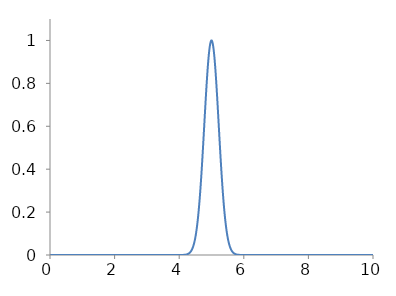
| Category | Series 0 |
|---|---|
| 0.0 | 0 |
| 0.001 | 0 |
| 0.002 | 0 |
| 0.003 | 0 |
| 0.004 | 0 |
| 0.005 | 0 |
| 0.006 | 0 |
| 0.007 | 0 |
| 0.008 | 0 |
| 0.009 | 0 |
| 0.01 | 0 |
| 0.011 | 0 |
| 0.012 | 0 |
| 0.013 | 0 |
| 0.014 | 0 |
| 0.015 | 0 |
| 0.016 | 0 |
| 0.017 | 0 |
| 0.018 | 0 |
| 0.019 | 0 |
| 0.02 | 0 |
| 0.021 | 0 |
| 0.022 | 0 |
| 0.023 | 0 |
| 0.024 | 0 |
| 0.025 | 0 |
| 0.026 | 0 |
| 0.027 | 0 |
| 0.028 | 0 |
| 0.029 | 0 |
| 0.03 | 0 |
| 0.031 | 0 |
| 0.032 | 0 |
| 0.033 | 0 |
| 0.034 | 0 |
| 0.035 | 0 |
| 0.036 | 0 |
| 0.037 | 0 |
| 0.038 | 0 |
| 0.039 | 0 |
| 0.04 | 0 |
| 0.041 | 0 |
| 0.042 | 0 |
| 0.043 | 0 |
| 0.044 | 0 |
| 0.045 | 0 |
| 0.046 | 0 |
| 0.047 | 0 |
| 0.048 | 0 |
| 0.049 | 0 |
| 0.05 | 0 |
| 0.051 | 0 |
| 0.052 | 0 |
| 0.053 | 0 |
| 0.054 | 0 |
| 0.055 | 0 |
| 0.056 | 0 |
| 0.057 | 0 |
| 0.058 | 0 |
| 0.059 | 0 |
| 0.06 | 0 |
| 0.061 | 0 |
| 0.062 | 0 |
| 0.063 | 0 |
| 0.064 | 0 |
| 0.065 | 0 |
| 0.066 | 0 |
| 0.067 | 0 |
| 0.068 | 0 |
| 0.069 | 0 |
| 0.07 | 0 |
| 0.071 | 0 |
| 0.072 | 0 |
| 0.073 | 0 |
| 0.074 | 0 |
| 0.075 | 0 |
| 0.076 | 0 |
| 0.077 | 0 |
| 0.078 | 0 |
| 0.079 | 0 |
| 0.08 | 0 |
| 0.081 | 0 |
| 0.082 | 0 |
| 0.083 | 0 |
| 0.084 | 0 |
| 0.085 | 0 |
| 0.086 | 0 |
| 0.087 | 0 |
| 0.088 | 0 |
| 0.089 | 0 |
| 0.09 | 0 |
| 0.091 | 0 |
| 0.092 | 0 |
| 0.093 | 0 |
| 0.094 | 0 |
| 0.095 | 0 |
| 0.096 | 0 |
| 0.097 | 0 |
| 0.098 | 0 |
| 0.099 | 0 |
| 0.1 | 0 |
| 0.101 | 0 |
| 0.102 | 0 |
| 0.103 | 0 |
| 0.104 | 0 |
| 0.105 | 0 |
| 0.106 | 0 |
| 0.107 | 0 |
| 0.108 | 0 |
| 0.109 | 0 |
| 0.11 | 0 |
| 0.111 | 0 |
| 0.112 | 0 |
| 0.113 | 0 |
| 0.114 | 0 |
| 0.115 | 0 |
| 0.116 | 0 |
| 0.117 | 0 |
| 0.118 | 0 |
| 0.119 | 0 |
| 0.12 | 0 |
| 0.121 | 0 |
| 0.122 | 0 |
| 0.123 | 0 |
| 0.124 | 0 |
| 0.125 | 0 |
| 0.126 | 0 |
| 0.127 | 0 |
| 0.128 | 0 |
| 0.129 | 0 |
| 0.13 | 0 |
| 0.131 | 0 |
| 0.132 | 0 |
| 0.133 | 0 |
| 0.134 | 0 |
| 0.135 | 0 |
| 0.136 | 0 |
| 0.137 | 0 |
| 0.138 | 0 |
| 0.139 | 0 |
| 0.14 | 0 |
| 0.141 | 0 |
| 0.142 | 0 |
| 0.143 | 0 |
| 0.144 | 0 |
| 0.145 | 0 |
| 0.146 | 0 |
| 0.147 | 0 |
| 0.148 | 0 |
| 0.149 | 0 |
| 0.15 | 0 |
| 0.151 | 0 |
| 0.152 | 0 |
| 0.153 | 0 |
| 0.154 | 0 |
| 0.155 | 0 |
| 0.156 | 0 |
| 0.157 | 0 |
| 0.158 | 0 |
| 0.159 | 0 |
| 0.16 | 0 |
| 0.161 | 0 |
| 0.162 | 0 |
| 0.163 | 0 |
| 0.164 | 0 |
| 0.165 | 0 |
| 0.166 | 0 |
| 0.167 | 0 |
| 0.168 | 0 |
| 0.169 | 0 |
| 0.17 | 0 |
| 0.171 | 0 |
| 0.172 | 0 |
| 0.173 | 0 |
| 0.174 | 0 |
| 0.175 | 0 |
| 0.176 | 0 |
| 0.177 | 0 |
| 0.178 | 0 |
| 0.179 | 0 |
| 0.18 | 0 |
| 0.181 | 0 |
| 0.182 | 0 |
| 0.183 | 0 |
| 0.184 | 0 |
| 0.185 | 0 |
| 0.186 | 0 |
| 0.187 | 0 |
| 0.188 | 0 |
| 0.189 | 0 |
| 0.19 | 0 |
| 0.191 | 0 |
| 0.192 | 0 |
| 0.193 | 0 |
| 0.194 | 0 |
| 0.195 | 0 |
| 0.196 | 0 |
| 0.197 | 0 |
| 0.198 | 0 |
| 0.199 | 0 |
| 0.2 | 0 |
| 0.201 | 0 |
| 0.202 | 0 |
| 0.203 | 0 |
| 0.204 | 0 |
| 0.205 | 0 |
| 0.206 | 0 |
| 0.207 | 0 |
| 0.208 | 0 |
| 0.209 | 0 |
| 0.21 | 0 |
| 0.211 | 0 |
| 0.212 | 0 |
| 0.213 | 0 |
| 0.214 | 0 |
| 0.215 | 0 |
| 0.216 | 0 |
| 0.217 | 0 |
| 0.218 | 0 |
| 0.219 | 0 |
| 0.22 | 0 |
| 0.221 | 0 |
| 0.222 | 0 |
| 0.223 | 0 |
| 0.224 | 0 |
| 0.225 | 0 |
| 0.226 | 0 |
| 0.227 | 0 |
| 0.228 | 0 |
| 0.229 | 0 |
| 0.23 | 0 |
| 0.231 | 0 |
| 0.232 | 0 |
| 0.233 | 0 |
| 0.234 | 0 |
| 0.235 | 0 |
| 0.236 | 0 |
| 0.237 | 0 |
| 0.238 | 0 |
| 0.239 | 0 |
| 0.24 | 0 |
| 0.241 | 0 |
| 0.242 | 0 |
| 0.243 | 0 |
| 0.244 | 0 |
| 0.245 | 0 |
| 0.246 | 0 |
| 0.247 | 0 |
| 0.248 | 0 |
| 0.249 | 0 |
| 0.25 | 0 |
| 0.251 | 0 |
| 0.252 | 0 |
| 0.253 | 0 |
| 0.254 | 0 |
| 0.255 | 0 |
| 0.256 | 0 |
| 0.257 | 0 |
| 0.258 | 0 |
| 0.259 | 0 |
| 0.26 | 0 |
| 0.261 | 0 |
| 0.262 | 0 |
| 0.263 | 0 |
| 0.264 | 0 |
| 0.265 | 0 |
| 0.266 | 0 |
| 0.267 | 0 |
| 0.268 | 0 |
| 0.269 | 0 |
| 0.27 | 0 |
| 0.271 | 0 |
| 0.272 | 0 |
| 0.273 | 0 |
| 0.274 | 0 |
| 0.275 | 0 |
| 0.276 | 0 |
| 0.277 | 0 |
| 0.278 | 0 |
| 0.279 | 0 |
| 0.28 | 0 |
| 0.281 | 0 |
| 0.282 | 0 |
| 0.283 | 0 |
| 0.284 | 0 |
| 0.285 | 0 |
| 0.286 | 0 |
| 0.287 | 0 |
| 0.288 | 0 |
| 0.289 | 0 |
| 0.29 | 0 |
| 0.291 | 0 |
| 0.292 | 0 |
| 0.293 | 0 |
| 0.294 | 0 |
| 0.295 | 0 |
| 0.296 | 0 |
| 0.297 | 0 |
| 0.298 | 0 |
| 0.299 | 0 |
| 0.3 | 0 |
| 0.301 | 0 |
| 0.302 | 0 |
| 0.303 | 0 |
| 0.304 | 0 |
| 0.305 | 0 |
| 0.306 | 0 |
| 0.307 | 0 |
| 0.308 | 0 |
| 0.309 | 0 |
| 0.31 | 0 |
| 0.311 | 0 |
| 0.312 | 0 |
| 0.313 | 0 |
| 0.314 | 0 |
| 0.315 | 0 |
| 0.316 | 0 |
| 0.317 | 0 |
| 0.318 | 0 |
| 0.319 | 0 |
| 0.32 | 0 |
| 0.321 | 0 |
| 0.322 | 0 |
| 0.323 | 0 |
| 0.324 | 0 |
| 0.325 | 0 |
| 0.326 | 0 |
| 0.327 | 0 |
| 0.328 | 0 |
| 0.329 | 0 |
| 0.33 | 0 |
| 0.331 | 0 |
| 0.332 | 0 |
| 0.333 | 0 |
| 0.334 | 0 |
| 0.335 | 0 |
| 0.336 | 0 |
| 0.337 | 0 |
| 0.338 | 0 |
| 0.339 | 0 |
| 0.34 | 0 |
| 0.341 | 0 |
| 0.342 | 0 |
| 0.343 | 0 |
| 0.344 | 0 |
| 0.345 | 0 |
| 0.346 | 0 |
| 0.347 | 0 |
| 0.348 | 0 |
| 0.349 | 0 |
| 0.35 | 0 |
| 0.351 | 0 |
| 0.352 | 0 |
| 0.353 | 0 |
| 0.354 | 0 |
| 0.355 | 0 |
| 0.356 | 0 |
| 0.357 | 0 |
| 0.358 | 0 |
| 0.359 | 0 |
| 0.36 | 0 |
| 0.361 | 0 |
| 0.362 | 0 |
| 0.363 | 0 |
| 0.364 | 0 |
| 0.365 | 0 |
| 0.366 | 0 |
| 0.367 | 0 |
| 0.368 | 0 |
| 0.369 | 0 |
| 0.37 | 0 |
| 0.371 | 0 |
| 0.372 | 0 |
| 0.373 | 0 |
| 0.374 | 0 |
| 0.375 | 0 |
| 0.376 | 0 |
| 0.377 | 0 |
| 0.378 | 0 |
| 0.379 | 0 |
| 0.38 | 0 |
| 0.381 | 0 |
| 0.382 | 0 |
| 0.383 | 0 |
| 0.384 | 0 |
| 0.385 | 0 |
| 0.386 | 0 |
| 0.387 | 0 |
| 0.388 | 0 |
| 0.389 | 0 |
| 0.39 | 0 |
| 0.391 | 0 |
| 0.392 | 0 |
| 0.393 | 0 |
| 0.394 | 0 |
| 0.395 | 0 |
| 0.396 | 0 |
| 0.397 | 0 |
| 0.398 | 0 |
| 0.399 | 0 |
| 0.4 | 0 |
| 0.401 | 0 |
| 0.402 | 0 |
| 0.403 | 0 |
| 0.404 | 0 |
| 0.405 | 0 |
| 0.406 | 0 |
| 0.407 | 0 |
| 0.408 | 0 |
| 0.409 | 0 |
| 0.41 | 0 |
| 0.411 | 0 |
| 0.412 | 0 |
| 0.413 | 0 |
| 0.414 | 0 |
| 0.415 | 0 |
| 0.416 | 0 |
| 0.417 | 0 |
| 0.418 | 0 |
| 0.419 | 0 |
| 0.42 | 0 |
| 0.421 | 0 |
| 0.422 | 0 |
| 0.423 | 0 |
| 0.424 | 0 |
| 0.425 | 0 |
| 0.426 | 0 |
| 0.427 | 0 |
| 0.428 | 0 |
| 0.429 | 0 |
| 0.43 | 0 |
| 0.431 | 0 |
| 0.432 | 0 |
| 0.433 | 0 |
| 0.434 | 0 |
| 0.435 | 0 |
| 0.436 | 0 |
| 0.437 | 0 |
| 0.438 | 0 |
| 0.439 | 0 |
| 0.44 | 0 |
| 0.441 | 0 |
| 0.442 | 0 |
| 0.443 | 0 |
| 0.444 | 0 |
| 0.445 | 0 |
| 0.446 | 0 |
| 0.447 | 0 |
| 0.448 | 0 |
| 0.449 | 0 |
| 0.45 | 0 |
| 0.451 | 0 |
| 0.452 | 0 |
| 0.453 | 0 |
| 0.454 | 0 |
| 0.455 | 0 |
| 0.456 | 0 |
| 0.457 | 0 |
| 0.458 | 0 |
| 0.459 | 0 |
| 0.46 | 0 |
| 0.461 | 0 |
| 0.462 | 0 |
| 0.463 | 0 |
| 0.464 | 0 |
| 0.465 | 0 |
| 0.466 | 0 |
| 0.467 | 0 |
| 0.468 | 0 |
| 0.469 | 0 |
| 0.47 | 0 |
| 0.471 | 0 |
| 0.472 | 0 |
| 0.473 | 0 |
| 0.474 | 0 |
| 0.475 | 0 |
| 0.476 | 0 |
| 0.477 | 0 |
| 0.478 | 0 |
| 0.479 | 0 |
| 0.48 | 0 |
| 0.481 | 0 |
| 0.482 | 0 |
| 0.483 | 0 |
| 0.484 | 0 |
| 0.485 | 0 |
| 0.486 | 0 |
| 0.487 | 0 |
| 0.488 | 0 |
| 0.489 | 0 |
| 0.49 | 0 |
| 0.491 | 0 |
| 0.492 | 0 |
| 0.493 | 0 |
| 0.494 | 0 |
| 0.495 | 0 |
| 0.496 | 0 |
| 0.497 | 0 |
| 0.498 | 0 |
| 0.499 | 0 |
| 0.5 | 0 |
| 0.501 | 0 |
| 0.502 | 0 |
| 0.503 | 0 |
| 0.504 | 0 |
| 0.505 | 0 |
| 0.506 | 0 |
| 0.507 | 0 |
| 0.508 | 0 |
| 0.509 | 0 |
| 0.51 | 0 |
| 0.511 | 0 |
| 0.512 | 0 |
| 0.513 | 0 |
| 0.514 | 0 |
| 0.515 | 0 |
| 0.516 | 0 |
| 0.517 | 0 |
| 0.518 | 0 |
| 0.519 | 0 |
| 0.52 | 0 |
| 0.521 | 0 |
| 0.522 | 0 |
| 0.523 | 0 |
| 0.524 | 0 |
| 0.525 | 0 |
| 0.526 | 0 |
| 0.527 | 0 |
| 0.528 | 0 |
| 0.529 | 0 |
| 0.53 | 0 |
| 0.531 | 0 |
| 0.532 | 0 |
| 0.533 | 0 |
| 0.534 | 0 |
| 0.535 | 0 |
| 0.536 | 0 |
| 0.537 | 0 |
| 0.538 | 0 |
| 0.539 | 0 |
| 0.54 | 0 |
| 0.541 | 0 |
| 0.542 | 0 |
| 0.543 | 0 |
| 0.544 | 0 |
| 0.545 | 0 |
| 0.546 | 0 |
| 0.547 | 0 |
| 0.548 | 0 |
| 0.549 | 0 |
| 0.55 | 0 |
| 0.551 | 0 |
| 0.552 | 0 |
| 0.553 | 0 |
| 0.554 | 0 |
| 0.555 | 0 |
| 0.556 | 0 |
| 0.557 | 0 |
| 0.558 | 0 |
| 0.559 | 0 |
| 0.56 | 0 |
| 0.561 | 0 |
| 0.562 | 0 |
| 0.563 | 0 |
| 0.564 | 0 |
| 0.565 | 0 |
| 0.566 | 0 |
| 0.567 | 0 |
| 0.568 | 0 |
| 0.569 | 0 |
| 0.57 | 0 |
| 0.571 | 0 |
| 0.572 | 0 |
| 0.573 | 0 |
| 0.574 | 0 |
| 0.575 | 0 |
| 0.576 | 0 |
| 0.577 | 0 |
| 0.578 | 0 |
| 0.579 | 0 |
| 0.58 | 0 |
| 0.581 | 0 |
| 0.582 | 0 |
| 0.583 | 0 |
| 0.584 | 0 |
| 0.585 | 0 |
| 0.586 | 0 |
| 0.587 | 0 |
| 0.588 | 0 |
| 0.589 | 0 |
| 0.59 | 0 |
| 0.591 | 0 |
| 0.592 | 0 |
| 0.593 | 0 |
| 0.594 | 0 |
| 0.595 | 0 |
| 0.596 | 0 |
| 0.597 | 0 |
| 0.598 | 0 |
| 0.599 | 0 |
| 0.6 | 0 |
| 0.601 | 0 |
| 0.602 | 0 |
| 0.603 | 0 |
| 0.604 | 0 |
| 0.605 | 0 |
| 0.606 | 0 |
| 0.607 | 0 |
| 0.608 | 0 |
| 0.609 | 0 |
| 0.61 | 0 |
| 0.611 | 0 |
| 0.612 | 0 |
| 0.613 | 0 |
| 0.614 | 0 |
| 0.615 | 0 |
| 0.616 | 0 |
| 0.617 | 0 |
| 0.618 | 0 |
| 0.619 | 0 |
| 0.62 | 0 |
| 0.621 | 0 |
| 0.622 | 0 |
| 0.623 | 0 |
| 0.624 | 0 |
| 0.625 | 0 |
| 0.626 | 0 |
| 0.627 | 0 |
| 0.628 | 0 |
| 0.629 | 0 |
| 0.63 | 0 |
| 0.631 | 0 |
| 0.632 | 0 |
| 0.633 | 0 |
| 0.634 | 0 |
| 0.635 | 0 |
| 0.636 | 0 |
| 0.637 | 0 |
| 0.638 | 0 |
| 0.639 | 0 |
| 0.64 | 0 |
| 0.641 | 0 |
| 0.642 | 0 |
| 0.643 | 0 |
| 0.644 | 0 |
| 0.645 | 0 |
| 0.646 | 0 |
| 0.647 | 0 |
| 0.648 | 0 |
| 0.649 | 0 |
| 0.65 | 0 |
| 0.651 | 0 |
| 0.652 | 0 |
| 0.653 | 0 |
| 0.654 | 0 |
| 0.655 | 0 |
| 0.656 | 0 |
| 0.657 | 0 |
| 0.658 | 0 |
| 0.659 | 0 |
| 0.66 | 0 |
| 0.661 | 0 |
| 0.662 | 0 |
| 0.663 | 0 |
| 0.664 | 0 |
| 0.665 | 0 |
| 0.666 | 0 |
| 0.667 | 0 |
| 0.668 | 0 |
| 0.669 | 0 |
| 0.67 | 0 |
| 0.671 | 0 |
| 0.672 | 0 |
| 0.673 | 0 |
| 0.674 | 0 |
| 0.675 | 0 |
| 0.676 | 0 |
| 0.677 | 0 |
| 0.678 | 0 |
| 0.679 | 0 |
| 0.68 | 0 |
| 0.681 | 0 |
| 0.682 | 0 |
| 0.683 | 0 |
| 0.684 | 0 |
| 0.685 | 0 |
| 0.686 | 0 |
| 0.687 | 0 |
| 0.688 | 0 |
| 0.689 | 0 |
| 0.69 | 0 |
| 0.691 | 0 |
| 0.692 | 0 |
| 0.693 | 0 |
| 0.694 | 0 |
| 0.695 | 0 |
| 0.696 | 0 |
| 0.697 | 0 |
| 0.698 | 0 |
| 0.699 | 0 |
| 0.7 | 0 |
| 0.701 | 0 |
| 0.702 | 0 |
| 0.703 | 0 |
| 0.704 | 0 |
| 0.705 | 0 |
| 0.706 | 0 |
| 0.707 | 0 |
| 0.708 | 0 |
| 0.709 | 0 |
| 0.71 | 0 |
| 0.711 | 0 |
| 0.712 | 0 |
| 0.713 | 0 |
| 0.714 | 0 |
| 0.715 | 0 |
| 0.716 | 0 |
| 0.717 | 0 |
| 0.718 | 0 |
| 0.719 | 0 |
| 0.72 | 0 |
| 0.721 | 0 |
| 0.722 | 0 |
| 0.723 | 0 |
| 0.724 | 0 |
| 0.725 | 0 |
| 0.726 | 0 |
| 0.727 | 0 |
| 0.728 | 0 |
| 0.729 | 0 |
| 0.73 | 0 |
| 0.731 | 0 |
| 0.732 | 0 |
| 0.733 | 0 |
| 0.734 | 0 |
| 0.735 | 0 |
| 0.736 | 0 |
| 0.737 | 0 |
| 0.738 | 0 |
| 0.739 | 0 |
| 0.74 | 0 |
| 0.741 | 0 |
| 0.742 | 0 |
| 0.743 | 0 |
| 0.744 | 0 |
| 0.745 | 0 |
| 0.746 | 0 |
| 0.747 | 0 |
| 0.748 | 0 |
| 0.749 | 0 |
| 0.75 | 0 |
| 0.751 | 0 |
| 0.752 | 0 |
| 0.753 | 0 |
| 0.754 | 0 |
| 0.755 | 0 |
| 0.756 | 0 |
| 0.757 | 0 |
| 0.758 | 0 |
| 0.759 | 0 |
| 0.76 | 0 |
| 0.761 | 0 |
| 0.762 | 0 |
| 0.763 | 0 |
| 0.764 | 0 |
| 0.765 | 0 |
| 0.766 | 0 |
| 0.767 | 0 |
| 0.768 | 0 |
| 0.769 | 0 |
| 0.77 | 0 |
| 0.771 | 0 |
| 0.772 | 0 |
| 0.773 | 0 |
| 0.774 | 0 |
| 0.775 | 0 |
| 0.776 | 0 |
| 0.777 | 0 |
| 0.778 | 0 |
| 0.779 | 0 |
| 0.78 | 0 |
| 0.781 | 0 |
| 0.782 | 0 |
| 0.783 | 0 |
| 0.784 | 0 |
| 0.785 | 0 |
| 0.786 | 0 |
| 0.787 | 0 |
| 0.788 | 0 |
| 0.789 | 0 |
| 0.79 | 0 |
| 0.791 | 0 |
| 0.792 | 0 |
| 0.793 | 0 |
| 0.794 | 0 |
| 0.795 | 0 |
| 0.796 | 0 |
| 0.797 | 0 |
| 0.798 | 0 |
| 0.799 | 0 |
| 0.8 | 0 |
| 0.801 | 0 |
| 0.802 | 0 |
| 0.803 | 0 |
| 0.804 | 0 |
| 0.805 | 0 |
| 0.806 | 0 |
| 0.807 | 0 |
| 0.808 | 0 |
| 0.809 | 0 |
| 0.81 | 0 |
| 0.811 | 0 |
| 0.812 | 0 |
| 0.813 | 0 |
| 0.814 | 0 |
| 0.815 | 0 |
| 0.816 | 0 |
| 0.817 | 0 |
| 0.818 | 0 |
| 0.819 | 0 |
| 0.82 | 0 |
| 0.821 | 0 |
| 0.822 | 0 |
| 0.823 | 0 |
| 0.824 | 0 |
| 0.825 | 0 |
| 0.826 | 0 |
| 0.827 | 0 |
| 0.828 | 0 |
| 0.829 | 0 |
| 0.83 | 0 |
| 0.831 | 0 |
| 0.832 | 0 |
| 0.833 | 0 |
| 0.834 | 0 |
| 0.835 | 0 |
| 0.836 | 0 |
| 0.837 | 0 |
| 0.838 | 0 |
| 0.839 | 0 |
| 0.84 | 0 |
| 0.841 | 0 |
| 0.842 | 0 |
| 0.843 | 0 |
| 0.844 | 0 |
| 0.845 | 0 |
| 0.846 | 0 |
| 0.847 | 0 |
| 0.848 | 0 |
| 0.849 | 0 |
| 0.85 | 0 |
| 0.851 | 0 |
| 0.852 | 0 |
| 0.853 | 0 |
| 0.854 | 0 |
| 0.855 | 0 |
| 0.856 | 0 |
| 0.857 | 0 |
| 0.858 | 0 |
| 0.859 | 0 |
| 0.86 | 0 |
| 0.861 | 0 |
| 0.862 | 0 |
| 0.863 | 0 |
| 0.864 | 0 |
| 0.865 | 0 |
| 0.866 | 0 |
| 0.867 | 0 |
| 0.868 | 0 |
| 0.869 | 0 |
| 0.87 | 0 |
| 0.871 | 0 |
| 0.872 | 0 |
| 0.873 | 0 |
| 0.874 | 0 |
| 0.875 | 0 |
| 0.876 | 0 |
| 0.877 | 0 |
| 0.878 | 0 |
| 0.879 | 0 |
| 0.88 | 0 |
| 0.881 | 0 |
| 0.882 | 0 |
| 0.883 | 0 |
| 0.884 | 0 |
| 0.885 | 0 |
| 0.886 | 0 |
| 0.887 | 0 |
| 0.888 | 0 |
| 0.889 | 0 |
| 0.89 | 0 |
| 0.891 | 0 |
| 0.892 | 0 |
| 0.893 | 0 |
| 0.894 | 0 |
| 0.895 | 0 |
| 0.896 | 0 |
| 0.897 | 0 |
| 0.898 | 0 |
| 0.899 | 0 |
| 0.9 | 0 |
| 0.901 | 0 |
| 0.902 | 0 |
| 0.903 | 0 |
| 0.904 | 0 |
| 0.905 | 0 |
| 0.906 | 0 |
| 0.907 | 0 |
| 0.908 | 0 |
| 0.909 | 0 |
| 0.91 | 0 |
| 0.911 | 0 |
| 0.912 | 0 |
| 0.913 | 0 |
| 0.914 | 0 |
| 0.915 | 0 |
| 0.916 | 0 |
| 0.917 | 0 |
| 0.918 | 0 |
| 0.919 | 0 |
| 0.92 | 0 |
| 0.921 | 0 |
| 0.922 | 0 |
| 0.923 | 0 |
| 0.924 | 0 |
| 0.925 | 0 |
| 0.926 | 0 |
| 0.927 | 0 |
| 0.928 | 0 |
| 0.929 | 0 |
| 0.93 | 0 |
| 0.931 | 0 |
| 0.932 | 0 |
| 0.933 | 0 |
| 0.934 | 0 |
| 0.935 | 0 |
| 0.936 | 0 |
| 0.937 | 0 |
| 0.938 | 0 |
| 0.939 | 0 |
| 0.94 | 0 |
| 0.941 | 0 |
| 0.942 | 0 |
| 0.943 | 0 |
| 0.944 | 0 |
| 0.945 | 0 |
| 0.946 | 0 |
| 0.947 | 0 |
| 0.948 | 0 |
| 0.949 | 0 |
| 0.95 | 0 |
| 0.951 | 0 |
| 0.952 | 0 |
| 0.953 | 0 |
| 0.954 | 0 |
| 0.955 | 0 |
| 0.956 | 0 |
| 0.957 | 0 |
| 0.958 | 0 |
| 0.959 | 0 |
| 0.96 | 0 |
| 0.961 | 0 |
| 0.962 | 0 |
| 0.963 | 0 |
| 0.964 | 0 |
| 0.965 | 0 |
| 0.966 | 0 |
| 0.967 | 0 |
| 0.968 | 0 |
| 0.969 | 0 |
| 0.97 | 0 |
| 0.971 | 0 |
| 0.972 | 0 |
| 0.973 | 0 |
| 0.974 | 0 |
| 0.975 | 0 |
| 0.976 | 0 |
| 0.977 | 0 |
| 0.978 | 0 |
| 0.979 | 0 |
| 0.98 | 0 |
| 0.981 | 0 |
| 0.982 | 0 |
| 0.983 | 0 |
| 0.984 | 0 |
| 0.985 | 0 |
| 0.986 | 0 |
| 0.987 | 0 |
| 0.988 | 0 |
| 0.989 | 0 |
| 0.99 | 0 |
| 0.991 | 0 |
| 0.992 | 0 |
| 0.993 | 0 |
| 0.994 | 0 |
| 0.995 | 0 |
| 0.996 | 0 |
| 0.997 | 0 |
| 0.998 | 0 |
| 0.999 | 0 |
| 1.0 | 0 |
| 1.001 | 0 |
| 1.002 | 0 |
| 1.003 | 0 |
| 1.004 | 0 |
| 1.005 | 0 |
| 1.006 | 0 |
| 1.007 | 0 |
| 1.008 | 0 |
| 1.009 | 0 |
| 1.01 | 0 |
| 1.011 | 0 |
| 1.012 | 0 |
| 1.013 | 0 |
| 1.014 | 0 |
| 1.015 | 0 |
| 1.016 | 0 |
| 1.017 | 0 |
| 1.018 | 0 |
| 1.019 | 0 |
| 1.02 | 0 |
| 1.021 | 0 |
| 1.022 | 0 |
| 1.023 | 0 |
| 1.024 | 0 |
| 1.025 | 0 |
| 1.026 | 0 |
| 1.027 | 0 |
| 1.028 | 0 |
| 1.029 | 0 |
| 1.03 | 0 |
| 1.031 | 0 |
| 1.032 | 0 |
| 1.033 | 0 |
| 1.034 | 0 |
| 1.035 | 0 |
| 1.036 | 0 |
| 1.037 | 0 |
| 1.038 | 0 |
| 1.039 | 0 |
| 1.04 | 0 |
| 1.041 | 0 |
| 1.042 | 0 |
| 1.043 | 0 |
| 1.044 | 0 |
| 1.045 | 0 |
| 1.046 | 0 |
| 1.047 | 0 |
| 1.048 | 0 |
| 1.049 | 0 |
| 1.05 | 0 |
| 1.051 | 0 |
| 1.052 | 0 |
| 1.053 | 0 |
| 1.054 | 0 |
| 1.055 | 0 |
| 1.056 | 0 |
| 1.057 | 0 |
| 1.058 | 0 |
| 1.059 | 0 |
| 1.06 | 0 |
| 1.061 | 0 |
| 1.062 | 0 |
| 1.063 | 0 |
| 1.064 | 0 |
| 1.065 | 0 |
| 1.066 | 0 |
| 1.067 | 0 |
| 1.068 | 0 |
| 1.069 | 0 |
| 1.07 | 0 |
| 1.071 | 0 |
| 1.072 | 0 |
| 1.073 | 0 |
| 1.074 | 0 |
| 1.075 | 0 |
| 1.076 | 0 |
| 1.077 | 0 |
| 1.078 | 0 |
| 1.079 | 0 |
| 1.08 | 0 |
| 1.081 | 0 |
| 1.082 | 0 |
| 1.083 | 0 |
| 1.084 | 0 |
| 1.085 | 0 |
| 1.086 | 0 |
| 1.087 | 0 |
| 1.088 | 0 |
| 1.089 | 0 |
| 1.09 | 0 |
| 1.091 | 0 |
| 1.092 | 0 |
| 1.093 | 0 |
| 1.094 | 0 |
| 1.095 | 0 |
| 1.096 | 0 |
| 1.097 | 0 |
| 1.098 | 0 |
| 1.099 | 0 |
| 1.1 | 0 |
| 1.101 | 0 |
| 1.102 | 0 |
| 1.103 | 0 |
| 1.104 | 0 |
| 1.105 | 0 |
| 1.106 | 0 |
| 1.107 | 0 |
| 1.108 | 0 |
| 1.109 | 0 |
| 1.11 | 0 |
| 1.111 | 0 |
| 1.112 | 0 |
| 1.113 | 0 |
| 1.114 | 0 |
| 1.115 | 0 |
| 1.116 | 0 |
| 1.117 | 0 |
| 1.118 | 0 |
| 1.119 | 0 |
| 1.12 | 0 |
| 1.121 | 0 |
| 1.122 | 0 |
| 1.123 | 0 |
| 1.124 | 0 |
| 1.125 | 0 |
| 1.126 | 0 |
| 1.127 | 0 |
| 1.128 | 0 |
| 1.129 | 0 |
| 1.13 | 0 |
| 1.131 | 0 |
| 1.132 | 0 |
| 1.133 | 0 |
| 1.134 | 0 |
| 1.135 | 0 |
| 1.136 | 0 |
| 1.137 | 0 |
| 1.138 | 0 |
| 1.139 | 0 |
| 1.14 | 0 |
| 1.141 | 0 |
| 1.142 | 0 |
| 1.143 | 0 |
| 1.144 | 0 |
| 1.145 | 0 |
| 1.146 | 0 |
| 1.147 | 0 |
| 1.148 | 0 |
| 1.149 | 0 |
| 1.15 | 0 |
| 1.151 | 0 |
| 1.152 | 0 |
| 1.153 | 0 |
| 1.154 | 0 |
| 1.155 | 0 |
| 1.156 | 0 |
| 1.157 | 0 |
| 1.158 | 0 |
| 1.159 | 0 |
| 1.16 | 0 |
| 1.161 | 0 |
| 1.162 | 0 |
| 1.163 | 0 |
| 1.164 | 0 |
| 1.165 | 0 |
| 1.166 | 0 |
| 1.167 | 0 |
| 1.168 | 0 |
| 1.169 | 0 |
| 1.17 | 0 |
| 1.171 | 0 |
| 1.172 | 0 |
| 1.173 | 0 |
| 1.174 | 0 |
| 1.175 | 0 |
| 1.176 | 0 |
| 1.177 | 0 |
| 1.178 | 0 |
| 1.179 | 0 |
| 1.18 | 0 |
| 1.181 | 0 |
| 1.182 | 0 |
| 1.183 | 0 |
| 1.184 | 0 |
| 1.185 | 0 |
| 1.186 | 0 |
| 1.187 | 0 |
| 1.188 | 0 |
| 1.189 | 0 |
| 1.19 | 0 |
| 1.191 | 0 |
| 1.192 | 0 |
| 1.193 | 0 |
| 1.194 | 0 |
| 1.195 | 0 |
| 1.196 | 0 |
| 1.197 | 0 |
| 1.198 | 0 |
| 1.199 | 0 |
| 1.2 | 0 |
| 1.201 | 0 |
| 1.202 | 0 |
| 1.203 | 0 |
| 1.204 | 0 |
| 1.205 | 0 |
| 1.206 | 0 |
| 1.207 | 0 |
| 1.208 | 0 |
| 1.209 | 0 |
| 1.21 | 0 |
| 1.211 | 0 |
| 1.212 | 0 |
| 1.213 | 0 |
| 1.214 | 0 |
| 1.215 | 0 |
| 1.216 | 0 |
| 1.217 | 0 |
| 1.218 | 0 |
| 1.219 | 0 |
| 1.22 | 0 |
| 1.221 | 0 |
| 1.222 | 0 |
| 1.223 | 0 |
| 1.224 | 0 |
| 1.225 | 0 |
| 1.226 | 0 |
| 1.227 | 0 |
| 1.228 | 0 |
| 1.229 | 0 |
| 1.23 | 0 |
| 1.231 | 0 |
| 1.232 | 0 |
| 1.233 | 0 |
| 1.234 | 0 |
| 1.235 | 0 |
| 1.236 | 0 |
| 1.237 | 0 |
| 1.238 | 0 |
| 1.239 | 0 |
| 1.24 | 0 |
| 1.241 | 0 |
| 1.242 | 0 |
| 1.243 | 0 |
| 1.244 | 0 |
| 1.245 | 0 |
| 1.246 | 0 |
| 1.247 | 0 |
| 1.248 | 0 |
| 1.249 | 0 |
| 1.25 | 0 |
| 1.251 | 0 |
| 1.252 | 0 |
| 1.253 | 0 |
| 1.254 | 0 |
| 1.255 | 0 |
| 1.256 | 0 |
| 1.257 | 0 |
| 1.258 | 0 |
| 1.259 | 0 |
| 1.26 | 0 |
| 1.261 | 0 |
| 1.262 | 0 |
| 1.263 | 0 |
| 1.264 | 0 |
| 1.265 | 0 |
| 1.266 | 0 |
| 1.267 | 0 |
| 1.268 | 0 |
| 1.269 | 0 |
| 1.27 | 0 |
| 1.271 | 0 |
| 1.272 | 0 |
| 1.273 | 0 |
| 1.274 | 0 |
| 1.275 | 0 |
| 1.276 | 0 |
| 1.277 | 0 |
| 1.278 | 0 |
| 1.279 | 0 |
| 1.28 | 0 |
| 1.281 | 0 |
| 1.282 | 0 |
| 1.283 | 0 |
| 1.284 | 0 |
| 1.285 | 0 |
| 1.286 | 0 |
| 1.287 | 0 |
| 1.288 | 0 |
| 1.289 | 0 |
| 1.29 | 0 |
| 1.291 | 0 |
| 1.292 | 0 |
| 1.293 | 0 |
| 1.294 | 0 |
| 1.295 | 0 |
| 1.296 | 0 |
| 1.297 | 0 |
| 1.298 | 0 |
| 1.299 | 0 |
| 1.3 | 0 |
| 1.301 | 0 |
| 1.302 | 0 |
| 1.303 | 0 |
| 1.304 | 0 |
| 1.305 | 0 |
| 1.306 | 0 |
| 1.307 | 0 |
| 1.308 | 0 |
| 1.309 | 0 |
| 1.31 | 0 |
| 1.311 | 0 |
| 1.312 | 0 |
| 1.313 | 0 |
| 1.314 | 0 |
| 1.315 | 0 |
| 1.316 | 0 |
| 1.317 | 0 |
| 1.318 | 0 |
| 1.319 | 0 |
| 1.32 | 0 |
| 1.321 | 0 |
| 1.322 | 0 |
| 1.323 | 0 |
| 1.324 | 0 |
| 1.325 | 0 |
| 1.326 | 0 |
| 1.327 | 0 |
| 1.328 | 0 |
| 1.329 | 0 |
| 1.33 | 0 |
| 1.331 | 0 |
| 1.332 | 0 |
| 1.333 | 0 |
| 1.334 | 0 |
| 1.335 | 0 |
| 1.336 | 0 |
| 1.337 | 0 |
| 1.338 | 0 |
| 1.339 | 0 |
| 1.34 | 0 |
| 1.341 | 0 |
| 1.342 | 0 |
| 1.343 | 0 |
| 1.344 | 0 |
| 1.345 | 0 |
| 1.346 | 0 |
| 1.347 | 0 |
| 1.348 | 0 |
| 1.349 | 0 |
| 1.35 | 0 |
| 1.351 | 0 |
| 1.352 | 0 |
| 1.353 | 0 |
| 1.354 | 0 |
| 1.355 | 0 |
| 1.356 | 0 |
| 1.357 | 0 |
| 1.358 | 0 |
| 1.359 | 0 |
| 1.36 | 0 |
| 1.361 | 0 |
| 1.362 | 0 |
| 1.363 | 0 |
| 1.364 | 0 |
| 1.365 | 0 |
| 1.366 | 0 |
| 1.367 | 0 |
| 1.368 | 0 |
| 1.369 | 0 |
| 1.37 | 0 |
| 1.371 | 0 |
| 1.372 | 0 |
| 1.373 | 0 |
| 1.374 | 0 |
| 1.375 | 0 |
| 1.376 | 0 |
| 1.377 | 0 |
| 1.378 | 0 |
| 1.379 | 0 |
| 1.38 | 0 |
| 1.381 | 0 |
| 1.382 | 0 |
| 1.383 | 0 |
| 1.384 | 0 |
| 1.385 | 0 |
| 1.386 | 0 |
| 1.387 | 0 |
| 1.388 | 0 |
| 1.389 | 0 |
| 1.39 | 0 |
| 1.391 | 0 |
| 1.392 | 0 |
| 1.393 | 0 |
| 1.394 | 0 |
| 1.395 | 0 |
| 1.396 | 0 |
| 1.397 | 0 |
| 1.398 | 0 |
| 1.399 | 0 |
| 1.4 | 0 |
| 1.401 | 0 |
| 1.402 | 0 |
| 1.403 | 0 |
| 1.404 | 0 |
| 1.405 | 0 |
| 1.406 | 0 |
| 1.407 | 0 |
| 1.408 | 0 |
| 1.409 | 0 |
| 1.41 | 0 |
| 1.411 | 0 |
| 1.412 | 0 |
| 1.413 | 0 |
| 1.414 | 0 |
| 1.415 | 0 |
| 1.416 | 0 |
| 1.417 | 0 |
| 1.418 | 0 |
| 1.419 | 0 |
| 1.42 | 0 |
| 1.421 | 0 |
| 1.422 | 0 |
| 1.423 | 0 |
| 1.424 | 0 |
| 1.425 | 0 |
| 1.426 | 0 |
| 1.427 | 0 |
| 1.428 | 0 |
| 1.429 | 0 |
| 1.43 | 0 |
| 1.431 | 0 |
| 1.432 | 0 |
| 1.433 | 0 |
| 1.434 | 0 |
| 1.435 | 0 |
| 1.436 | 0 |
| 1.437 | 0 |
| 1.438 | 0 |
| 1.439 | 0 |
| 1.44 | 0 |
| 1.441 | 0 |
| 1.442 | 0 |
| 1.443 | 0 |
| 1.444 | 0 |
| 1.445 | 0 |
| 1.446 | 0 |
| 1.447 | 0 |
| 1.448 | 0 |
| 1.449 | 0 |
| 1.45 | 0 |
| 1.451 | 0 |
| 1.452 | 0 |
| 1.453 | 0 |
| 1.454 | 0 |
| 1.455 | 0 |
| 1.456 | 0 |
| 1.457 | 0 |
| 1.458 | 0 |
| 1.459 | 0 |
| 1.46 | 0 |
| 1.461 | 0 |
| 1.462 | 0 |
| 1.463 | 0 |
| 1.464 | 0 |
| 1.465 | 0 |
| 1.466 | 0 |
| 1.467 | 0 |
| 1.468 | 0 |
| 1.469 | 0 |
| 1.47 | 0 |
| 1.471 | 0 |
| 1.472 | 0 |
| 1.473 | 0 |
| 1.474 | 0 |
| 1.475 | 0 |
| 1.476 | 0 |
| 1.477 | 0 |
| 1.478 | 0 |
| 1.479 | 0 |
| 1.48 | 0 |
| 1.481 | 0 |
| 1.482 | 0 |
| 1.483 | 0 |
| 1.484 | 0 |
| 1.485 | 0 |
| 1.486 | 0 |
| 1.487 | 0 |
| 1.488 | 0 |
| 1.489 | 0 |
| 1.49 | 0 |
| 1.491 | 0 |
| 1.492 | 0 |
| 1.493 | 0 |
| 1.494 | 0 |
| 1.495 | 0 |
| 1.496 | 0 |
| 1.497 | 0 |
| 1.498 | 0 |
| 1.499 | 0 |
| 1.5 | 0 |
| 1.501 | 0 |
| 1.502 | 0 |
| 1.503 | 0 |
| 1.504 | 0 |
| 1.505 | 0 |
| 1.506 | 0 |
| 1.507 | 0 |
| 1.508 | 0 |
| 1.509 | 0 |
| 1.51 | 0 |
| 1.511 | 0 |
| 1.512 | 0 |
| 1.513 | 0 |
| 1.514 | 0 |
| 1.515 | 0 |
| 1.516 | 0 |
| 1.517 | 0 |
| 1.518 | 0 |
| 1.519 | 0 |
| 1.52 | 0 |
| 1.521 | 0 |
| 1.522 | 0 |
| 1.523 | 0 |
| 1.524 | 0 |
| 1.525 | 0 |
| 1.526 | 0 |
| 1.527 | 0 |
| 1.528 | 0 |
| 1.529 | 0 |
| 1.53 | 0 |
| 1.531 | 0 |
| 1.532 | 0 |
| 1.533 | 0 |
| 1.534 | 0 |
| 1.535 | 0 |
| 1.536 | 0 |
| 1.537 | 0 |
| 1.538 | 0 |
| 1.539 | 0 |
| 1.54 | 0 |
| 1.541 | 0 |
| 1.542 | 0 |
| 1.543 | 0 |
| 1.544 | 0 |
| 1.545 | 0 |
| 1.546 | 0 |
| 1.547 | 0 |
| 1.548 | 0 |
| 1.549 | 0 |
| 1.55 | 0 |
| 1.551 | 0 |
| 1.552 | 0 |
| 1.553 | 0 |
| 1.554 | 0 |
| 1.555 | 0 |
| 1.556 | 0 |
| 1.557 | 0 |
| 1.558 | 0 |
| 1.559 | 0 |
| 1.56 | 0 |
| 1.561 | 0 |
| 1.562 | 0 |
| 1.563 | 0 |
| 1.564 | 0 |
| 1.565 | 0 |
| 1.566 | 0 |
| 1.567 | 0 |
| 1.568 | 0 |
| 1.569 | 0 |
| 1.57 | 0 |
| 1.571 | 0 |
| 1.572 | 0 |
| 1.573 | 0 |
| 1.574 | 0 |
| 1.575 | 0 |
| 1.576 | 0 |
| 1.577 | 0 |
| 1.578 | 0 |
| 1.579 | 0 |
| 1.58 | 0 |
| 1.581 | 0 |
| 1.582 | 0 |
| 1.583 | 0 |
| 1.584 | 0 |
| 1.585 | 0 |
| 1.586 | 0 |
| 1.587 | 0 |
| 1.588 | 0 |
| 1.589 | 0 |
| 1.59 | 0 |
| 1.591 | 0 |
| 1.592 | 0 |
| 1.593 | 0 |
| 1.594 | 0 |
| 1.595 | 0 |
| 1.596 | 0 |
| 1.597 | 0 |
| 1.598 | 0 |
| 1.599 | 0 |
| 1.6 | 0 |
| 1.601 | 0 |
| 1.602 | 0 |
| 1.603 | 0 |
| 1.604 | 0 |
| 1.605 | 0 |
| 1.606 | 0 |
| 1.607 | 0 |
| 1.608 | 0 |
| 1.609 | 0 |
| 1.61 | 0 |
| 1.611 | 0 |
| 1.612 | 0 |
| 1.613 | 0 |
| 1.614 | 0 |
| 1.615 | 0 |
| 1.616 | 0 |
| 1.617 | 0 |
| 1.618 | 0 |
| 1.619 | 0 |
| 1.62 | 0 |
| 1.621 | 0 |
| 1.622 | 0 |
| 1.623 | 0 |
| 1.624 | 0 |
| 1.625 | 0 |
| 1.626 | 0 |
| 1.627 | 0 |
| 1.628 | 0 |
| 1.629 | 0 |
| 1.63 | 0 |
| 1.631 | 0 |
| 1.632 | 0 |
| 1.633 | 0 |
| 1.634 | 0 |
| 1.635 | 0 |
| 1.636 | 0 |
| 1.637 | 0 |
| 1.638 | 0 |
| 1.639 | 0 |
| 1.64 | 0 |
| 1.641 | 0 |
| 1.642 | 0 |
| 1.643 | 0 |
| 1.644 | 0 |
| 1.645 | 0 |
| 1.646 | 0 |
| 1.647 | 0 |
| 1.648 | 0 |
| 1.649 | 0 |
| 1.65 | 0 |
| 1.651 | 0 |
| 1.652 | 0 |
| 1.653 | 0 |
| 1.654 | 0 |
| 1.655 | 0 |
| 1.656 | 0 |
| 1.657 | 0 |
| 1.658 | 0 |
| 1.659 | 0 |
| 1.66 | 0 |
| 1.661 | 0 |
| 1.662 | 0 |
| 1.663 | 0 |
| 1.664 | 0 |
| 1.665 | 0 |
| 1.666 | 0 |
| 1.667 | 0 |
| 1.668 | 0 |
| 1.669 | 0 |
| 1.67 | 0 |
| 1.671 | 0 |
| 1.672 | 0 |
| 1.673 | 0 |
| 1.674 | 0 |
| 1.675 | 0 |
| 1.676 | 0 |
| 1.677 | 0 |
| 1.678 | 0 |
| 1.679 | 0 |
| 1.68 | 0 |
| 1.681 | 0 |
| 1.682 | 0 |
| 1.683 | 0 |
| 1.684 | 0 |
| 1.685 | 0 |
| 1.686 | 0 |
| 1.687 | 0 |
| 1.688 | 0 |
| 1.689 | 0 |
| 1.69 | 0 |
| 1.691 | 0 |
| 1.692 | 0 |
| 1.693 | 0 |
| 1.694 | 0 |
| 1.695 | 0 |
| 1.696 | 0 |
| 1.697 | 0 |
| 1.698 | 0 |
| 1.699 | 0 |
| 1.7 | 0 |
| 1.701 | 0 |
| 1.702 | 0 |
| 1.703 | 0 |
| 1.704 | 0 |
| 1.705 | 0 |
| 1.706 | 0 |
| 1.707 | 0 |
| 1.708 | 0 |
| 1.709 | 0 |
| 1.71 | 0 |
| 1.711 | 0 |
| 1.712 | 0 |
| 1.713 | 0 |
| 1.714 | 0 |
| 1.715 | 0 |
| 1.716 | 0 |
| 1.717 | 0 |
| 1.718 | 0 |
| 1.719 | 0 |
| 1.72 | 0 |
| 1.721 | 0 |
| 1.722 | 0 |
| 1.723 | 0 |
| 1.724 | 0 |
| 1.725 | 0 |
| 1.726 | 0 |
| 1.727 | 0 |
| 1.728 | 0 |
| 1.729 | 0 |
| 1.73 | 0 |
| 1.731 | 0 |
| 1.732 | 0 |
| 1.733 | 0 |
| 1.734 | 0 |
| 1.735 | 0 |
| 1.736 | 0 |
| 1.737 | 0 |
| 1.738 | 0 |
| 1.739 | 0 |
| 1.74 | 0 |
| 1.741 | 0 |
| 1.742 | 0 |
| 1.743 | 0 |
| 1.744 | 0 |
| 1.745 | 0 |
| 1.746 | 0 |
| 1.747 | 0 |
| 1.748 | 0 |
| 1.749 | 0 |
| 1.75 | 0 |
| 1.751 | 0 |
| 1.752 | 0 |
| 1.753 | 0 |
| 1.754 | 0 |
| 1.755 | 0 |
| 1.756 | 0 |
| 1.757 | 0 |
| 1.758 | 0 |
| 1.759 | 0 |
| 1.76 | 0 |
| 1.761 | 0 |
| 1.762 | 0 |
| 1.763 | 0 |
| 1.764 | 0 |
| 1.765 | 0 |
| 1.766 | 0 |
| 1.767 | 0 |
| 1.768 | 0 |
| 1.769 | 0 |
| 1.77 | 0 |
| 1.771 | 0 |
| 1.772 | 0 |
| 1.773 | 0 |
| 1.774 | 0 |
| 1.775 | 0 |
| 1.776 | 0 |
| 1.777 | 0 |
| 1.778 | 0 |
| 1.779 | 0 |
| 1.78 | 0 |
| 1.781 | 0 |
| 1.782 | 0 |
| 1.783 | 0 |
| 1.784 | 0 |
| 1.785 | 0 |
| 1.786 | 0 |
| 1.787 | 0 |
| 1.788 | 0 |
| 1.789 | 0 |
| 1.79 | 0 |
| 1.791 | 0 |
| 1.792 | 0 |
| 1.793 | 0 |
| 1.794 | 0 |
| 1.795 | 0 |
| 1.796 | 0 |
| 1.797 | 0 |
| 1.798 | 0 |
| 1.799 | 0 |
| 1.8 | 0 |
| 1.801 | 0 |
| 1.802 | 0 |
| 1.803 | 0 |
| 1.804 | 0 |
| 1.805 | 0 |
| 1.806 | 0 |
| 1.807 | 0 |
| 1.808 | 0 |
| 1.809 | 0 |
| 1.81 | 0 |
| 1.811 | 0 |
| 1.812 | 0 |
| 1.813 | 0 |
| 1.814 | 0 |
| 1.815 | 0 |
| 1.816 | 0 |
| 1.817 | 0 |
| 1.818 | 0 |
| 1.819 | 0 |
| 1.82 | 0 |
| 1.821 | 0 |
| 1.822 | 0 |
| 1.823 | 0 |
| 1.824 | 0 |
| 1.825 | 0 |
| 1.826 | 0 |
| 1.827 | 0 |
| 1.828 | 0 |
| 1.829 | 0 |
| 1.83 | 0 |
| 1.831 | 0 |
| 1.832 | 0 |
| 1.833 | 0 |
| 1.834 | 0 |
| 1.835 | 0 |
| 1.836 | 0 |
| 1.837 | 0 |
| 1.838 | 0 |
| 1.839 | 0 |
| 1.84 | 0 |
| 1.841 | 0 |
| 1.842 | 0 |
| 1.843 | 0 |
| 1.844 | 0 |
| 1.845 | 0 |
| 1.846 | 0 |
| 1.847 | 0 |
| 1.848 | 0 |
| 1.849 | 0 |
| 1.85 | 0 |
| 1.851 | 0 |
| 1.852 | 0 |
| 1.853 | 0 |
| 1.854 | 0 |
| 1.855 | 0 |
| 1.856 | 0 |
| 1.857 | 0 |
| 1.858 | 0 |
| 1.859 | 0 |
| 1.86 | 0 |
| 1.861 | 0 |
| 1.862 | 0 |
| 1.863 | 0 |
| 1.864 | 0 |
| 1.865 | 0 |
| 1.866 | 0 |
| 1.867 | 0 |
| 1.868 | 0 |
| 1.869 | 0 |
| 1.87 | 0 |
| 1.871 | 0 |
| 1.872 | 0 |
| 1.873 | 0 |
| 1.874 | 0 |
| 1.875 | 0 |
| 1.876 | 0 |
| 1.877 | 0 |
| 1.878 | 0 |
| 1.879 | 0 |
| 1.88 | 0 |
| 1.881 | 0 |
| 1.882 | 0 |
| 1.883 | 0 |
| 1.884 | 0 |
| 1.885 | 0 |
| 1.886 | 0 |
| 1.887 | 0 |
| 1.888 | 0 |
| 1.889 | 0 |
| 1.89 | 0 |
| 1.891 | 0 |
| 1.892 | 0 |
| 1.893 | 0 |
| 1.894 | 0 |
| 1.895 | 0 |
| 1.896 | 0 |
| 1.897 | 0 |
| 1.898 | 0 |
| 1.899 | 0 |
| 1.9 | 0 |
| 1.901 | 0 |
| 1.902 | 0 |
| 1.903 | 0 |
| 1.904 | 0 |
| 1.905 | 0 |
| 1.906 | 0 |
| 1.907 | 0 |
| 1.908 | 0 |
| 1.909 | 0 |
| 1.91 | 0 |
| 1.911 | 0 |
| 1.912 | 0 |
| 1.913 | 0 |
| 1.914 | 0 |
| 1.915 | 0 |
| 1.916 | 0 |
| 1.917 | 0 |
| 1.918 | 0 |
| 1.919 | 0 |
| 1.92 | 0 |
| 1.921 | 0 |
| 1.922 | 0 |
| 1.923 | 0 |
| 1.924 | 0 |
| 1.925 | 0 |
| 1.926 | 0 |
| 1.927 | 0 |
| 1.928 | 0 |
| 1.929 | 0 |
| 1.93 | 0 |
| 1.931 | 0 |
| 1.932 | 0 |
| 1.933 | 0 |
| 1.934 | 0 |
| 1.935 | 0 |
| 1.936 | 0 |
| 1.937 | 0 |
| 1.938 | 0 |
| 1.939 | 0 |
| 1.94 | 0 |
| 1.941 | 0 |
| 1.942 | 0 |
| 1.943 | 0 |
| 1.944 | 0 |
| 1.945 | 0 |
| 1.946 | 0 |
| 1.947 | 0 |
| 1.948 | 0 |
| 1.949 | 0 |
| 1.95 | 0 |
| 1.951 | 0 |
| 1.952 | 0 |
| 1.953 | 0 |
| 1.954 | 0 |
| 1.955 | 0 |
| 1.956 | 0 |
| 1.957 | 0 |
| 1.958 | 0 |
| 1.959 | 0 |
| 1.96 | 0 |
| 1.961 | 0 |
| 1.962 | 0 |
| 1.963 | 0 |
| 1.964 | 0 |
| 1.965 | 0 |
| 1.966 | 0 |
| 1.967 | 0 |
| 1.968 | 0 |
| 1.969 | 0 |
| 1.97 | 0 |
| 1.971 | 0 |
| 1.972 | 0 |
| 1.973 | 0 |
| 1.974 | 0 |
| 1.975 | 0 |
| 1.976 | 0 |
| 1.977 | 0 |
| 1.978 | 0 |
| 1.979 | 0 |
| 1.98 | 0 |
| 1.981 | 0 |
| 1.982 | 0 |
| 1.983 | 0 |
| 1.984 | 0 |
| 1.985 | 0 |
| 1.986 | 0 |
| 1.987 | 0 |
| 1.988 | 0 |
| 1.989 | 0 |
| 1.99 | 0 |
| 1.991 | 0 |
| 1.992 | 0 |
| 1.993 | 0 |
| 1.994 | 0 |
| 1.995 | 0 |
| 1.996 | 0 |
| 1.997 | 0 |
| 1.998 | 0 |
| 1.999 | 0 |
| 2.0 | 0 |
| 2.001 | 0 |
| 2.002 | 0 |
| 2.003 | 0 |
| 2.004 | 0 |
| 2.005 | 0 |
| 2.006 | 0 |
| 2.007 | 0 |
| 2.008 | 0 |
| 2.009 | 0 |
| 2.01 | 0 |
| 2.011 | 0 |
| 2.012 | 0 |
| 2.013 | 0 |
| 2.014 | 0 |
| 2.015 | 0 |
| 2.016 | 0 |
| 2.017 | 0 |
| 2.018 | 0 |
| 2.019 | 0 |
| 2.02 | 0 |
| 2.021 | 0 |
| 2.022 | 0 |
| 2.023 | 0 |
| 2.024 | 0 |
| 2.025 | 0 |
| 2.026 | 0 |
| 2.027 | 0 |
| 2.028 | 0 |
| 2.029 | 0 |
| 2.03 | 0 |
| 2.031 | 0 |
| 2.032 | 0 |
| 2.033 | 0 |
| 2.034 | 0 |
| 2.035 | 0 |
| 2.036 | 0 |
| 2.037 | 0 |
| 2.038 | 0 |
| 2.039 | 0 |
| 2.04 | 0 |
| 2.041 | 0 |
| 2.042 | 0 |
| 2.043 | 0 |
| 2.044 | 0 |
| 2.045 | 0 |
| 2.046 | 0 |
| 2.047 | 0 |
| 2.048 | 0 |
| 2.049 | 0 |
| 2.05 | 0 |
| 2.051 | 0 |
| 2.052 | 0 |
| 2.053 | 0 |
| 2.054 | 0 |
| 2.055 | 0 |
| 2.056 | 0 |
| 2.057 | 0 |
| 2.058 | 0 |
| 2.059 | 0 |
| 2.06 | 0 |
| 2.061 | 0 |
| 2.062 | 0 |
| 2.063 | 0 |
| 2.064 | 0 |
| 2.065 | 0 |
| 2.066 | 0 |
| 2.067 | 0 |
| 2.068 | 0 |
| 2.069 | 0 |
| 2.07 | 0 |
| 2.071 | 0 |
| 2.072 | 0 |
| 2.073 | 0 |
| 2.074 | 0 |
| 2.075 | 0 |
| 2.076 | 0 |
| 2.077 | 0 |
| 2.078 | 0 |
| 2.079 | 0 |
| 2.08 | 0 |
| 2.081 | 0 |
| 2.082 | 0 |
| 2.083 | 0 |
| 2.084 | 0 |
| 2.085 | 0 |
| 2.086 | 0 |
| 2.087 | 0 |
| 2.088 | 0 |
| 2.089 | 0 |
| 2.09 | 0 |
| 2.091 | 0 |
| 2.092 | 0 |
| 2.093 | 0 |
| 2.094 | 0 |
| 2.095 | 0 |
| 2.096 | 0 |
| 2.097 | 0 |
| 2.098 | 0 |
| 2.099 | 0 |
| 2.1 | 0 |
| 2.101 | 0 |
| 2.102 | 0 |
| 2.103 | 0 |
| 2.104 | 0 |
| 2.105 | 0 |
| 2.106 | 0 |
| 2.107 | 0 |
| 2.108 | 0 |
| 2.109 | 0 |
| 2.11 | 0 |
| 2.111 | 0 |
| 2.112 | 0 |
| 2.113 | 0 |
| 2.114 | 0 |
| 2.115 | 0 |
| 2.116 | 0 |
| 2.117 | 0 |
| 2.118 | 0 |
| 2.119 | 0 |
| 2.12 | 0 |
| 2.121 | 0 |
| 2.122 | 0 |
| 2.123 | 0 |
| 2.124 | 0 |
| 2.125 | 0 |
| 2.126 | 0 |
| 2.127 | 0 |
| 2.128 | 0 |
| 2.129 | 0 |
| 2.13 | 0 |
| 2.131 | 0 |
| 2.132 | 0 |
| 2.133 | 0 |
| 2.134 | 0 |
| 2.135 | 0 |
| 2.136 | 0 |
| 2.137 | 0 |
| 2.138 | 0 |
| 2.139 | 0 |
| 2.14 | 0 |
| 2.141 | 0 |
| 2.142 | 0 |
| 2.143 | 0 |
| 2.144 | 0 |
| 2.145 | 0 |
| 2.146 | 0 |
| 2.147 | 0 |
| 2.148 | 0 |
| 2.149 | 0 |
| 2.15 | 0 |
| 2.151 | 0 |
| 2.152 | 0 |
| 2.153 | 0 |
| 2.154 | 0 |
| 2.155 | 0 |
| 2.156 | 0 |
| 2.157 | 0 |
| 2.158 | 0 |
| 2.159 | 0 |
| 2.16 | 0 |
| 2.161 | 0 |
| 2.162 | 0 |
| 2.163 | 0 |
| 2.164 | 0 |
| 2.165 | 0 |
| 2.166 | 0 |
| 2.167 | 0 |
| 2.168 | 0 |
| 2.169 | 0 |
| 2.17 | 0 |
| 2.171 | 0 |
| 2.172 | 0 |
| 2.173 | 0 |
| 2.174 | 0 |
| 2.175 | 0 |
| 2.176 | 0 |
| 2.177 | 0 |
| 2.178 | 0 |
| 2.179 | 0 |
| 2.18 | 0 |
| 2.181 | 0 |
| 2.182 | 0 |
| 2.183 | 0 |
| 2.184 | 0 |
| 2.185 | 0 |
| 2.186 | 0 |
| 2.187 | 0 |
| 2.188 | 0 |
| 2.189 | 0 |
| 2.19 | 0 |
| 2.191 | 0 |
| 2.192 | 0 |
| 2.193 | 0 |
| 2.194 | 0 |
| 2.195 | 0 |
| 2.196 | 0 |
| 2.197 | 0 |
| 2.198 | 0 |
| 2.199 | 0 |
| 2.2 | 0 |
| 2.201 | 0 |
| 2.202 | 0 |
| 2.203 | 0 |
| 2.204 | 0 |
| 2.205 | 0 |
| 2.206 | 0 |
| 2.207 | 0 |
| 2.208 | 0 |
| 2.209 | 0 |
| 2.21 | 0 |
| 2.211 | 0 |
| 2.212 | 0 |
| 2.213 | 0 |
| 2.214 | 0 |
| 2.215 | 0 |
| 2.216 | 0 |
| 2.217 | 0 |
| 2.218 | 0 |
| 2.219 | 0 |
| 2.22 | 0 |
| 2.221 | 0 |
| 2.222 | 0 |
| 2.223 | 0 |
| 2.224 | 0 |
| 2.225 | 0 |
| 2.226 | 0 |
| 2.227 | 0 |
| 2.228 | 0 |
| 2.229 | 0 |
| 2.23 | 0 |
| 2.231 | 0 |
| 2.232 | 0 |
| 2.233 | 0 |
| 2.234 | 0 |
| 2.235 | 0 |
| 2.236 | 0 |
| 2.237 | 0 |
| 2.238 | 0 |
| 2.239 | 0 |
| 2.24 | 0 |
| 2.241 | 0 |
| 2.242 | 0 |
| 2.243 | 0 |
| 2.244 | 0 |
| 2.245 | 0 |
| 2.246 | 0 |
| 2.247 | 0 |
| 2.248 | 0 |
| 2.249 | 0 |
| 2.25 | 0 |
| 2.251 | 0 |
| 2.252 | 0 |
| 2.253 | 0 |
| 2.254 | 0 |
| 2.255 | 0 |
| 2.256 | 0 |
| 2.257 | 0 |
| 2.258 | 0 |
| 2.259 | 0 |
| 2.26 | 0 |
| 2.261 | 0 |
| 2.262 | 0 |
| 2.263 | 0 |
| 2.264 | 0 |
| 2.265 | 0 |
| 2.266 | 0 |
| 2.267 | 0 |
| 2.268 | 0 |
| 2.269 | 0 |
| 2.27 | 0 |
| 2.271 | 0 |
| 2.272 | 0 |
| 2.273 | 0 |
| 2.274 | 0 |
| 2.275 | 0 |
| 2.276 | 0 |
| 2.277 | 0 |
| 2.278 | 0 |
| 2.279 | 0 |
| 2.28 | 0 |
| 2.281 | 0 |
| 2.282 | 0 |
| 2.283 | 0 |
| 2.284 | 0 |
| 2.285 | 0 |
| 2.286 | 0 |
| 2.287 | 0 |
| 2.288 | 0 |
| 2.289 | 0 |
| 2.29 | 0 |
| 2.291 | 0 |
| 2.292 | 0 |
| 2.293 | 0 |
| 2.294 | 0 |
| 2.295 | 0 |
| 2.296 | 0 |
| 2.297 | 0 |
| 2.298 | 0 |
| 2.299 | 0 |
| 2.3 | 0 |
| 2.301 | 0 |
| 2.302 | 0 |
| 2.303 | 0 |
| 2.304 | 0 |
| 2.305 | 0 |
| 2.306 | 0 |
| 2.307 | 0 |
| 2.308 | 0 |
| 2.309 | 0 |
| 2.31 | 0 |
| 2.311 | 0 |
| 2.312 | 0 |
| 2.313 | 0 |
| 2.314 | 0 |
| 2.315 | 0 |
| 2.316 | 0 |
| 2.317 | 0 |
| 2.318 | 0 |
| 2.319 | 0 |
| 2.32 | 0 |
| 2.321 | 0 |
| 2.322 | 0 |
| 2.323 | 0 |
| 2.324 | 0 |
| 2.325 | 0 |
| 2.326 | 0 |
| 2.327 | 0 |
| 2.328 | 0 |
| 2.329 | 0 |
| 2.33 | 0 |
| 2.331 | 0 |
| 2.332 | 0 |
| 2.333 | 0 |
| 2.334 | 0 |
| 2.335 | 0 |
| 2.336 | 0 |
| 2.337 | 0 |
| 2.338 | 0 |
| 2.339 | 0 |
| 2.34 | 0 |
| 2.341 | 0 |
| 2.342 | 0 |
| 2.343 | 0 |
| 2.344 | 0 |
| 2.345 | 0 |
| 2.346 | 0 |
| 2.347 | 0 |
| 2.348 | 0 |
| 2.349 | 0 |
| 2.35 | 0 |
| 2.351 | 0 |
| 2.352 | 0 |
| 2.353 | 0 |
| 2.354 | 0 |
| 2.355 | 0 |
| 2.356 | 0 |
| 2.357 | 0 |
| 2.358 | 0 |
| 2.359 | 0 |
| 2.36 | 0 |
| 2.361 | 0 |
| 2.362 | 0 |
| 2.363 | 0 |
| 2.364 | 0 |
| 2.365 | 0 |
| 2.366 | 0 |
| 2.367 | 0 |
| 2.368 | 0 |
| 2.369 | 0 |
| 2.37 | 0 |
| 2.371 | 0 |
| 2.372 | 0 |
| 2.373 | 0 |
| 2.374 | 0 |
| 2.375 | 0 |
| 2.376 | 0 |
| 2.377 | 0 |
| 2.378 | 0 |
| 2.379 | 0 |
| 2.38 | 0 |
| 2.381 | 0 |
| 2.382 | 0 |
| 2.383 | 0 |
| 2.384 | 0 |
| 2.385 | 0 |
| 2.386 | 0 |
| 2.387 | 0 |
| 2.388 | 0 |
| 2.389 | 0 |
| 2.39 | 0 |
| 2.391 | 0 |
| 2.392 | 0 |
| 2.393 | 0 |
| 2.394 | 0 |
| 2.395 | 0 |
| 2.396 | 0 |
| 2.397 | 0 |
| 2.398 | 0 |
| 2.399 | 0 |
| 2.4 | 0 |
| 2.401 | 0 |
| 2.402 | 0 |
| 2.403 | 0 |
| 2.404 | 0 |
| 2.405 | 0 |
| 2.406 | 0 |
| 2.407 | 0 |
| 2.408 | 0 |
| 2.409 | 0 |
| 2.41 | 0 |
| 2.411 | 0 |
| 2.412 | 0 |
| 2.413 | 0 |
| 2.414 | 0 |
| 2.415 | 0 |
| 2.416 | 0 |
| 2.417 | 0 |
| 2.418 | 0 |
| 2.419 | 0 |
| 2.42 | 0 |
| 2.421 | 0 |
| 2.422 | 0 |
| 2.423 | 0 |
| 2.424 | 0 |
| 2.425 | 0 |
| 2.426 | 0 |
| 2.427 | 0 |
| 2.428 | 0 |
| 2.429 | 0 |
| 2.43 | 0 |
| 2.431 | 0 |
| 2.432 | 0 |
| 2.433 | 0 |
| 2.434 | 0 |
| 2.435 | 0 |
| 2.436 | 0 |
| 2.437 | 0 |
| 2.438 | 0 |
| 2.439 | 0 |
| 2.44 | 0 |
| 2.441 | 0 |
| 2.442 | 0 |
| 2.443 | 0 |
| 2.444 | 0 |
| 2.445 | 0 |
| 2.446 | 0 |
| 2.447 | 0 |
| 2.448 | 0 |
| 2.449 | 0 |
| 2.45 | 0 |
| 2.451 | 0 |
| 2.452 | 0 |
| 2.453 | 0 |
| 2.454 | 0 |
| 2.455 | 0 |
| 2.456 | 0 |
| 2.457 | 0 |
| 2.458 | 0 |
| 2.459 | 0 |
| 2.46 | 0 |
| 2.461 | 0 |
| 2.462 | 0 |
| 2.463 | 0 |
| 2.464 | 0 |
| 2.465 | 0 |
| 2.466 | 0 |
| 2.467 | 0 |
| 2.468 | 0 |
| 2.469 | 0 |
| 2.47 | 0 |
| 2.471 | 0 |
| 2.472 | 0 |
| 2.473 | 0 |
| 2.474 | 0 |
| 2.475 | 0 |
| 2.476 | 0 |
| 2.477 | 0 |
| 2.478 | 0 |
| 2.479 | 0 |
| 2.48 | 0 |
| 2.481 | 0 |
| 2.482 | 0 |
| 2.483 | 0 |
| 2.484 | 0 |
| 2.485 | 0 |
| 2.486 | 0 |
| 2.487 | 0 |
| 2.488 | 0 |
| 2.489 | 0 |
| 2.49 | 0 |
| 2.491 | 0 |
| 2.492 | 0 |
| 2.493 | 0 |
| 2.494 | 0 |
| 2.495 | 0 |
| 2.496 | 0 |
| 2.497 | 0 |
| 2.498 | 0 |
| 2.499 | 0 |
| 2.5 | 0 |
| 2.501 | 0 |
| 2.502 | 0 |
| 2.503 | 0 |
| 2.504 | 0 |
| 2.505 | 0 |
| 2.506 | 0 |
| 2.507 | 0 |
| 2.508 | 0 |
| 2.509 | 0 |
| 2.51 | 0 |
| 2.511 | 0 |
| 2.512 | 0 |
| 2.513 | 0 |
| 2.514 | 0 |
| 2.515 | 0 |
| 2.516 | 0 |
| 2.517 | 0 |
| 2.518 | 0 |
| 2.519 | 0 |
| 2.52 | 0 |
| 2.521 | 0 |
| 2.522 | 0 |
| 2.523 | 0 |
| 2.524 | 0 |
| 2.525 | 0 |
| 2.526 | 0 |
| 2.527 | 0 |
| 2.528 | 0 |
| 2.529 | 0 |
| 2.53 | 0 |
| 2.531 | 0 |
| 2.532 | 0 |
| 2.533 | 0 |
| 2.534 | 0 |
| 2.535 | 0 |
| 2.536 | 0 |
| 2.537 | 0 |
| 2.538 | 0 |
| 2.539 | 0 |
| 2.54 | 0 |
| 2.541 | 0 |
| 2.542 | 0 |
| 2.543 | 0 |
| 2.544 | 0 |
| 2.545 | 0 |
| 2.546 | 0 |
| 2.547 | 0 |
| 2.548 | 0 |
| 2.549 | 0 |
| 2.55 | 0 |
| 2.551 | 0 |
| 2.552 | 0 |
| 2.553 | 0 |
| 2.554 | 0 |
| 2.555 | 0 |
| 2.556 | 0 |
| 2.557 | 0 |
| 2.558 | 0 |
| 2.559 | 0 |
| 2.56 | 0 |
| 2.561 | 0 |
| 2.562 | 0 |
| 2.563 | 0 |
| 2.564 | 0 |
| 2.565 | 0 |
| 2.566 | 0 |
| 2.567 | 0 |
| 2.568 | 0 |
| 2.569 | 0 |
| 2.57 | 0 |
| 2.571 | 0 |
| 2.572 | 0 |
| 2.573 | 0 |
| 2.574 | 0 |
| 2.575 | 0 |
| 2.576 | 0 |
| 2.577 | 0 |
| 2.578 | 0 |
| 2.579 | 0 |
| 2.58 | 0 |
| 2.581 | 0 |
| 2.582 | 0 |
| 2.583 | 0 |
| 2.584 | 0 |
| 2.585 | 0 |
| 2.586 | 0 |
| 2.587 | 0 |
| 2.588 | 0 |
| 2.589 | 0 |
| 2.59 | 0 |
| 2.591 | 0 |
| 2.592 | 0 |
| 2.593 | 0 |
| 2.594 | 0 |
| 2.595 | 0 |
| 2.596 | 0 |
| 2.597 | 0 |
| 2.598 | 0 |
| 2.599 | 0 |
| 2.6 | 0 |
| 2.601 | 0 |
| 2.602 | 0 |
| 2.603 | 0 |
| 2.604 | 0 |
| 2.605 | 0 |
| 2.606 | 0 |
| 2.607 | 0 |
| 2.608 | 0 |
| 2.609 | 0 |
| 2.61 | 0 |
| 2.611 | 0 |
| 2.612 | 0 |
| 2.613 | 0 |
| 2.614 | 0 |
| 2.615 | 0 |
| 2.616 | 0 |
| 2.617 | 0 |
| 2.618 | 0 |
| 2.619 | 0 |
| 2.62 | 0 |
| 2.621 | 0 |
| 2.622 | 0 |
| 2.623 | 0 |
| 2.624 | 0 |
| 2.625 | 0 |
| 2.626 | 0 |
| 2.627 | 0 |
| 2.628 | 0 |
| 2.629 | 0 |
| 2.63 | 0 |
| 2.631 | 0 |
| 2.632 | 0 |
| 2.633 | 0 |
| 2.634 | 0 |
| 2.635 | 0 |
| 2.636 | 0 |
| 2.637 | 0 |
| 2.638 | 0 |
| 2.639 | 0 |
| 2.64 | 0 |
| 2.641 | 0 |
| 2.642 | 0 |
| 2.643 | 0 |
| 2.644 | 0 |
| 2.645 | 0 |
| 2.646 | 0 |
| 2.647 | 0 |
| 2.648 | 0 |
| 2.649 | 0 |
| 2.65 | 0 |
| 2.651 | 0 |
| 2.652 | 0 |
| 2.653 | 0 |
| 2.654 | 0 |
| 2.655 | 0 |
| 2.656 | 0 |
| 2.657 | 0 |
| 2.658 | 0 |
| 2.659 | 0 |
| 2.66 | 0 |
| 2.661 | 0 |
| 2.662 | 0 |
| 2.663 | 0 |
| 2.664 | 0 |
| 2.665 | 0 |
| 2.666 | 0 |
| 2.667 | 0 |
| 2.668 | 0 |
| 2.669 | 0 |
| 2.67 | 0 |
| 2.671 | 0 |
| 2.672 | 0 |
| 2.673 | 0 |
| 2.674 | 0 |
| 2.675 | 0 |
| 2.676 | 0 |
| 2.677 | 0 |
| 2.678 | 0 |
| 2.679 | 0 |
| 2.68 | 0 |
| 2.681 | 0 |
| 2.682 | 0 |
| 2.683 | 0 |
| 2.684 | 0 |
| 2.685 | 0 |
| 2.686 | 0 |
| 2.687 | 0 |
| 2.688 | 0 |
| 2.689 | 0 |
| 2.69 | 0 |
| 2.691 | 0 |
| 2.692 | 0 |
| 2.693 | 0 |
| 2.694 | 0 |
| 2.695 | 0 |
| 2.696 | 0 |
| 2.697 | 0 |
| 2.698 | 0 |
| 2.699 | 0 |
| 2.7 | 0 |
| 2.701 | 0 |
| 2.702 | 0 |
| 2.703 | 0 |
| 2.704 | 0 |
| 2.705 | 0 |
| 2.706 | 0 |
| 2.707 | 0 |
| 2.708 | 0 |
| 2.709 | 0 |
| 2.71 | 0 |
| 2.711 | 0 |
| 2.712 | 0 |
| 2.713 | 0 |
| 2.714 | 0 |
| 2.715 | 0 |
| 2.716 | 0 |
| 2.717 | 0 |
| 2.718 | 0 |
| 2.719 | 0 |
| 2.72 | 0 |
| 2.721 | 0 |
| 2.722 | 0 |
| 2.723 | 0 |
| 2.724 | 0 |
| 2.725 | 0 |
| 2.726 | 0 |
| 2.727 | 0 |
| 2.728 | 0 |
| 2.729 | 0 |
| 2.73 | 0 |
| 2.731 | 0 |
| 2.732 | 0 |
| 2.733 | 0 |
| 2.734 | 0 |
| 2.735 | 0 |
| 2.736 | 0 |
| 2.737 | 0 |
| 2.738 | 0 |
| 2.739 | 0 |
| 2.74 | 0 |
| 2.741 | 0 |
| 2.742 | 0 |
| 2.743 | 0 |
| 2.744 | 0 |
| 2.745 | 0 |
| 2.746 | 0 |
| 2.747 | 0 |
| 2.748 | 0 |
| 2.749 | 0 |
| 2.75 | 0 |
| 2.751 | 0 |
| 2.752 | 0 |
| 2.753 | 0 |
| 2.754 | 0 |
| 2.755 | 0 |
| 2.756 | 0 |
| 2.757 | 0 |
| 2.758 | 0 |
| 2.759 | 0 |
| 2.76 | 0 |
| 2.761 | 0 |
| 2.762 | 0 |
| 2.763 | 0 |
| 2.764 | 0 |
| 2.765 | 0 |
| 2.766 | 0 |
| 2.767 | 0 |
| 2.768 | 0 |
| 2.769 | 0 |
| 2.77 | 0 |
| 2.771 | 0 |
| 2.772 | 0 |
| 2.773 | 0 |
| 2.774 | 0 |
| 2.775 | 0 |
| 2.776 | 0 |
| 2.777 | 0 |
| 2.778 | 0 |
| 2.779 | 0 |
| 2.78 | 0 |
| 2.781 | 0 |
| 2.782 | 0 |
| 2.783 | 0 |
| 2.784 | 0 |
| 2.785 | 0 |
| 2.786 | 0 |
| 2.787 | 0 |
| 2.788 | 0 |
| 2.789 | 0 |
| 2.79 | 0 |
| 2.791 | 0 |
| 2.792 | 0 |
| 2.793 | 0 |
| 2.794 | 0 |
| 2.795 | 0 |
| 2.796 | 0 |
| 2.797 | 0 |
| 2.798 | 0 |
| 2.799 | 0 |
| 2.8 | 0 |
| 2.801 | 0 |
| 2.802 | 0 |
| 2.803 | 0 |
| 2.804 | 0 |
| 2.805 | 0 |
| 2.806 | 0 |
| 2.807 | 0 |
| 2.808 | 0 |
| 2.809 | 0 |
| 2.81 | 0 |
| 2.811 | 0 |
| 2.812 | 0 |
| 2.813 | 0 |
| 2.814 | 0 |
| 2.815 | 0 |
| 2.816 | 0 |
| 2.817 | 0 |
| 2.818 | 0 |
| 2.819 | 0 |
| 2.82 | 0 |
| 2.821 | 0 |
| 2.822 | 0 |
| 2.823 | 0 |
| 2.824 | 0 |
| 2.825 | 0 |
| 2.826 | 0 |
| 2.827 | 0 |
| 2.828 | 0 |
| 2.829 | 0 |
| 2.83 | 0 |
| 2.831 | 0 |
| 2.832 | 0 |
| 2.833 | 0 |
| 2.834 | 0 |
| 2.835 | 0 |
| 2.836 | 0 |
| 2.837 | 0 |
| 2.838 | 0 |
| 2.839 | 0 |
| 2.84 | 0 |
| 2.841 | 0 |
| 2.842 | 0 |
| 2.843 | 0 |
| 2.844 | 0 |
| 2.845 | 0 |
| 2.846 | 0 |
| 2.847 | 0 |
| 2.848 | 0 |
| 2.849 | 0 |
| 2.85 | 0 |
| 2.851 | 0 |
| 2.852 | 0 |
| 2.853 | 0 |
| 2.854 | 0 |
| 2.855 | 0 |
| 2.856 | 0 |
| 2.857 | 0 |
| 2.858 | 0 |
| 2.859 | 0 |
| 2.86 | 0 |
| 2.861 | 0 |
| 2.862 | 0 |
| 2.863 | 0 |
| 2.864 | 0 |
| 2.865 | 0 |
| 2.866 | 0 |
| 2.867 | 0 |
| 2.868 | 0 |
| 2.869 | 0 |
| 2.87 | 0 |
| 2.871 | 0 |
| 2.872 | 0 |
| 2.873 | 0 |
| 2.874 | 0 |
| 2.875 | 0 |
| 2.876 | 0 |
| 2.877 | 0 |
| 2.878 | 0 |
| 2.879 | 0 |
| 2.88 | 0 |
| 2.881 | 0 |
| 2.882 | 0 |
| 2.883 | 0 |
| 2.884 | 0 |
| 2.885 | 0 |
| 2.886 | 0 |
| 2.887 | 0 |
| 2.888 | 0 |
| 2.889 | 0 |
| 2.89 | 0 |
| 2.891 | 0 |
| 2.892 | 0 |
| 2.893 | 0 |
| 2.894 | 0 |
| 2.895 | 0 |
| 2.896 | 0 |
| 2.897 | 0 |
| 2.898 | 0 |
| 2.899 | 0 |
| 2.9 | 0 |
| 2.901 | 0 |
| 2.902 | 0 |
| 2.903 | 0 |
| 2.904 | 0 |
| 2.905 | 0 |
| 2.906 | 0 |
| 2.907 | 0 |
| 2.908 | 0 |
| 2.909 | 0 |
| 2.91 | 0 |
| 2.911 | 0 |
| 2.912 | 0 |
| 2.913 | 0 |
| 2.914 | 0 |
| 2.915 | 0 |
| 2.916 | 0 |
| 2.917 | 0 |
| 2.918 | 0 |
| 2.919 | 0 |
| 2.92 | 0 |
| 2.921 | 0 |
| 2.922 | 0 |
| 2.923 | 0 |
| 2.924 | 0 |
| 2.925 | 0 |
| 2.926 | 0 |
| 2.927 | 0 |
| 2.928 | 0 |
| 2.929 | 0 |
| 2.93 | 0 |
| 2.931 | 0 |
| 2.932 | 0 |
| 2.933 | 0 |
| 2.934 | 0 |
| 2.935 | 0 |
| 2.936 | 0 |
| 2.937 | 0 |
| 2.938 | 0 |
| 2.939 | 0 |
| 2.94 | 0 |
| 2.941 | 0 |
| 2.942 | 0 |
| 2.943 | 0 |
| 2.944 | 0 |
| 2.945 | 0 |
| 2.946 | 0 |
| 2.947 | 0 |
| 2.948 | 0 |
| 2.949 | 0 |
| 2.95 | 0 |
| 2.951 | 0 |
| 2.952 | 0 |
| 2.953 | 0 |
| 2.954 | 0 |
| 2.955 | 0 |
| 2.956 | 0 |
| 2.957 | 0 |
| 2.958 | 0 |
| 2.959 | 0 |
| 2.96 | 0 |
| 2.961 | 0 |
| 2.962 | 0 |
| 2.963 | 0 |
| 2.964 | 0 |
| 2.965 | 0 |
| 2.966 | 0 |
| 2.967 | 0 |
| 2.968 | 0 |
| 2.969 | 0 |
| 2.97 | 0 |
| 2.971 | 0 |
| 2.972 | 0 |
| 2.973 | 0 |
| 2.974 | 0 |
| 2.975 | 0 |
| 2.976 | 0 |
| 2.977 | 0 |
| 2.978 | 0 |
| 2.979 | 0 |
| 2.98 | 0 |
| 2.981 | 0 |
| 2.982 | 0 |
| 2.983 | 0 |
| 2.984 | 0 |
| 2.985 | 0 |
| 2.986 | 0 |
| 2.987 | 0 |
| 2.988 | 0 |
| 2.989 | 0 |
| 2.99 | 0 |
| 2.991 | 0 |
| 2.992 | 0 |
| 2.993 | 0 |
| 2.994 | 0 |
| 2.995 | 0 |
| 2.996 | 0 |
| 2.997 | 0 |
| 2.998 | 0 |
| 2.999 | 0 |
| 3.0 | 0 |
| 3.001 | 0 |
| 3.002 | 0 |
| 3.003 | 0 |
| 3.004 | 0 |
| 3.005 | 0 |
| 3.006 | 0 |
| 3.007 | 0 |
| 3.008 | 0 |
| 3.009 | 0 |
| 3.01 | 0 |
| 3.011 | 0 |
| 3.012 | 0 |
| 3.013 | 0 |
| 3.014 | 0 |
| 3.015 | 0 |
| 3.016 | 0 |
| 3.017 | 0 |
| 3.018 | 0 |
| 3.019 | 0 |
| 3.02 | 0 |
| 3.021 | 0 |
| 3.022 | 0 |
| 3.023 | 0 |
| 3.024 | 0 |
| 3.025 | 0 |
| 3.026 | 0 |
| 3.027 | 0 |
| 3.028 | 0 |
| 3.029 | 0 |
| 3.03 | 0 |
| 3.031 | 0 |
| 3.032 | 0 |
| 3.033 | 0 |
| 3.034 | 0 |
| 3.035 | 0 |
| 3.036 | 0 |
| 3.037 | 0 |
| 3.038 | 0 |
| 3.039 | 0 |
| 3.04 | 0 |
| 3.041 | 0 |
| 3.042 | 0 |
| 3.043 | 0 |
| 3.044 | 0 |
| 3.045 | 0 |
| 3.046 | 0 |
| 3.047 | 0 |
| 3.048 | 0 |
| 3.049 | 0 |
| 3.05 | 0 |
| 3.051 | 0 |
| 3.052 | 0 |
| 3.053 | 0 |
| 3.054 | 0 |
| 3.055 | 0 |
| 3.056 | 0 |
| 3.057 | 0 |
| 3.058 | 0 |
| 3.059 | 0 |
| 3.06 | 0 |
| 3.061 | 0 |
| 3.062 | 0 |
| 3.063 | 0 |
| 3.064 | 0 |
| 3.065 | 0 |
| 3.066 | 0 |
| 3.067 | 0 |
| 3.068 | 0 |
| 3.069 | 0 |
| 3.07 | 0 |
| 3.071 | 0 |
| 3.072 | 0 |
| 3.073 | 0 |
| 3.074 | 0 |
| 3.075 | 0 |
| 3.076 | 0 |
| 3.077 | 0 |
| 3.078 | 0 |
| 3.079 | 0 |
| 3.08 | 0 |
| 3.081 | 0 |
| 3.082 | 0 |
| 3.083 | 0 |
| 3.084 | 0 |
| 3.085 | 0 |
| 3.086 | 0 |
| 3.087 | 0 |
| 3.088 | 0 |
| 3.089 | 0 |
| 3.09 | 0 |
| 3.091 | 0 |
| 3.092 | 0 |
| 3.093 | 0 |
| 3.094 | 0 |
| 3.095 | 0 |
| 3.096 | 0 |
| 3.097 | 0 |
| 3.098 | 0 |
| 3.099 | 0 |
| 3.1 | 0 |
| 3.101 | 0 |
| 3.102 | 0 |
| 3.103 | 0 |
| 3.104 | 0 |
| 3.105 | 0 |
| 3.106 | 0 |
| 3.107 | 0 |
| 3.108 | 0 |
| 3.109 | 0 |
| 3.11 | 0 |
| 3.111 | 0 |
| 3.112 | 0 |
| 3.113 | 0 |
| 3.114 | 0 |
| 3.115 | 0 |
| 3.116 | 0 |
| 3.117 | 0 |
| 3.118 | 0 |
| 3.119 | 0 |
| 3.12 | 0 |
| 3.121 | 0 |
| 3.122 | 0 |
| 3.123 | 0 |
| 3.124 | 0 |
| 3.125 | 0 |
| 3.126 | 0 |
| 3.127 | 0 |
| 3.128 | 0 |
| 3.129 | 0 |
| 3.13 | 0 |
| 3.131 | 0 |
| 3.132 | 0 |
| 3.133 | 0 |
| 3.134 | 0 |
| 3.135 | 0 |
| 3.136 | 0 |
| 3.137 | 0 |
| 3.138 | 0 |
| 3.139 | 0 |
| 3.14 | 0 |
| 3.141 | 0 |
| 3.142 | 0 |
| 3.143 | 0 |
| 3.144 | 0 |
| 3.145 | 0 |
| 3.146 | 0 |
| 3.147 | 0 |
| 3.148 | 0 |
| 3.149 | 0 |
| 3.15 | 0 |
| 3.151 | 0 |
| 3.152 | 0 |
| 3.153 | 0 |
| 3.154 | 0 |
| 3.155 | 0 |
| 3.156 | 0 |
| 3.157 | 0 |
| 3.158 | 0 |
| 3.159 | 0 |
| 3.16 | 0 |
| 3.161 | 0 |
| 3.162 | 0 |
| 3.163 | 0 |
| 3.164 | 0 |
| 3.165 | 0 |
| 3.166 | 0 |
| 3.167 | 0 |
| 3.168 | 0 |
| 3.169 | 0 |
| 3.17 | 0 |
| 3.171 | 0 |
| 3.172 | 0 |
| 3.173 | 0 |
| 3.174 | 0 |
| 3.175 | 0 |
| 3.176 | 0 |
| 3.177 | 0 |
| 3.178 | 0 |
| 3.179 | 0 |
| 3.18 | 0 |
| 3.181 | 0 |
| 3.182 | 0 |
| 3.183 | 0 |
| 3.184 | 0 |
| 3.185 | 0 |
| 3.186 | 0 |
| 3.187 | 0 |
| 3.188 | 0 |
| 3.189 | 0 |
| 3.19 | 0 |
| 3.191 | 0 |
| 3.192 | 0 |
| 3.193 | 0 |
| 3.194 | 0 |
| 3.195 | 0 |
| 3.196 | 0 |
| 3.197 | 0 |
| 3.198 | 0 |
| 3.199 | 0 |
| 3.2 | 0 |
| 3.201 | 0 |
| 3.202 | 0 |
| 3.203 | 0 |
| 3.204 | 0 |
| 3.205 | 0 |
| 3.206 | 0 |
| 3.207 | 0 |
| 3.208 | 0 |
| 3.209 | 0 |
| 3.21 | 0 |
| 3.211 | 0 |
| 3.212 | 0 |
| 3.213 | 0 |
| 3.214 | 0 |
| 3.215 | 0 |
| 3.216 | 0 |
| 3.217 | 0 |
| 3.218 | 0 |
| 3.219 | 0 |
| 3.22 | 0 |
| 3.221 | 0 |
| 3.222 | 0 |
| 3.223 | 0 |
| 3.224 | 0 |
| 3.225 | 0 |
| 3.226 | 0 |
| 3.227 | 0 |
| 3.228 | 0 |
| 3.229 | 0 |
| 3.23 | 0 |
| 3.231 | 0 |
| 3.232 | 0 |
| 3.233 | 0 |
| 3.234 | 0 |
| 3.235 | 0 |
| 3.236 | 0 |
| 3.237 | 0 |
| 3.238 | 0 |
| 3.239 | 0 |
| 3.24 | 0 |
| 3.241 | 0 |
| 3.242 | 0 |
| 3.243 | 0 |
| 3.244 | 0 |
| 3.245 | 0 |
| 3.246 | 0 |
| 3.247 | 0 |
| 3.248 | 0 |
| 3.249 | 0 |
| 3.25 | 0 |
| 3.251 | 0 |
| 3.252 | 0 |
| 3.253 | 0 |
| 3.254 | 0 |
| 3.255 | 0 |
| 3.256 | 0 |
| 3.257 | 0 |
| 3.258 | 0 |
| 3.259 | 0 |
| 3.26 | 0 |
| 3.261 | 0 |
| 3.262 | 0 |
| 3.263 | 0 |
| 3.264 | 0 |
| 3.265 | 0 |
| 3.266 | 0 |
| 3.267 | 0 |
| 3.268 | 0 |
| 3.269 | 0 |
| 3.27 | 0 |
| 3.271 | 0 |
| 3.272 | 0 |
| 3.273 | 0 |
| 3.274 | 0 |
| 3.275 | 0 |
| 3.276 | 0 |
| 3.277 | 0 |
| 3.278 | 0 |
| 3.279 | 0 |
| 3.28 | 0 |
| 3.281 | 0 |
| 3.282 | 0 |
| 3.283 | 0 |
| 3.284 | 0 |
| 3.285 | 0 |
| 3.286 | 0 |
| 3.287 | 0 |
| 3.288 | 0 |
| 3.289 | 0 |
| 3.29 | 0 |
| 3.291 | 0 |
| 3.292 | 0 |
| 3.293 | 0 |
| 3.294 | 0 |
| 3.295 | 0 |
| 3.296 | 0 |
| 3.297 | 0 |
| 3.298 | 0 |
| 3.299 | 0 |
| 3.3 | 0 |
| 3.301 | 0 |
| 3.302 | 0 |
| 3.303 | 0 |
| 3.304 | 0 |
| 3.305 | 0 |
| 3.306 | 0 |
| 3.307 | 0 |
| 3.308 | 0 |
| 3.309 | 0 |
| 3.31 | 0 |
| 3.311 | 0 |
| 3.312 | 0 |
| 3.313 | 0 |
| 3.314 | 0 |
| 3.315 | 0 |
| 3.316 | 0 |
| 3.317 | 0 |
| 3.318 | 0 |
| 3.319 | 0 |
| 3.32 | 0 |
| 3.321 | 0 |
| 3.322 | 0 |
| 3.323 | 0 |
| 3.324 | 0 |
| 3.325 | 0 |
| 3.326 | 0 |
| 3.327 | 0 |
| 3.328 | 0 |
| 3.329 | 0 |
| 3.33 | 0 |
| 3.331 | 0 |
| 3.332 | 0 |
| 3.333 | 0 |
| 3.334 | 0 |
| 3.335 | 0 |
| 3.336 | 0 |
| 3.337 | 0 |
| 3.338 | 0 |
| 3.339 | 0 |
| 3.34 | 0 |
| 3.341 | 0 |
| 3.342 | 0 |
| 3.343 | 0 |
| 3.344 | 0 |
| 3.345 | 0 |
| 3.346 | 0 |
| 3.347 | 0 |
| 3.348 | 0 |
| 3.349 | 0 |
| 3.35 | 0 |
| 3.351 | 0 |
| 3.352 | 0 |
| 3.353 | 0 |
| 3.354 | 0 |
| 3.355 | 0 |
| 3.356 | 0 |
| 3.357 | 0 |
| 3.358 | 0 |
| 3.359 | 0 |
| 3.36 | 0 |
| 3.361 | 0 |
| 3.362 | 0 |
| 3.363 | 0 |
| 3.364 | 0 |
| 3.365 | 0 |
| 3.366 | 0 |
| 3.367 | 0 |
| 3.368 | 0 |
| 3.369 | 0 |
| 3.37 | 0 |
| 3.371 | 0 |
| 3.372 | 0 |
| 3.373 | 0 |
| 3.374 | 0 |
| 3.375 | 0 |
| 3.376 | 0 |
| 3.377 | 0 |
| 3.378 | 0 |
| 3.379 | 0 |
| 3.38 | 0 |
| 3.381 | 0 |
| 3.382 | 0 |
| 3.383 | 0 |
| 3.384 | 0 |
| 3.385 | 0 |
| 3.386 | 0 |
| 3.387 | 0 |
| 3.388 | 0 |
| 3.389 | 0 |
| 3.39 | 0 |
| 3.391 | 0 |
| 3.392 | 0 |
| 3.393 | 0 |
| 3.394 | 0 |
| 3.395 | 0 |
| 3.396 | 0 |
| 3.397 | 0 |
| 3.398 | 0 |
| 3.399 | 0 |
| 3.4 | 0 |
| 3.401 | 0 |
| 3.402 | 0 |
| 3.403 | 0 |
| 3.404 | 0 |
| 3.405 | 0 |
| 3.406 | 0 |
| 3.407 | 0 |
| 3.408 | 0 |
| 3.409 | 0 |
| 3.41 | 0 |
| 3.411 | 0 |
| 3.412 | 0 |
| 3.413 | 0 |
| 3.414 | 0 |
| 3.415 | 0 |
| 3.416 | 0 |
| 3.417 | 0 |
| 3.418 | 0 |
| 3.419 | 0 |
| 3.42 | 0 |
| 3.421 | 0 |
| 3.422 | 0 |
| 3.423 | 0 |
| 3.424 | 0 |
| 3.425 | 0 |
| 3.426 | 0 |
| 3.427 | 0 |
| 3.428 | 0 |
| 3.429 | 0 |
| 3.43 | 0 |
| 3.431 | 0 |
| 3.432 | 0 |
| 3.433 | 0 |
| 3.434 | 0 |
| 3.435 | 0 |
| 3.436 | 0 |
| 3.437 | 0 |
| 3.438 | 0 |
| 3.439 | 0 |
| 3.44 | 0 |
| 3.441 | 0 |
| 3.442 | 0 |
| 3.443 | 0 |
| 3.444 | 0 |
| 3.445 | 0 |
| 3.446 | 0 |
| 3.447 | 0 |
| 3.448 | 0 |
| 3.449 | 0 |
| 3.45 | 0 |
| 3.451 | 0 |
| 3.452 | 0 |
| 3.453 | 0 |
| 3.454 | 0 |
| 3.455 | 0 |
| 3.456 | 0 |
| 3.457 | 0 |
| 3.458 | 0 |
| 3.459 | 0 |
| 3.46 | 0 |
| 3.461 | 0 |
| 3.462 | 0 |
| 3.463 | 0 |
| 3.464 | 0 |
| 3.465 | 0 |
| 3.466 | 0 |
| 3.467 | 0 |
| 3.468 | 0 |
| 3.469 | 0 |
| 3.47 | 0 |
| 3.471 | 0 |
| 3.472 | 0 |
| 3.473 | 0 |
| 3.474 | 0 |
| 3.475 | 0 |
| 3.476 | 0 |
| 3.477 | 0 |
| 3.478 | 0 |
| 3.479 | 0 |
| 3.48 | 0 |
| 3.481 | 0 |
| 3.482 | 0 |
| 3.483 | 0 |
| 3.484 | 0 |
| 3.485 | 0 |
| 3.486 | 0 |
| 3.487 | 0 |
| 3.488 | 0 |
| 3.489 | 0 |
| 3.49 | 0 |
| 3.491 | 0 |
| 3.492 | 0 |
| 3.493 | 0 |
| 3.494 | 0 |
| 3.495 | 0 |
| 3.496 | 0 |
| 3.497 | 0 |
| 3.498 | 0 |
| 3.499 | 0 |
| 3.5 | 0 |
| 3.501 | 0 |
| 3.502 | 0 |
| 3.503 | 0 |
| 3.504 | 0 |
| 3.505 | 0 |
| 3.506 | 0 |
| 3.507 | 0 |
| 3.508 | 0 |
| 3.509 | 0 |
| 3.51 | 0 |
| 3.511 | 0 |
| 3.512 | 0 |
| 3.513 | 0 |
| 3.514 | 0 |
| 3.515 | 0 |
| 3.516 | 0 |
| 3.517 | 0 |
| 3.518 | 0 |
| 3.519 | 0 |
| 3.52 | 0 |
| 3.521 | 0 |
| 3.522 | 0 |
| 3.523 | 0 |
| 3.524 | 0 |
| 3.525 | 0 |
| 3.526 | 0 |
| 3.527 | 0 |
| 3.528 | 0 |
| 3.529 | 0 |
| 3.53 | 0 |
| 3.531 | 0 |
| 3.532 | 0 |
| 3.533 | 0 |
| 3.534 | 0 |
| 3.535 | 0 |
| 3.536 | 0 |
| 3.537 | 0 |
| 3.538 | 0 |
| 3.539 | 0 |
| 3.54 | 0 |
| 3.541 | 0 |
| 3.542 | 0 |
| 3.543 | 0 |
| 3.544 | 0 |
| 3.545 | 0 |
| 3.546 | 0 |
| 3.547 | 0 |
| 3.548 | 0 |
| 3.549 | 0 |
| 3.55 | 0 |
| 3.551 | 0 |
| 3.552 | 0 |
| 3.553 | 0 |
| 3.554 | 0 |
| 3.555 | 0 |
| 3.556 | 0 |
| 3.557 | 0 |
| 3.558 | 0 |
| 3.559 | 0 |
| 3.56 | 0 |
| 3.561 | 0 |
| 3.562 | 0 |
| 3.563 | 0 |
| 3.564 | 0 |
| 3.565 | 0 |
| 3.566 | 0 |
| 3.567 | 0 |
| 3.568 | 0 |
| 3.569 | 0 |
| 3.57 | 0 |
| 3.571 | 0 |
| 3.572 | 0 |
| 3.573 | 0 |
| 3.574 | 0 |
| 3.575 | 0 |
| 3.576 | 0 |
| 3.577 | 0 |
| 3.578 | 0 |
| 3.579 | 0 |
| 3.58 | 0 |
| 3.581 | 0 |
| 3.582 | 0 |
| 3.583 | 0 |
| 3.584 | 0 |
| 3.585 | 0 |
| 3.586 | 0 |
| 3.587 | 0 |
| 3.588 | 0 |
| 3.589 | 0 |
| 3.59 | 0 |
| 3.591 | 0 |
| 3.592 | 0 |
| 3.593 | 0 |
| 3.594 | 0 |
| 3.595 | 0 |
| 3.596 | 0 |
| 3.597 | 0 |
| 3.598 | 0 |
| 3.599 | 0 |
| 3.6 | 0 |
| 3.601 | 0 |
| 3.602 | 0 |
| 3.603 | 0 |
| 3.604 | 0 |
| 3.605 | 0 |
| 3.606 | 0 |
| 3.607 | 0 |
| 3.608 | 0 |
| 3.609 | 0 |
| 3.61 | 0 |
| 3.611 | 0 |
| 3.612 | 0 |
| 3.613 | 0 |
| 3.614 | 0 |
| 3.615 | 0 |
| 3.616 | 0 |
| 3.617 | 0 |
| 3.618 | 0 |
| 3.619 | 0 |
| 3.62 | 0 |
| 3.621 | 0 |
| 3.622 | 0 |
| 3.623 | 0 |
| 3.624 | 0 |
| 3.625 | 0 |
| 3.626 | 0 |
| 3.627 | 0 |
| 3.628 | 0 |
| 3.629 | 0 |
| 3.63 | 0 |
| 3.631 | 0 |
| 3.632 | 0 |
| 3.633 | 0 |
| 3.634 | 0 |
| 3.635 | 0 |
| 3.636 | 0 |
| 3.637 | 0 |
| 3.638 | 0 |
| 3.639 | 0 |
| 3.64 | 0 |
| 3.641 | 0 |
| 3.642 | 0 |
| 3.643 | 0 |
| 3.644 | 0 |
| 3.645 | 0 |
| 3.646 | 0 |
| 3.647 | 0 |
| 3.648 | 0 |
| 3.649 | 0 |
| 3.65 | 0 |
| 3.651 | 0 |
| 3.652 | 0 |
| 3.653 | 0 |
| 3.654 | 0 |
| 3.655 | 0 |
| 3.656 | 0 |
| 3.657 | 0 |
| 3.658 | 0 |
| 3.659 | 0 |
| 3.66 | 0 |
| 3.661 | 0 |
| 3.662 | 0 |
| 3.663 | 0 |
| 3.664 | 0 |
| 3.665 | 0 |
| 3.666 | 0 |
| 3.667 | 0 |
| 3.668 | 0 |
| 3.669 | 0 |
| 3.67 | 0 |
| 3.671 | 0 |
| 3.672 | 0 |
| 3.673 | 0 |
| 3.674 | 0 |
| 3.675 | 0 |
| 3.676 | 0 |
| 3.677 | 0 |
| 3.678 | 0 |
| 3.679 | 0 |
| 3.68 | 0 |
| 3.681 | 0 |
| 3.682 | 0 |
| 3.683 | 0 |
| 3.684 | 0 |
| 3.685 | 0 |
| 3.686 | 0 |
| 3.687 | 0 |
| 3.688 | 0 |
| 3.689 | 0 |
| 3.69 | 0 |
| 3.691 | 0 |
| 3.692 | 0 |
| 3.693 | 0 |
| 3.694 | 0 |
| 3.695 | 0 |
| 3.696 | 0 |
| 3.697 | 0 |
| 3.698 | 0 |
| 3.699 | 0 |
| 3.7 | 0 |
| 3.701 | 0 |
| 3.702 | 0 |
| 3.703 | 0 |
| 3.704 | 0 |
| 3.705 | 0 |
| 3.706 | 0 |
| 3.707 | 0 |
| 3.708 | 0 |
| 3.709 | 0 |
| 3.71 | 0 |
| 3.711 | 0 |
| 3.712 | 0 |
| 3.713 | 0 |
| 3.714 | 0 |
| 3.715 | 0 |
| 3.716 | 0 |
| 3.717 | 0 |
| 3.718 | 0 |
| 3.719 | 0 |
| 3.72 | 0 |
| 3.721 | 0 |
| 3.722 | 0 |
| 3.723 | 0 |
| 3.724 | 0 |
| 3.725 | 0 |
| 3.726 | 0 |
| 3.727 | 0 |
| 3.728 | 0 |
| 3.729 | 0 |
| 3.73 | 0 |
| 3.731 | 0 |
| 3.732 | 0 |
| 3.733 | 0 |
| 3.734 | 0 |
| 3.735 | 0 |
| 3.736 | 0 |
| 3.737 | 0 |
| 3.738 | 0 |
| 3.739 | 0 |
| 3.74 | 0 |
| 3.741 | 0 |
| 3.742 | 0 |
| 3.743 | 0 |
| 3.744 | 0 |
| 3.745 | 0 |
| 3.746 | 0 |
| 3.747 | 0 |
| 3.748 | 0 |
| 3.749 | 0 |
| 3.75 | 0 |
| 3.751 | 0 |
| 3.752 | 0 |
| 3.753 | 0 |
| 3.754 | 0 |
| 3.755 | 0 |
| 3.756 | 0 |
| 3.757 | 0 |
| 3.758 | 0 |
| 3.759 | 0 |
| 3.76 | 0 |
| 3.761 | 0 |
| 3.762 | 0 |
| 3.763 | 0 |
| 3.764 | 0 |
| 3.765 | 0 |
| 3.766 | 0 |
| 3.767 | 0 |
| 3.768 | 0 |
| 3.769 | 0 |
| 3.77 | 0 |
| 3.771 | 0 |
| 3.772 | 0 |
| 3.773 | 0 |
| 3.774 | 0 |
| 3.775 | 0 |
| 3.776 | 0 |
| 3.777 | 0 |
| 3.778 | 0 |
| 3.779 | 0 |
| 3.78 | 0 |
| 3.781 | 0 |
| 3.782 | 0 |
| 3.783 | 0 |
| 3.784 | 0 |
| 3.785 | 0 |
| 3.786 | 0 |
| 3.787 | 0 |
| 3.788 | 0 |
| 3.789 | 0 |
| 3.79 | 0 |
| 3.791 | 0 |
| 3.792 | 0 |
| 3.793 | 0 |
| 3.794 | 0 |
| 3.795 | 0 |
| 3.796 | 0 |
| 3.797 | 0 |
| 3.798 | 0 |
| 3.799 | 0 |
| 3.8 | 0 |
| 3.801 | 0 |
| 3.802 | 0 |
| 3.803 | 0 |
| 3.804 | 0 |
| 3.805 | 0 |
| 3.806 | 0 |
| 3.807 | 0 |
| 3.808 | 0 |
| 3.809 | 0 |
| 3.81 | 0 |
| 3.811 | 0 |
| 3.812 | 0 |
| 3.813 | 0 |
| 3.814 | 0 |
| 3.815 | 0 |
| 3.816 | 0 |
| 3.817 | 0 |
| 3.818 | 0 |
| 3.819 | 0 |
| 3.82 | 0 |
| 3.821 | 0 |
| 3.822 | 0 |
| 3.823 | 0 |
| 3.824 | 0 |
| 3.825 | 0 |
| 3.826 | 0 |
| 3.827 | 0 |
| 3.828 | 0 |
| 3.829 | 0 |
| 3.83 | 0 |
| 3.831 | 0 |
| 3.832 | 0 |
| 3.833 | 0 |
| 3.834 | 0 |
| 3.835 | 0 |
| 3.836 | 0 |
| 3.837 | 0 |
| 3.838 | 0 |
| 3.839 | 0 |
| 3.84 | 0 |
| 3.841 | 0 |
| 3.842 | 0 |
| 3.843 | 0 |
| 3.844 | 0 |
| 3.845 | 0 |
| 3.846 | 0 |
| 3.847 | 0 |
| 3.848 | 0 |
| 3.849 | 0 |
| 3.85 | 0 |
| 3.851 | 0 |
| 3.852 | 0 |
| 3.853 | 0 |
| 3.854 | 0 |
| 3.855 | 0 |
| 3.856 | 0 |
| 3.857 | 0 |
| 3.858 | 0 |
| 3.859 | 0 |
| 3.86 | 0 |
| 3.861 | 0 |
| 3.862 | 0 |
| 3.863 | 0 |
| 3.864 | 0 |
| 3.865 | 0 |
| 3.866 | 0 |
| 3.867 | 0 |
| 3.868 | 0 |
| 3.869 | 0 |
| 3.87 | 0 |
| 3.871 | 0 |
| 3.872 | 0 |
| 3.873 | 0 |
| 3.874 | 0 |
| 3.875 | 0 |
| 3.876 | 0 |
| 3.877 | 0 |
| 3.878 | 0 |
| 3.879 | 0 |
| 3.88 | 0 |
| 3.881 | 0 |
| 3.882 | 0 |
| 3.883 | 0 |
| 3.884 | 0 |
| 3.885 | 0 |
| 3.886 | 0 |
| 3.887 | 0 |
| 3.888 | 0 |
| 3.889 | 0 |
| 3.89 | 0 |
| 3.891 | 0 |
| 3.892 | 0 |
| 3.893 | 0 |
| 3.894 | 0 |
| 3.895 | 0 |
| 3.896 | 0 |
| 3.897 | 0 |
| 3.898 | 0 |
| 3.899 | 0 |
| 3.9 | 0 |
| 3.901 | 0 |
| 3.902 | 0 |
| 3.903 | 0 |
| 3.904 | 0 |
| 3.905 | 0 |
| 3.906 | 0 |
| 3.907 | 0 |
| 3.908 | 0 |
| 3.909 | 0 |
| 3.91 | 0 |
| 3.911 | 0 |
| 3.912 | 0 |
| 3.913 | 0 |
| 3.914 | 0 |
| 3.915 | 0 |
| 3.916 | 0 |
| 3.917 | 0 |
| 3.918 | 0 |
| 3.919 | 0 |
| 3.92 | 0 |
| 3.921 | 0 |
| 3.922 | 0 |
| 3.923 | 0 |
| 3.924 | 0 |
| 3.925 | 0 |
| 3.926 | 0 |
| 3.927 | 0 |
| 3.928 | 0 |
| 3.929 | 0 |
| 3.93 | 0 |
| 3.931 | 0 |
| 3.932 | 0 |
| 3.933 | 0 |
| 3.934 | 0 |
| 3.935 | 0 |
| 3.936 | 0 |
| 3.937 | 0 |
| 3.938 | 0 |
| 3.939 | 0 |
| 3.94 | 0 |
| 3.941 | 0 |
| 3.942 | 0 |
| 3.943 | 0 |
| 3.944 | 0 |
| 3.945 | 0 |
| 3.946 | 0 |
| 3.947 | 0 |
| 3.948 | 0 |
| 3.949 | 0 |
| 3.95 | 0 |
| 3.951 | 0 |
| 3.952 | 0 |
| 3.953 | 0 |
| 3.954 | 0 |
| 3.955 | 0 |
| 3.956 | 0 |
| 3.957 | 0 |
| 3.958 | 0 |
| 3.959 | 0 |
| 3.96 | 0 |
| 3.961 | 0 |
| 3.962 | 0 |
| 3.963 | 0 |
| 3.964 | 0 |
| 3.965 | 0 |
| 3.966 | 0 |
| 3.967 | 0 |
| 3.968 | 0 |
| 3.969 | 0 |
| 3.97 | 0 |
| 3.971 | 0 |
| 3.972 | 0 |
| 3.973 | 0 |
| 3.974 | 0 |
| 3.975 | 0 |
| 3.976 | 0 |
| 3.977 | 0 |
| 3.978 | 0 |
| 3.979 | 0 |
| 3.98 | 0 |
| 3.981 | 0 |
| 3.982 | 0 |
| 3.983 | 0 |
| 3.984 | 0 |
| 3.985 | 0 |
| 3.986 | 0 |
| 3.987 | 0 |
| 3.988 | 0 |
| 3.989 | 0 |
| 3.99 | 0 |
| 3.991 | 0 |
| 3.992 | 0 |
| 3.993 | 0 |
| 3.994 | 0 |
| 3.995 | 0 |
| 3.996 | 0 |
| 3.997 | 0 |
| 3.998 | 0 |
| 3.999 | 0 |
| 4.0 | 0 |
| 4.001 | 0 |
| 4.002 | 0 |
| 4.003 | 0 |
| 4.004 | 0 |
| 4.005 | 0 |
| 4.006 | 0 |
| 4.007 | 0 |
| 4.008 | 0 |
| 4.009 | 0 |
| 4.01 | 0 |
| 4.011 | 0 |
| 4.012 | 0 |
| 4.013 | 0 |
| 4.014 | 0 |
| 4.015 | 0 |
| 4.016 | 0 |
| 4.017 | 0 |
| 4.018 | 0 |
| 4.019 | 0 |
| 4.02 | 0 |
| 4.021 | 0 |
| 4.022 | 0 |
| 4.023 | 0 |
| 4.024 | 0 |
| 4.025 | 0 |
| 4.026 | 0 |
| 4.027 | 0 |
| 4.028 | 0 |
| 4.029 | 0 |
| 4.03 | 0 |
| 4.031 | 0 |
| 4.032 | 0 |
| 4.033 | 0 |
| 4.034 | 0 |
| 4.035 | 0 |
| 4.036 | 0 |
| 4.037 | 0 |
| 4.038 | 0 |
| 4.039 | 0 |
| 4.04 | 0 |
| 4.041 | 0 |
| 4.042 | 0 |
| 4.043 | 0 |
| 4.044 | 0 |
| 4.045 | 0 |
| 4.046 | 0 |
| 4.047 | 0 |
| 4.048 | 0 |
| 4.049 | 0 |
| 4.05 | 0 |
| 4.051 | 0 |
| 4.052 | 0 |
| 4.053 | 0 |
| 4.054 | 0 |
| 4.055 | 0 |
| 4.056 | 0 |
| 4.057 | 0 |
| 4.058 | 0 |
| 4.059 | 0 |
| 4.06 | 0 |
| 4.061 | 0 |
| 4.062 | 0 |
| 4.063 | 0 |
| 4.064 | 0 |
| 4.065 | 0 |
| 4.066 | 0 |
| 4.067 | 0 |
| 4.068 | 0 |
| 4.069 | 0 |
| 4.07 | 0 |
| 4.071 | 0 |
| 4.072 | 0 |
| 4.073 | 0 |
| 4.074 | 0 |
| 4.075 | 0 |
| 4.076 | 0 |
| 4.077 | 0 |
| 4.078 | 0 |
| 4.079 | 0 |
| 4.08 | 0 |
| 4.081 | 0 |
| 4.082 | 0 |
| 4.083 | 0 |
| 4.084 | 0 |
| 4.085 | 0 |
| 4.086 | 0 |
| 4.087 | 0 |
| 4.088 | 0 |
| 4.089 | 0 |
| 4.09 | 0 |
| 4.091 | 0 |
| 4.092 | 0 |
| 4.093 | 0 |
| 4.094 | 0 |
| 4.095 | 0 |
| 4.096 | 0 |
| 4.097 | 0 |
| 4.098 | 0 |
| 4.099 | 0 |
| 4.1 | 0 |
| 4.101 | 0 |
| 4.102 | 0 |
| 4.103 | 0 |
| 4.104 | 0 |
| 4.105 | 0 |
| 4.106 | 0 |
| 4.107 | 0 |
| 4.108 | 0 |
| 4.109 | 0 |
| 4.11 | 0 |
| 4.111 | 0 |
| 4.112 | 0 |
| 4.113 | 0 |
| 4.114 | 0 |
| 4.115 | 0 |
| 4.116 | 0 |
| 4.117 | 0 |
| 4.118 | 0 |
| 4.119 | 0 |
| 4.12 | 0 |
| 4.121 | 0 |
| 4.122 | 0 |
| 4.123 | 0 |
| 4.124 | 0 |
| 4.125 | 0 |
| 4.126 | 0 |
| 4.127 | 0 |
| 4.128 | 0 |
| 4.129 | 0.001 |
| 4.13 | 0.001 |
| 4.131 | 0.001 |
| 4.132 | 0.001 |
| 4.133 | 0.001 |
| 4.134 | 0.001 |
| 4.135 | 0.001 |
| 4.136 | 0.001 |
| 4.137 | 0.001 |
| 4.138 | 0.001 |
| 4.139 | 0.001 |
| 4.14 | 0.001 |
| 4.141 | 0.001 |
| 4.142 | 0.001 |
| 4.143 | 0.001 |
| 4.144 | 0.001 |
| 4.145 | 0.001 |
| 4.146 | 0.001 |
| 4.147 | 0.001 |
| 4.148 | 0.001 |
| 4.149 | 0.001 |
| 4.15 | 0.001 |
| 4.151 | 0.001 |
| 4.152 | 0.001 |
| 4.153 | 0.001 |
| 4.154 | 0.001 |
| 4.155 | 0.001 |
| 4.156 | 0.001 |
| 4.157 | 0.001 |
| 4.158 | 0.001 |
| 4.159 | 0.001 |
| 4.16 | 0.001 |
| 4.161 | 0.001 |
| 4.162 | 0.001 |
| 4.163 | 0.001 |
| 4.164 | 0.001 |
| 4.165 | 0.001 |
| 4.166 | 0.001 |
| 4.167 | 0.001 |
| 4.168 | 0.001 |
| 4.169 | 0.001 |
| 4.17 | 0.001 |
| 4.171 | 0.001 |
| 4.172 | 0.001 |
| 4.173 | 0.001 |
| 4.174 | 0.001 |
| 4.175 | 0.001 |
| 4.176 | 0.001 |
| 4.177 | 0.001 |
| 4.178 | 0.001 |
| 4.179 | 0.001 |
| 4.18 | 0.001 |
| 4.181 | 0.001 |
| 4.182 | 0.001 |
| 4.183 | 0.001 |
| 4.184 | 0.001 |
| 4.185 | 0.001 |
| 4.186 | 0.001 |
| 4.187 | 0.001 |
| 4.188 | 0.001 |
| 4.189 | 0.001 |
| 4.19 | 0.001 |
| 4.191 | 0.001 |
| 4.192 | 0.001 |
| 4.193 | 0.001 |
| 4.194 | 0.002 |
| 4.195 | 0.002 |
| 4.196 | 0.002 |
| 4.197 | 0.002 |
| 4.198 | 0.002 |
| 4.199 | 0.002 |
| 4.2 | 0.002 |
| 4.201 | 0.002 |
| 4.202 | 0.002 |
| 4.203 | 0.002 |
| 4.204 | 0.002 |
| 4.205 | 0.002 |
| 4.206 | 0.002 |
| 4.207 | 0.002 |
| 4.208 | 0.002 |
| 4.209 | 0.002 |
| 4.21 | 0.002 |
| 4.211 | 0.002 |
| 4.212 | 0.002 |
| 4.213 | 0.002 |
| 4.214 | 0.002 |
| 4.215 | 0.002 |
| 4.216 | 0.002 |
| 4.217 | 0.002 |
| 4.218 | 0.002 |
| 4.219 | 0.002 |
| 4.22 | 0.002 |
| 4.221 | 0.002 |
| 4.222 | 0.002 |
| 4.223 | 0.002 |
| 4.224 | 0.002 |
| 4.225 | 0.002 |
| 4.226 | 0.003 |
| 4.227 | 0.003 |
| 4.228 | 0.003 |
| 4.229 | 0.003 |
| 4.23 | 0.003 |
| 4.231 | 0.003 |
| 4.232 | 0.003 |
| 4.233 | 0.003 |
| 4.234 | 0.003 |
| 4.235 | 0.003 |
| 4.236 | 0.003 |
| 4.237 | 0.003 |
| 4.238 | 0.003 |
| 4.239 | 0.003 |
| 4.24 | 0.003 |
| 4.241 | 0.003 |
| 4.242 | 0.003 |
| 4.243 | 0.003 |
| 4.244 | 0.003 |
| 4.245 | 0.003 |
| 4.246 | 0.003 |
| 4.247 | 0.003 |
| 4.248 | 0.003 |
| 4.249 | 0.004 |
| 4.25 | 0.004 |
| 4.251 | 0.004 |
| 4.252 | 0.004 |
| 4.253 | 0.004 |
| 4.254 | 0.004 |
| 4.255 | 0.004 |
| 4.256 | 0.004 |
| 4.257 | 0.004 |
| 4.258 | 0.004 |
| 4.259 | 0.004 |
| 4.26 | 0.004 |
| 4.261 | 0.004 |
| 4.262 | 0.004 |
| 4.263 | 0.004 |
| 4.264 | 0.004 |
| 4.265 | 0.005 |
| 4.266 | 0.005 |
| 4.267 | 0.005 |
| 4.268 | 0.005 |
| 4.269 | 0.005 |
| 4.27 | 0.005 |
| 4.271 | 0.005 |
| 4.272 | 0.005 |
| 4.273 | 0.005 |
| 4.274 | 0.005 |
| 4.275 | 0.005 |
| 4.276 | 0.005 |
| 4.277 | 0.005 |
| 4.278 | 0.005 |
| 4.279 | 0.006 |
| 4.28 | 0.006 |
| 4.281 | 0.006 |
| 4.282 | 0.006 |
| 4.283 | 0.006 |
| 4.284 | 0.006 |
| 4.285 | 0.006 |
| 4.286 | 0.006 |
| 4.287 | 0.006 |
| 4.288 | 0.006 |
| 4.289 | 0.006 |
| 4.29 | 0.006 |
| 4.291 | 0.007 |
| 4.292 | 0.007 |
| 4.293 | 0.007 |
| 4.294 | 0.007 |
| 4.295 | 0.007 |
| 4.296 | 0.007 |
| 4.297 | 0.007 |
| 4.298 | 0.007 |
| 4.299 | 0.007 |
| 4.3 | 0.007 |
| 4.301 | 0.008 |
| 4.302 | 0.008 |
| 4.303 | 0.008 |
| 4.304 | 0.008 |
| 4.305 | 0.008 |
| 4.306 | 0.008 |
| 4.307 | 0.008 |
| 4.308 | 0.008 |
| 4.309 | 0.008 |
| 4.31 | 0.009 |
| 4.311 | 0.009 |
| 4.312 | 0.009 |
| 4.313 | 0.009 |
| 4.314 | 0.009 |
| 4.315 | 0.009 |
| 4.316 | 0.009 |
| 4.317 | 0.009 |
| 4.318 | 0.01 |
| 4.319 | 0.01 |
| 4.32 | 0.01 |
| 4.321 | 0.01 |
| 4.322 | 0.01 |
| 4.323 | 0.01 |
| 4.324 | 0.01 |
| 4.325 | 0.011 |
| 4.326 | 0.011 |
| 4.327 | 0.011 |
| 4.328 | 0.011 |
| 4.329 | 0.011 |
| 4.33 | 0.011 |
| 4.331 | 0.011 |
| 4.332 | 0.012 |
| 4.333 | 0.012 |
| 4.334 | 0.012 |
| 4.335 | 0.012 |
| 4.336 | 0.012 |
| 4.337 | 0.012 |
| 4.338 | 0.012 |
| 4.339 | 0.013 |
| 4.34 | 0.013 |
| 4.341 | 0.013 |
| 4.342 | 0.013 |
| 4.343 | 0.013 |
| 4.344 | 0.014 |
| 4.345 | 0.014 |
| 4.346 | 0.014 |
| 4.347 | 0.014 |
| 4.348 | 0.014 |
| 4.349 | 0.014 |
| 4.35 | 0.015 |
| 4.351 | 0.015 |
| 4.352 | 0.015 |
| 4.353 | 0.015 |
| 4.354 | 0.015 |
| 4.355 | 0.016 |
| 4.356 | 0.016 |
| 4.357 | 0.016 |
| 4.358 | 0.016 |
| 4.359 | 0.016 |
| 4.36 | 0.017 |
| 4.361 | 0.017 |
| 4.362 | 0.017 |
| 4.363 | 0.017 |
| 4.364 | 0.018 |
| 4.365 | 0.018 |
| 4.366 | 0.018 |
| 4.367 | 0.018 |
| 4.368 | 0.018 |
| 4.369 | 0.019 |
| 4.37 | 0.019 |
| 4.371 | 0.019 |
| 4.372 | 0.019 |
| 4.373 | 0.02 |
| 4.374 | 0.02 |
| 4.375 | 0.02 |
| 4.376 | 0.02 |
| 4.377 | 0.021 |
| 4.378 | 0.021 |
| 4.379 | 0.021 |
| 4.38 | 0.021 |
| 4.381 | 0.022 |
| 4.382 | 0.022 |
| 4.383 | 0.022 |
| 4.384 | 0.022 |
| 4.385 | 0.023 |
| 4.386 | 0.023 |
| 4.387 | 0.023 |
| 4.388 | 0.024 |
| 4.389 | 0.024 |
| 4.39 | 0.024 |
| 4.391 | 0.025 |
| 4.392 | 0.025 |
| 4.393 | 0.025 |
| 4.394 | 0.025 |
| 4.395 | 0.026 |
| 4.396 | 0.026 |
| 4.397 | 0.026 |
| 4.398 | 0.027 |
| 4.399 | 0.027 |
| 4.4 | 0.027 |
| 4.401 | 0.028 |
| 4.402 | 0.028 |
| 4.403 | 0.028 |
| 4.404 | 0.029 |
| 4.405 | 0.029 |
| 4.406 | 0.029 |
| 4.407 | 0.03 |
| 4.408 | 0.03 |
| 4.409 | 0.03 |
| 4.41 | 0.031 |
| 4.411 | 0.031 |
| 4.412 | 0.032 |
| 4.413 | 0.032 |
| 4.414 | 0.032 |
| 4.415 | 0.033 |
| 4.416 | 0.033 |
| 4.417 | 0.033 |
| 4.418 | 0.034 |
| 4.419 | 0.034 |
| 4.42 | 0.035 |
| 4.421 | 0.035 |
| 4.422 | 0.035 |
| 4.423 | 0.036 |
| 4.424 | 0.036 |
| 4.425 | 0.037 |
| 4.426 | 0.037 |
| 4.427 | 0.038 |
| 4.428 | 0.038 |
| 4.429 | 0.038 |
| 4.43 | 0.039 |
| 4.431 | 0.039 |
| 4.432 | 0.04 |
| 4.433 | 0.04 |
| 4.434 | 0.041 |
| 4.435 | 0.041 |
| 4.436 | 0.042 |
| 4.437 | 0.042 |
| 4.438 | 0.042 |
| 4.439 | 0.043 |
| 4.44 | 0.043 |
| 4.441 | 0.044 |
| 4.442 | 0.044 |
| 4.443 | 0.045 |
| 4.444 | 0.045 |
| 4.445 | 0.046 |
| 4.446 | 0.046 |
| 4.447 | 0.047 |
| 4.448 | 0.047 |
| 4.449 | 0.048 |
| 4.45 | 0.049 |
| 4.451 | 0.049 |
| 4.452 | 0.05 |
| 4.453 | 0.05 |
| 4.454 | 0.051 |
| 4.455 | 0.051 |
| 4.456 | 0.052 |
| 4.457 | 0.052 |
| 4.458 | 0.053 |
| 4.459 | 0.054 |
| 4.46 | 0.054 |
| 4.461 | 0.055 |
| 4.462 | 0.055 |
| 4.463 | 0.056 |
| 4.464 | 0.057 |
| 4.465 | 0.057 |
| 4.466 | 0.058 |
| 4.467 | 0.058 |
| 4.468 | 0.059 |
| 4.469 | 0.06 |
| 4.47 | 0.06 |
| 4.471 | 0.061 |
| 4.472 | 0.062 |
| 4.473 | 0.062 |
| 4.474 | 0.063 |
| 4.475 | 0.064 |
| 4.476 | 0.064 |
| 4.477 | 0.065 |
| 4.478 | 0.066 |
| 4.479 | 0.066 |
| 4.48 | 0.067 |
| 4.481 | 0.068 |
| 4.482 | 0.068 |
| 4.483 | 0.069 |
| 4.484 | 0.07 |
| 4.485 | 0.07 |
| 4.486 | 0.071 |
| 4.487 | 0.072 |
| 4.488 | 0.073 |
| 4.489 | 0.073 |
| 4.49 | 0.074 |
| 4.491 | 0.075 |
| 4.492 | 0.076 |
| 4.493 | 0.076 |
| 4.494 | 0.077 |
| 4.495 | 0.078 |
| 4.496 | 0.079 |
| 4.497 | 0.08 |
| 4.498 | 0.08 |
| 4.499 | 0.081 |
| 4.5 | 0.082 |
| 4.501 | 0.083 |
| 4.502 | 0.084 |
| 4.503 | 0.085 |
| 4.504 | 0.085 |
| 4.505 | 0.086 |
| 4.506 | 0.087 |
| 4.507 | 0.088 |
| 4.508 | 0.089 |
| 4.509 | 0.09 |
| 4.51 | 0.091 |
| 4.511 | 0.092 |
| 4.512 | 0.092 |
| 4.513 | 0.093 |
| 4.514 | 0.094 |
| 4.515 | 0.095 |
| 4.516 | 0.096 |
| 4.517 | 0.097 |
| 4.518 | 0.098 |
| 4.519 | 0.099 |
| 4.52 | 0.1 |
| 4.521 | 0.101 |
| 4.522 | 0.102 |
| 4.523 | 0.103 |
| 4.524 | 0.104 |
| 4.525 | 0.105 |
| 4.526 | 0.106 |
| 4.527 | 0.107 |
| 4.528 | 0.108 |
| 4.529 | 0.109 |
| 4.53 | 0.11 |
| 4.531 | 0.111 |
| 4.532 | 0.112 |
| 4.533 | 0.113 |
| 4.534 | 0.114 |
| 4.535 | 0.115 |
| 4.536 | 0.116 |
| 4.537 | 0.117 |
| 4.538 | 0.118 |
| 4.539 | 0.119 |
| 4.54 | 0.121 |
| 4.541 | 0.122 |
| 4.542 | 0.123 |
| 4.543 | 0.124 |
| 4.544 | 0.125 |
| 4.545 | 0.126 |
| 4.546 | 0.127 |
| 4.547 | 0.128 |
| 4.548 | 0.13 |
| 4.549 | 0.131 |
| 4.55 | 0.132 |
| 4.551 | 0.133 |
| 4.552 | 0.134 |
| 4.553 | 0.136 |
| 4.554 | 0.137 |
| 4.555 | 0.138 |
| 4.556 | 0.139 |
| 4.557 | 0.141 |
| 4.558 | 0.142 |
| 4.559 | 0.143 |
| 4.56 | 0.144 |
| 4.561 | 0.146 |
| 4.562 | 0.147 |
| 4.563 | 0.148 |
| 4.564 | 0.149 |
| 4.565 | 0.151 |
| 4.566 | 0.152 |
| 4.567 | 0.153 |
| 4.568 | 0.155 |
| 4.569 | 0.156 |
| 4.57 | 0.157 |
| 4.571 | 0.159 |
| 4.572 | 0.16 |
| 4.573 | 0.161 |
| 4.574 | 0.163 |
| 4.575 | 0.164 |
| 4.576 | 0.166 |
| 4.577 | 0.167 |
| 4.578 | 0.168 |
| 4.579 | 0.17 |
| 4.58 | 0.171 |
| 4.581 | 0.173 |
| 4.582 | 0.174 |
| 4.583 | 0.176 |
| 4.584 | 0.177 |
| 4.585 | 0.179 |
| 4.586 | 0.18 |
| 4.587 | 0.182 |
| 4.588 | 0.183 |
| 4.589 | 0.185 |
| 4.59 | 0.186 |
| 4.591 | 0.188 |
| 4.592 | 0.189 |
| 4.593 | 0.191 |
| 4.594 | 0.192 |
| 4.595 | 0.194 |
| 4.596 | 0.196 |
| 4.597 | 0.197 |
| 4.598 | 0.199 |
| 4.599 | 0.2 |
| 4.6 | 0.202 |
| 4.601 | 0.204 |
| 4.602 | 0.205 |
| 4.603 | 0.207 |
| 4.604 | 0.208 |
| 4.605 | 0.21 |
| 4.606 | 0.212 |
| 4.607 | 0.213 |
| 4.608 | 0.215 |
| 4.609 | 0.217 |
| 4.61 | 0.218 |
| 4.611 | 0.22 |
| 4.612 | 0.222 |
| 4.613 | 0.224 |
| 4.614 | 0.225 |
| 4.615 | 0.227 |
| 4.616 | 0.229 |
| 4.617 | 0.231 |
| 4.618 | 0.232 |
| 4.619 | 0.234 |
| 4.62 | 0.236 |
| 4.621 | 0.238 |
| 4.622 | 0.24 |
| 4.623 | 0.241 |
| 4.624 | 0.243 |
| 4.625 | 0.245 |
| 4.626 | 0.247 |
| 4.627 | 0.249 |
| 4.628 | 0.251 |
| 4.628999999999999 | 0.252 |
| 4.63 | 0.254 |
| 4.631 | 0.256 |
| 4.632 | 0.258 |
| 4.633 | 0.26 |
| 4.634 | 0.262 |
| 4.635 | 0.264 |
| 4.636 | 0.266 |
| 4.636999999999999 | 0.268 |
| 4.638 | 0.27 |
| 4.639 | 0.272 |
| 4.64 | 0.274 |
| 4.641 | 0.276 |
| 4.642 | 0.278 |
| 4.643 | 0.28 |
| 4.644 | 0.282 |
| 4.644999999999999 | 0.284 |
| 4.646 | 0.286 |
| 4.647 | 0.288 |
| 4.648 | 0.29 |
| 4.649 | 0.292 |
| 4.65 | 0.294 |
| 4.651 | 0.296 |
| 4.652 | 0.298 |
| 4.652999999999999 | 0.3 |
| 4.654 | 0.302 |
| 4.655 | 0.304 |
| 4.656 | 0.306 |
| 4.657 | 0.308 |
| 4.658 | 0.31 |
| 4.659 | 0.313 |
| 4.66 | 0.315 |
| 4.660999999999999 | 0.317 |
| 4.662 | 0.319 |
| 4.663 | 0.321 |
| 4.664 | 0.323 |
| 4.665 | 0.326 |
| 4.666 | 0.328 |
| 4.667 | 0.33 |
| 4.668 | 0.332 |
| 4.668999999999999 | 0.334 |
| 4.67 | 0.337 |
| 4.671 | 0.339 |
| 4.672 | 0.341 |
| 4.673 | 0.343 |
| 4.674 | 0.346 |
| 4.675 | 0.348 |
| 4.676 | 0.35 |
| 4.677 | 0.352 |
| 4.678 | 0.355 |
| 4.679 | 0.357 |
| 4.68 | 0.359 |
| 4.681 | 0.361 |
| 4.682 | 0.364 |
| 4.683 | 0.366 |
| 4.684 | 0.368 |
| 4.685 | 0.371 |
| 4.686 | 0.373 |
| 4.687 | 0.375 |
| 4.688 | 0.378 |
| 4.689 | 0.38 |
| 4.69 | 0.383 |
| 4.691 | 0.385 |
| 4.692 | 0.387 |
| 4.693 | 0.39 |
| 4.694 | 0.392 |
| 4.695 | 0.394 |
| 4.696 | 0.397 |
| 4.697 | 0.399 |
| 4.698 | 0.402 |
| 4.699 | 0.404 |
| 4.7 | 0.407 |
| 4.701 | 0.409 |
| 4.702 | 0.411 |
| 4.703 | 0.414 |
| 4.704 | 0.416 |
| 4.705 | 0.419 |
| 4.706 | 0.421 |
| 4.707 | 0.424 |
| 4.708 | 0.426 |
| 4.709 | 0.429 |
| 4.71 | 0.431 |
| 4.711 | 0.434 |
| 4.712 | 0.436 |
| 4.713 | 0.439 |
| 4.714 | 0.441 |
| 4.715 | 0.444 |
| 4.716 | 0.446 |
| 4.717 | 0.449 |
| 4.718 | 0.451 |
| 4.719 | 0.454 |
| 4.72 | 0.457 |
| 4.721 | 0.459 |
| 4.722 | 0.462 |
| 4.723 | 0.464 |
| 4.724 | 0.467 |
| 4.725 | 0.469 |
| 4.726 | 0.472 |
| 4.727 | 0.475 |
| 4.728 | 0.477 |
| 4.729 | 0.48 |
| 4.73 | 0.482 |
| 4.731 | 0.485 |
| 4.732 | 0.488 |
| 4.733 | 0.49 |
| 4.734 | 0.493 |
| 4.735 | 0.495 |
| 4.736 | 0.498 |
| 4.737 | 0.501 |
| 4.738 | 0.503 |
| 4.739 | 0.506 |
| 4.74 | 0.509 |
| 4.741 | 0.511 |
| 4.742 | 0.514 |
| 4.743 | 0.517 |
| 4.744 | 0.519 |
| 4.745 | 0.522 |
| 4.746 | 0.525 |
| 4.747 | 0.527 |
| 4.748 | 0.53 |
| 4.749 | 0.533 |
| 4.75 | 0.535 |
| 4.751 | 0.538 |
| 4.752 | 0.541 |
| 4.753 | 0.543 |
| 4.753999999999999 | 0.546 |
| 4.755 | 0.549 |
| 4.756 | 0.551 |
| 4.757 | 0.554 |
| 4.758 | 0.557 |
| 4.759 | 0.559 |
| 4.76 | 0.562 |
| 4.761 | 0.565 |
| 4.761999999999999 | 0.568 |
| 4.763 | 0.57 |
| 4.764 | 0.573 |
| 4.765 | 0.576 |
| 4.766 | 0.578 |
| 4.767 | 0.581 |
| 4.768 | 0.584 |
| 4.769 | 0.586 |
| 4.769999999999999 | 0.589 |
| 4.771 | 0.592 |
| 4.772 | 0.595 |
| 4.773 | 0.597 |
| 4.774 | 0.6 |
| 4.775 | 0.603 |
| 4.776 | 0.605 |
| 4.777 | 0.608 |
| 4.778 | 0.611 |
| 4.779 | 0.614 |
| 4.78 | 0.616 |
| 4.781 | 0.619 |
| 4.782 | 0.622 |
| 4.783 | 0.624 |
| 4.784 | 0.627 |
| 4.785 | 0.63 |
| 4.786 | 0.633 |
| 4.787 | 0.635 |
| 4.788 | 0.638 |
| 4.789 | 0.641 |
| 4.79 | 0.643 |
| 4.791 | 0.646 |
| 4.792 | 0.649 |
| 4.793 | 0.651 |
| 4.794 | 0.654 |
| 4.795 | 0.657 |
| 4.796 | 0.66 |
| 4.797 | 0.662 |
| 4.798 | 0.665 |
| 4.799 | 0.668 |
| 4.8 | 0.67 |
| 4.801 | 0.673 |
| 4.802 | 0.676 |
| 4.803 | 0.678 |
| 4.804 | 0.681 |
| 4.805 | 0.684 |
| 4.806 | 0.686 |
| 4.807 | 0.689 |
| 4.808 | 0.692 |
| 4.809 | 0.694 |
| 4.81 | 0.697 |
| 4.811 | 0.7 |
| 4.812 | 0.702 |
| 4.813 | 0.705 |
| 4.814 | 0.708 |
| 4.815 | 0.71 |
| 4.816 | 0.713 |
| 4.817 | 0.715 |
| 4.818 | 0.718 |
| 4.819 | 0.721 |
| 4.82 | 0.723 |
| 4.821 | 0.726 |
| 4.822 | 0.728 |
| 4.823 | 0.731 |
| 4.824 | 0.734 |
| 4.825 | 0.736 |
| 4.826 | 0.739 |
| 4.827 | 0.741 |
| 4.828 | 0.744 |
| 4.829 | 0.746 |
| 4.83 | 0.749 |
| 4.831 | 0.752 |
| 4.832 | 0.754 |
| 4.833 | 0.757 |
| 4.834 | 0.759 |
| 4.835 | 0.762 |
| 4.836 | 0.764 |
| 4.837 | 0.767 |
| 4.838 | 0.769 |
| 4.839 | 0.772 |
| 4.84 | 0.774 |
| 4.841 | 0.777 |
| 4.842 | 0.779 |
| 4.843 | 0.782 |
| 4.844 | 0.784 |
| 4.845 | 0.786 |
| 4.846 | 0.789 |
| 4.847 | 0.791 |
| 4.848 | 0.794 |
| 4.849 | 0.796 |
| 4.85 | 0.799 |
| 4.851 | 0.801 |
| 4.852 | 0.803 |
| 4.853 | 0.806 |
| 4.854 | 0.808 |
| 4.855 | 0.81 |
| 4.856 | 0.813 |
| 4.857 | 0.815 |
| 4.858 | 0.817 |
| 4.859 | 0.82 |
| 4.86 | 0.822 |
| 4.861 | 0.824 |
| 4.862 | 0.827 |
| 4.863 | 0.829 |
| 4.864 | 0.831 |
| 4.865 | 0.833 |
| 4.866 | 0.836 |
| 4.867 | 0.838 |
| 4.868 | 0.84 |
| 4.869 | 0.842 |
| 4.87 | 0.845 |
| 4.871 | 0.847 |
| 4.872 | 0.849 |
| 4.873 | 0.851 |
| 4.874 | 0.853 |
| 4.875 | 0.855 |
| 4.876 | 0.857 |
| 4.877 | 0.86 |
| 4.878 | 0.862 |
| 4.879 | 0.864 |
| 4.88 | 0.866 |
| 4.881 | 0.868 |
| 4.882 | 0.87 |
| 4.883 | 0.872 |
| 4.884 | 0.874 |
| 4.885 | 0.876 |
| 4.886 | 0.878 |
| 4.887 | 0.88 |
| 4.888 | 0.882 |
| 4.889 | 0.884 |
| 4.89 | 0.886 |
| 4.891 | 0.888 |
| 4.892 | 0.89 |
| 4.893 | 0.892 |
| 4.894 | 0.894 |
| 4.895 | 0.896 |
| 4.896 | 0.897 |
| 4.897 | 0.899 |
| 4.898 | 0.901 |
| 4.899 | 0.903 |
| 4.9 | 0.905 |
| 4.901 | 0.907 |
| 4.902 | 0.908 |
| 4.903 | 0.91 |
| 4.904 | 0.912 |
| 4.905 | 0.914 |
| 4.906 | 0.915 |
| 4.907 | 0.917 |
| 4.908 | 0.919 |
| 4.909 | 0.921 |
| 4.91 | 0.922 |
| 4.911 | 0.924 |
| 4.912 | 0.925 |
| 4.913 | 0.927 |
| 4.914 | 0.929 |
| 4.915 | 0.93 |
| 4.916 | 0.932 |
| 4.917 | 0.933 |
| 4.918 | 0.935 |
| 4.919 | 0.936 |
| 4.92 | 0.938 |
| 4.921 | 0.939 |
| 4.922 | 0.941 |
| 4.923 | 0.942 |
| 4.924 | 0.944 |
| 4.925 | 0.945 |
| 4.926 | 0.947 |
| 4.927 | 0.948 |
| 4.928 | 0.949 |
| 4.929 | 0.951 |
| 4.93 | 0.952 |
| 4.931 | 0.954 |
| 4.932 | 0.955 |
| 4.933 | 0.956 |
| 4.934 | 0.957 |
| 4.935 | 0.959 |
| 4.936 | 0.96 |
| 4.937 | 0.961 |
| 4.938 | 0.962 |
| 4.939 | 0.963 |
| 4.94 | 0.965 |
| 4.941 | 0.966 |
| 4.942 | 0.967 |
| 4.943 | 0.968 |
| 4.944 | 0.969 |
| 4.945 | 0.97 |
| 4.946 | 0.971 |
| 4.947 | 0.972 |
| 4.948 | 0.973 |
| 4.949 | 0.974 |
| 4.95 | 0.975 |
| 4.951 | 0.976 |
| 4.952 | 0.977 |
| 4.953 | 0.978 |
| 4.954 | 0.979 |
| 4.955 | 0.98 |
| 4.956 | 0.981 |
| 4.957 | 0.982 |
| 4.958 | 0.983 |
| 4.959 | 0.983 |
| 4.96 | 0.984 |
| 4.961 | 0.985 |
| 4.962 | 0.986 |
| 4.963 | 0.986 |
| 4.964 | 0.987 |
| 4.965 | 0.988 |
| 4.966 | 0.989 |
| 4.967 | 0.989 |
| 4.968 | 0.99 |
| 4.969 | 0.99 |
| 4.97 | 0.991 |
| 4.971 | 0.992 |
| 4.972 | 0.992 |
| 4.973 | 0.993 |
| 4.974 | 0.993 |
| 4.975 | 0.994 |
| 4.976 | 0.994 |
| 4.977 | 0.995 |
| 4.978 | 0.995 |
| 4.979 | 0.996 |
| 4.98 | 0.996 |
| 4.981 | 0.996 |
| 4.982 | 0.997 |
| 4.983 | 0.997 |
| 4.984 | 0.997 |
| 4.985 | 0.998 |
| 4.986 | 0.998 |
| 4.987 | 0.998 |
| 4.988 | 0.999 |
| 4.989 | 0.999 |
| 4.99 | 0.999 |
| 4.991 | 0.999 |
| 4.992 | 0.999 |
| 4.993 | 1 |
| 4.994 | 1 |
| 4.995 | 1 |
| 4.996 | 1 |
| 4.997 | 1 |
| 4.998 | 1 |
| 4.999 | 1 |
| 5.0 | 1 |
| 5.001 | 1 |
| 5.002 | 1 |
| 5.003 | 1 |
| 5.004 | 1 |
| 5.005 | 1 |
| 5.006 | 1 |
| 5.007 | 1 |
| 5.008 | 0.999 |
| 5.009 | 0.999 |
| 5.01 | 0.999 |
| 5.011 | 0.999 |
| 5.012 | 0.999 |
| 5.013 | 0.998 |
| 5.014 | 0.998 |
| 5.015 | 0.998 |
| 5.016 | 0.997 |
| 5.017 | 0.997 |
| 5.018 | 0.997 |
| 5.019 | 0.996 |
| 5.02 | 0.996 |
| 5.021 | 0.996 |
| 5.022 | 0.995 |
| 5.023 | 0.995 |
| 5.024 | 0.994 |
| 5.025 | 0.994 |
| 5.026 | 0.993 |
| 5.027 | 0.993 |
| 5.028 | 0.992 |
| 5.029 | 0.992 |
| 5.03 | 0.991 |
| 5.031 | 0.99 |
| 5.032 | 0.99 |
| 5.033 | 0.989 |
| 5.034 | 0.989 |
| 5.035 | 0.988 |
| 5.036 | 0.987 |
| 5.037 | 0.986 |
| 5.038 | 0.986 |
| 5.039 | 0.985 |
| 5.04 | 0.984 |
| 5.041 | 0.983 |
| 5.042 | 0.983 |
| 5.043 | 0.982 |
| 5.044 | 0.981 |
| 5.045 | 0.98 |
| 5.046 | 0.979 |
| 5.047 | 0.978 |
| 5.048 | 0.977 |
| 5.049 | 0.976 |
| 5.05 | 0.975 |
| 5.051 | 0.974 |
| 5.052 | 0.973 |
| 5.053 | 0.972 |
| 5.054 | 0.971 |
| 5.055 | 0.97 |
| 5.056 | 0.969 |
| 5.057 | 0.968 |
| 5.058 | 0.967 |
| 5.059 | 0.966 |
| 5.06 | 0.965 |
| 5.061 | 0.963 |
| 5.062 | 0.962 |
| 5.063 | 0.961 |
| 5.064 | 0.96 |
| 5.065 | 0.959 |
| 5.066 | 0.957 |
| 5.067 | 0.956 |
| 5.068 | 0.955 |
| 5.069 | 0.954 |
| 5.07 | 0.952 |
| 5.071 | 0.951 |
| 5.072 | 0.949 |
| 5.073 | 0.948 |
| 5.074 | 0.947 |
| 5.075 | 0.945 |
| 5.076 | 0.944 |
| 5.077 | 0.942 |
| 5.078 | 0.941 |
| 5.079 | 0.939 |
| 5.08 | 0.938 |
| 5.081 | 0.936 |
| 5.082 | 0.935 |
| 5.083 | 0.933 |
| 5.084 | 0.932 |
| 5.085 | 0.93 |
| 5.086 | 0.929 |
| 5.087 | 0.927 |
| 5.088 | 0.925 |
| 5.089 | 0.924 |
| 5.09 | 0.922 |
| 5.091 | 0.921 |
| 5.092 | 0.919 |
| 5.093 | 0.917 |
| 5.094 | 0.915 |
| 5.095 | 0.914 |
| 5.096 | 0.912 |
| 5.097 | 0.91 |
| 5.098 | 0.908 |
| 5.099 | 0.907 |
| 5.1 | 0.905 |
| 5.101 | 0.903 |
| 5.102 | 0.901 |
| 5.103 | 0.899 |
| 5.104 | 0.897 |
| 5.105 | 0.896 |
| 5.106 | 0.894 |
| 5.107 | 0.892 |
| 5.108 | 0.89 |
| 5.109 | 0.888 |
| 5.11 | 0.886 |
| 5.111 | 0.884 |
| 5.112 | 0.882 |
| 5.113 | 0.88 |
| 5.114 | 0.878 |
| 5.115 | 0.876 |
| 5.116 | 0.874 |
| 5.117 | 0.872 |
| 5.118 | 0.87 |
| 5.119 | 0.868 |
| 5.12 | 0.866 |
| 5.121 | 0.864 |
| 5.122 | 0.862 |
| 5.123 | 0.86 |
| 5.124 | 0.857 |
| 5.125 | 0.855 |
| 5.126 | 0.853 |
| 5.127 | 0.851 |
| 5.128 | 0.849 |
| 5.129 | 0.847 |
| 5.13 | 0.845 |
| 5.131 | 0.842 |
| 5.132 | 0.84 |
| 5.133 | 0.838 |
| 5.134 | 0.836 |
| 5.135 | 0.833 |
| 5.136 | 0.831 |
| 5.137 | 0.829 |
| 5.138 | 0.827 |
| 5.139 | 0.824 |
| 5.14 | 0.822 |
| 5.141 | 0.82 |
| 5.142 | 0.817 |
| 5.143 | 0.815 |
| 5.144 | 0.813 |
| 5.145 | 0.81 |
| 5.146 | 0.808 |
| 5.147 | 0.806 |
| 5.148 | 0.803 |
| 5.149 | 0.801 |
| 5.15 | 0.799 |
| 5.151 | 0.796 |
| 5.152 | 0.794 |
| 5.153 | 0.791 |
| 5.154 | 0.789 |
| 5.155 | 0.786 |
| 5.156 | 0.784 |
| 5.157 | 0.782 |
| 5.158 | 0.779 |
| 5.159 | 0.777 |
| 5.16 | 0.774 |
| 5.161 | 0.772 |
| 5.162 | 0.769 |
| 5.163 | 0.767 |
| 5.164 | 0.764 |
| 5.165 | 0.762 |
| 5.166 | 0.759 |
| 5.167 | 0.757 |
| 5.168 | 0.754 |
| 5.169 | 0.752 |
| 5.17 | 0.749 |
| 5.171 | 0.746 |
| 5.172 | 0.744 |
| 5.173 | 0.741 |
| 5.174 | 0.739 |
| 5.175 | 0.736 |
| 5.176 | 0.734 |
| 5.177 | 0.731 |
| 5.178 | 0.728 |
| 5.179 | 0.726 |
| 5.18 | 0.723 |
| 5.181 | 0.721 |
| 5.182 | 0.718 |
| 5.183 | 0.715 |
| 5.184 | 0.713 |
| 5.185 | 0.71 |
| 5.186 | 0.708 |
| 5.187 | 0.705 |
| 5.188 | 0.702 |
| 5.189 | 0.7 |
| 5.19 | 0.697 |
| 5.191 | 0.694 |
| 5.192 | 0.692 |
| 5.193 | 0.689 |
| 5.194 | 0.686 |
| 5.195 | 0.684 |
| 5.196 | 0.681 |
| 5.197 | 0.678 |
| 5.198 | 0.676 |
| 5.199 | 0.673 |
| 5.2 | 0.67 |
| 5.201 | 0.668 |
| 5.202 | 0.665 |
| 5.203 | 0.662 |
| 5.204 | 0.66 |
| 5.205 | 0.657 |
| 5.206 | 0.654 |
| 5.207 | 0.651 |
| 5.208 | 0.649 |
| 5.209 | 0.646 |
| 5.21 | 0.643 |
| 5.211 | 0.641 |
| 5.212 | 0.638 |
| 5.213 | 0.635 |
| 5.214 | 0.633 |
| 5.215 | 0.63 |
| 5.216 | 0.627 |
| 5.217 | 0.624 |
| 5.218 | 0.622 |
| 5.219 | 0.619 |
| 5.22 | 0.616 |
| 5.221 | 0.614 |
| 5.222 | 0.611 |
| 5.223 | 0.608 |
| 5.224 | 0.605 |
| 5.225 | 0.603 |
| 5.226 | 0.6 |
| 5.227 | 0.597 |
| 5.228 | 0.595 |
| 5.229 | 0.592 |
| 5.23 | 0.589 |
| 5.231 | 0.586 |
| 5.232 | 0.584 |
| 5.233 | 0.581 |
| 5.234 | 0.578 |
| 5.235 | 0.576 |
| 5.236 | 0.573 |
| 5.237 | 0.57 |
| 5.238 | 0.568 |
| 5.239 | 0.565 |
| 5.24 | 0.562 |
| 5.241 | 0.559 |
| 5.242 | 0.557 |
| 5.243 | 0.554 |
| 5.244 | 0.551 |
| 5.245 | 0.549 |
| 5.246 | 0.546 |
| 5.247 | 0.543 |
| 5.248 | 0.541 |
| 5.249 | 0.538 |
| 5.25 | 0.535 |
| 5.251 | 0.533 |
| 5.252 | 0.53 |
| 5.253 | 0.527 |
| 5.254 | 0.525 |
| 5.255 | 0.522 |
| 5.256 | 0.519 |
| 5.257 | 0.517 |
| 5.258 | 0.514 |
| 5.259 | 0.511 |
| 5.26 | 0.509 |
| 5.261 | 0.506 |
| 5.262 | 0.503 |
| 5.263 | 0.501 |
| 5.264 | 0.498 |
| 5.265 | 0.495 |
| 5.266 | 0.493 |
| 5.267 | 0.49 |
| 5.268 | 0.488 |
| 5.269 | 0.485 |
| 5.27 | 0.482 |
| 5.271 | 0.48 |
| 5.272 | 0.477 |
| 5.273 | 0.475 |
| 5.274 | 0.472 |
| 5.275 | 0.469 |
| 5.276 | 0.467 |
| 5.277 | 0.464 |
| 5.278 | 0.462 |
| 5.279 | 0.459 |
| 5.28 | 0.457 |
| 5.281 | 0.454 |
| 5.282 | 0.451 |
| 5.283 | 0.449 |
| 5.284 | 0.446 |
| 5.285 | 0.444 |
| 5.286 | 0.441 |
| 5.287 | 0.439 |
| 5.288 | 0.436 |
| 5.289 | 0.434 |
| 5.29 | 0.431 |
| 5.291 | 0.429 |
| 5.292 | 0.426 |
| 5.293 | 0.424 |
| 5.294 | 0.421 |
| 5.295 | 0.419 |
| 5.296 | 0.416 |
| 5.297 | 0.414 |
| 5.298 | 0.411 |
| 5.299 | 0.409 |
| 5.3 | 0.407 |
| 5.301 | 0.404 |
| 5.302 | 0.402 |
| 5.303 | 0.399 |
| 5.304 | 0.397 |
| 5.305 | 0.394 |
| 5.306 | 0.392 |
| 5.307 | 0.39 |
| 5.308 | 0.387 |
| 5.309 | 0.385 |
| 5.31 | 0.383 |
| 5.311 | 0.38 |
| 5.312 | 0.378 |
| 5.313 | 0.375 |
| 5.314 | 0.373 |
| 5.315 | 0.371 |
| 5.316 | 0.368 |
| 5.317 | 0.366 |
| 5.318 | 0.364 |
| 5.319 | 0.361 |
| 5.32 | 0.359 |
| 5.321 | 0.357 |
| 5.322 | 0.355 |
| 5.323 | 0.352 |
| 5.324 | 0.35 |
| 5.325 | 0.348 |
| 5.326 | 0.346 |
| 5.327 | 0.343 |
| 5.328 | 0.341 |
| 5.329 | 0.339 |
| 5.33 | 0.337 |
| 5.331 | 0.334 |
| 5.332 | 0.332 |
| 5.333 | 0.33 |
| 5.334 | 0.328 |
| 5.335 | 0.326 |
| 5.336 | 0.323 |
| 5.337 | 0.321 |
| 5.338 | 0.319 |
| 5.339 | 0.317 |
| 5.34 | 0.315 |
| 5.341 | 0.313 |
| 5.342 | 0.31 |
| 5.343 | 0.308 |
| 5.344 | 0.306 |
| 5.345 | 0.304 |
| 5.346 | 0.302 |
| 5.347 | 0.3 |
| 5.348 | 0.298 |
| 5.349 | 0.296 |
| 5.35 | 0.294 |
| 5.351 | 0.292 |
| 5.352 | 0.29 |
| 5.353 | 0.288 |
| 5.354 | 0.286 |
| 5.355 | 0.284 |
| 5.356 | 0.282 |
| 5.357 | 0.28 |
| 5.358 | 0.278 |
| 5.359 | 0.276 |
| 5.36 | 0.274 |
| 5.361 | 0.272 |
| 5.362 | 0.27 |
| 5.363 | 0.268 |
| 5.364 | 0.266 |
| 5.365 | 0.264 |
| 5.366 | 0.262 |
| 5.367 | 0.26 |
| 5.368 | 0.258 |
| 5.369 | 0.256 |
| 5.37 | 0.254 |
| 5.371 | 0.252 |
| 5.372 | 0.251 |
| 5.373 | 0.249 |
| 5.374 | 0.247 |
| 5.375 | 0.245 |
| 5.376 | 0.243 |
| 5.377 | 0.241 |
| 5.378 | 0.24 |
| 5.379 | 0.238 |
| 5.38 | 0.236 |
| 5.381 | 0.234 |
| 5.382 | 0.232 |
| 5.383 | 0.231 |
| 5.384 | 0.229 |
| 5.385 | 0.227 |
| 5.386 | 0.225 |
| 5.387 | 0.224 |
| 5.388 | 0.222 |
| 5.389 | 0.22 |
| 5.39 | 0.218 |
| 5.391 | 0.217 |
| 5.392 | 0.215 |
| 5.393 | 0.213 |
| 5.394 | 0.212 |
| 5.395 | 0.21 |
| 5.396 | 0.208 |
| 5.397 | 0.207 |
| 5.398 | 0.205 |
| 5.399 | 0.204 |
| 5.4 | 0.202 |
| 5.401 | 0.2 |
| 5.402 | 0.199 |
| 5.403 | 0.197 |
| 5.404 | 0.196 |
| 5.405 | 0.194 |
| 5.406 | 0.192 |
| 5.407 | 0.191 |
| 5.408 | 0.189 |
| 5.409 | 0.188 |
| 5.41 | 0.186 |
| 5.411 | 0.185 |
| 5.412 | 0.183 |
| 5.413 | 0.182 |
| 5.414 | 0.18 |
| 5.415 | 0.179 |
| 5.416 | 0.177 |
| 5.417 | 0.176 |
| 5.418 | 0.174 |
| 5.419 | 0.173 |
| 5.42 | 0.171 |
| 5.421 | 0.17 |
| 5.422 | 0.168 |
| 5.423 | 0.167 |
| 5.424 | 0.166 |
| 5.425 | 0.164 |
| 5.426 | 0.163 |
| 5.427 | 0.161 |
| 5.428 | 0.16 |
| 5.429 | 0.159 |
| 5.43 | 0.157 |
| 5.431 | 0.156 |
| 5.432 | 0.155 |
| 5.433 | 0.153 |
| 5.434 | 0.152 |
| 5.435 | 0.151 |
| 5.436 | 0.149 |
| 5.437 | 0.148 |
| 5.438 | 0.147 |
| 5.439 | 0.146 |
| 5.44 | 0.144 |
| 5.441 | 0.143 |
| 5.442 | 0.142 |
| 5.443 | 0.141 |
| 5.444 | 0.139 |
| 5.445 | 0.138 |
| 5.446 | 0.137 |
| 5.447 | 0.136 |
| 5.448 | 0.134 |
| 5.449 | 0.133 |
| 5.45 | 0.132 |
| 5.451 | 0.131 |
| 5.452 | 0.13 |
| 5.453 | 0.128 |
| 5.454 | 0.127 |
| 5.455 | 0.126 |
| 5.456 | 0.125 |
| 5.457 | 0.124 |
| 5.458 | 0.123 |
| 5.459 | 0.122 |
| 5.46 | 0.121 |
| 5.461 | 0.119 |
| 5.462 | 0.118 |
| 5.463 | 0.117 |
| 5.464 | 0.116 |
| 5.465 | 0.115 |
| 5.466 | 0.114 |
| 5.467 | 0.113 |
| 5.468 | 0.112 |
| 5.469 | 0.111 |
| 5.47 | 0.11 |
| 5.471 | 0.109 |
| 5.472 | 0.108 |
| 5.473 | 0.107 |
| 5.474 | 0.106 |
| 5.475 | 0.105 |
| 5.476 | 0.104 |
| 5.477 | 0.103 |
| 5.478 | 0.102 |
| 5.479 | 0.101 |
| 5.48 | 0.1 |
| 5.481 | 0.099 |
| 5.482 | 0.098 |
| 5.483 | 0.097 |
| 5.484 | 0.096 |
| 5.485 | 0.095 |
| 5.486 | 0.094 |
| 5.487 | 0.093 |
| 5.488 | 0.092 |
| 5.489 | 0.092 |
| 5.49 | 0.091 |
| 5.491 | 0.09 |
| 5.492 | 0.089 |
| 5.493 | 0.088 |
| 5.494 | 0.087 |
| 5.495 | 0.086 |
| 5.496 | 0.085 |
| 5.497 | 0.085 |
| 5.498 | 0.084 |
| 5.499 | 0.083 |
| 5.5 | 0.082 |
| 5.501 | 0.081 |
| 5.502 | 0.08 |
| 5.503 | 0.08 |
| 5.504 | 0.079 |
| 5.505 | 0.078 |
| 5.506 | 0.077 |
| 5.507 | 0.076 |
| 5.508 | 0.076 |
| 5.509 | 0.075 |
| 5.51 | 0.074 |
| 5.511 | 0.073 |
| 5.512 | 0.073 |
| 5.513 | 0.072 |
| 5.514 | 0.071 |
| 5.515 | 0.07 |
| 5.516 | 0.07 |
| 5.517 | 0.069 |
| 5.518 | 0.068 |
| 5.519 | 0.068 |
| 5.52 | 0.067 |
| 5.521 | 0.066 |
| 5.522 | 0.066 |
| 5.523 | 0.065 |
| 5.524 | 0.064 |
| 5.525 | 0.064 |
| 5.526 | 0.063 |
| 5.527 | 0.062 |
| 5.528 | 0.062 |
| 5.529 | 0.061 |
| 5.53 | 0.06 |
| 5.531 | 0.06 |
| 5.532 | 0.059 |
| 5.533 | 0.058 |
| 5.534 | 0.058 |
| 5.535 | 0.057 |
| 5.536 | 0.057 |
| 5.537 | 0.056 |
| 5.538 | 0.055 |
| 5.539 | 0.055 |
| 5.54 | 0.054 |
| 5.541 | 0.054 |
| 5.542 | 0.053 |
| 5.543 | 0.052 |
| 5.544 | 0.052 |
| 5.545 | 0.051 |
| 5.546 | 0.051 |
| 5.547 | 0.05 |
| 5.548 | 0.05 |
| 5.549 | 0.049 |
| 5.55 | 0.049 |
| 5.551 | 0.048 |
| 5.552 | 0.047 |
| 5.553 | 0.047 |
| 5.554 | 0.046 |
| 5.555 | 0.046 |
| 5.556 | 0.045 |
| 5.557 | 0.045 |
| 5.558 | 0.044 |
| 5.559 | 0.044 |
| 5.56 | 0.043 |
| 5.561 | 0.043 |
| 5.562 | 0.042 |
| 5.563 | 0.042 |
| 5.564 | 0.042 |
| 5.565 | 0.041 |
| 5.566 | 0.041 |
| 5.567 | 0.04 |
| 5.568 | 0.04 |
| 5.569 | 0.039 |
| 5.57 | 0.039 |
| 5.571 | 0.038 |
| 5.572 | 0.038 |
| 5.573 | 0.038 |
| 5.574 | 0.037 |
| 5.575 | 0.037 |
| 5.576 | 0.036 |
| 5.577 | 0.036 |
| 5.578 | 0.035 |
| 5.579 | 0.035 |
| 5.58 | 0.035 |
| 5.581 | 0.034 |
| 5.582 | 0.034 |
| 5.583 | 0.033 |
| 5.584 | 0.033 |
| 5.585 | 0.033 |
| 5.586 | 0.032 |
| 5.587 | 0.032 |
| 5.588 | 0.032 |
| 5.589 | 0.031 |
| 5.59 | 0.031 |
| 5.591 | 0.03 |
| 5.592 | 0.03 |
| 5.593 | 0.03 |
| 5.594 | 0.029 |
| 5.595 | 0.029 |
| 5.596 | 0.029 |
| 5.597 | 0.028 |
| 5.598 | 0.028 |
| 5.599 | 0.028 |
| 5.6 | 0.027 |
| 5.601 | 0.027 |
| 5.602 | 0.027 |
| 5.603 | 0.026 |
| 5.604 | 0.026 |
| 5.605 | 0.026 |
| 5.606 | 0.025 |
| 5.607 | 0.025 |
| 5.608 | 0.025 |
| 5.609 | 0.025 |
| 5.61 | 0.024 |
| 5.611 | 0.024 |
| 5.612 | 0.024 |
| 5.613 | 0.023 |
| 5.614 | 0.023 |
| 5.615 | 0.023 |
| 5.616 | 0.022 |
| 5.617 | 0.022 |
| 5.618 | 0.022 |
| 5.619 | 0.022 |
| 5.62 | 0.021 |
| 5.621 | 0.021 |
| 5.622 | 0.021 |
| 5.623 | 0.021 |
| 5.624 | 0.02 |
| 5.625 | 0.02 |
| 5.626 | 0.02 |
| 5.627 | 0.02 |
| 5.628 | 0.019 |
| 5.628999999999999 | 0.019 |
| 5.63 | 0.019 |
| 5.631 | 0.019 |
| 5.632 | 0.018 |
| 5.633 | 0.018 |
| 5.634 | 0.018 |
| 5.635 | 0.018 |
| 5.636 | 0.018 |
| 5.636999999999999 | 0.017 |
| 5.638 | 0.017 |
| 5.639 | 0.017 |
| 5.64 | 0.017 |
| 5.641 | 0.016 |
| 5.642 | 0.016 |
| 5.643 | 0.016 |
| 5.644 | 0.016 |
| 5.644999999999999 | 0.016 |
| 5.646 | 0.015 |
| 5.647 | 0.015 |
| 5.648 | 0.015 |
| 5.649 | 0.015 |
| 5.65 | 0.015 |
| 5.651 | 0.014 |
| 5.652 | 0.014 |
| 5.652999999999999 | 0.014 |
| 5.654 | 0.014 |
| 5.655 | 0.014 |
| 5.656 | 0.014 |
| 5.657 | 0.013 |
| 5.658 | 0.013 |
| 5.659 | 0.013 |
| 5.66 | 0.013 |
| 5.660999999999999 | 0.013 |
| 5.662 | 0.012 |
| 5.663 | 0.012 |
| 5.664 | 0.012 |
| 5.665 | 0.012 |
| 5.666 | 0.012 |
| 5.667 | 0.012 |
| 5.668 | 0.012 |
| 5.668999999999999 | 0.011 |
| 5.67 | 0.011 |
| 5.671 | 0.011 |
| 5.672 | 0.011 |
| 5.673 | 0.011 |
| 5.674 | 0.011 |
| 5.675 | 0.011 |
| 5.676 | 0.01 |
| 5.677 | 0.01 |
| 5.678 | 0.01 |
| 5.679 | 0.01 |
| 5.68 | 0.01 |
| 5.681 | 0.01 |
| 5.682 | 0.01 |
| 5.683 | 0.009 |
| 5.684 | 0.009 |
| 5.685 | 0.009 |
| 5.686 | 0.009 |
| 5.687 | 0.009 |
| 5.688 | 0.009 |
| 5.689 | 0.009 |
| 5.69 | 0.009 |
| 5.691 | 0.008 |
| 5.692 | 0.008 |
| 5.693 | 0.008 |
| 5.694 | 0.008 |
| 5.695 | 0.008 |
| 5.696 | 0.008 |
| 5.697 | 0.008 |
| 5.698 | 0.008 |
| 5.699 | 0.008 |
| 5.7 | 0.007 |
| 5.701 | 0.007 |
| 5.702 | 0.007 |
| 5.703 | 0.007 |
| 5.704 | 0.007 |
| 5.705 | 0.007 |
| 5.706 | 0.007 |
| 5.707 | 0.007 |
| 5.708 | 0.007 |
| 5.709 | 0.007 |
| 5.71 | 0.006 |
| 5.711 | 0.006 |
| 5.712 | 0.006 |
| 5.713 | 0.006 |
| 5.714 | 0.006 |
| 5.715 | 0.006 |
| 5.716 | 0.006 |
| 5.717 | 0.006 |
| 5.718 | 0.006 |
| 5.719 | 0.006 |
| 5.72 | 0.006 |
| 5.721 | 0.006 |
| 5.722 | 0.005 |
| 5.723 | 0.005 |
| 5.724 | 0.005 |
| 5.725 | 0.005 |
| 5.726 | 0.005 |
| 5.727 | 0.005 |
| 5.728 | 0.005 |
| 5.729 | 0.005 |
| 5.73 | 0.005 |
| 5.731 | 0.005 |
| 5.732 | 0.005 |
| 5.733 | 0.005 |
| 5.734 | 0.005 |
| 5.735 | 0.005 |
| 5.736 | 0.004 |
| 5.737 | 0.004 |
| 5.738 | 0.004 |
| 5.739 | 0.004 |
| 5.74 | 0.004 |
| 5.741 | 0.004 |
| 5.742 | 0.004 |
| 5.743 | 0.004 |
| 5.744 | 0.004 |
| 5.745 | 0.004 |
| 5.746 | 0.004 |
| 5.747 | 0.004 |
| 5.748 | 0.004 |
| 5.749 | 0.004 |
| 5.75 | 0.004 |
| 5.751 | 0.004 |
| 5.752 | 0.003 |
| 5.753 | 0.003 |
| 5.753999999999999 | 0.003 |
| 5.755 | 0.003 |
| 5.756 | 0.003 |
| 5.757 | 0.003 |
| 5.758 | 0.003 |
| 5.759 | 0.003 |
| 5.76 | 0.003 |
| 5.761 | 0.003 |
| 5.761999999999999 | 0.003 |
| 5.763 | 0.003 |
| 5.764 | 0.003 |
| 5.765 | 0.003 |
| 5.766 | 0.003 |
| 5.767 | 0.003 |
| 5.768 | 0.003 |
| 5.769 | 0.003 |
| 5.769999999999999 | 0.003 |
| 5.771 | 0.003 |
| 5.772 | 0.003 |
| 5.773 | 0.003 |
| 5.774 | 0.003 |
| 5.775 | 0.002 |
| 5.776 | 0.002 |
| 5.777 | 0.002 |
| 5.778 | 0.002 |
| 5.779 | 0.002 |
| 5.78 | 0.002 |
| 5.781 | 0.002 |
| 5.782 | 0.002 |
| 5.783 | 0.002 |
| 5.784 | 0.002 |
| 5.785 | 0.002 |
| 5.786 | 0.002 |
| 5.787 | 0.002 |
| 5.788 | 0.002 |
| 5.789 | 0.002 |
| 5.79 | 0.002 |
| 5.791 | 0.002 |
| 5.792 | 0.002 |
| 5.793 | 0.002 |
| 5.794 | 0.002 |
| 5.795 | 0.002 |
| 5.796 | 0.002 |
| 5.797 | 0.002 |
| 5.798 | 0.002 |
| 5.799 | 0.002 |
| 5.8 | 0.002 |
| 5.801 | 0.002 |
| 5.802 | 0.002 |
| 5.803 | 0.002 |
| 5.804 | 0.002 |
| 5.805 | 0.002 |
| 5.806 | 0.002 |
| 5.807 | 0.001 |
| 5.808 | 0.001 |
| 5.809 | 0.001 |
| 5.81 | 0.001 |
| 5.811 | 0.001 |
| 5.812 | 0.001 |
| 5.813 | 0.001 |
| 5.814 | 0.001 |
| 5.815 | 0.001 |
| 5.816 | 0.001 |
| 5.817 | 0.001 |
| 5.818 | 0.001 |
| 5.819 | 0.001 |
| 5.82 | 0.001 |
| 5.821 | 0.001 |
| 5.822 | 0.001 |
| 5.823 | 0.001 |
| 5.824 | 0.001 |
| 5.825 | 0.001 |
| 5.826 | 0.001 |
| 5.827 | 0.001 |
| 5.828 | 0.001 |
| 5.829 | 0.001 |
| 5.83 | 0.001 |
| 5.831 | 0.001 |
| 5.832 | 0.001 |
| 5.833 | 0.001 |
| 5.834 | 0.001 |
| 5.835 | 0.001 |
| 5.836 | 0.001 |
| 5.837 | 0.001 |
| 5.838 | 0.001 |
| 5.839 | 0.001 |
| 5.84 | 0.001 |
| 5.841 | 0.001 |
| 5.842 | 0.001 |
| 5.843 | 0.001 |
| 5.844 | 0.001 |
| 5.845 | 0.001 |
| 5.846 | 0.001 |
| 5.847 | 0.001 |
| 5.848 | 0.001 |
| 5.849 | 0.001 |
| 5.85 | 0.001 |
| 5.851 | 0.001 |
| 5.852 | 0.001 |
| 5.853 | 0.001 |
| 5.854 | 0.001 |
| 5.855 | 0.001 |
| 5.856 | 0.001 |
| 5.857 | 0.001 |
| 5.858 | 0.001 |
| 5.859 | 0.001 |
| 5.86 | 0.001 |
| 5.861 | 0.001 |
| 5.862 | 0.001 |
| 5.863 | 0.001 |
| 5.864 | 0.001 |
| 5.865 | 0.001 |
| 5.866 | 0.001 |
| 5.867 | 0.001 |
| 5.868 | 0.001 |
| 5.869 | 0.001 |
| 5.87 | 0.001 |
| 5.871 | 0.001 |
| 5.872 | 0 |
| 5.873 | 0 |
| 5.874 | 0 |
| 5.875 | 0 |
| 5.876 | 0 |
| 5.877 | 0 |
| 5.878 | 0 |
| 5.879 | 0 |
| 5.88 | 0 |
| 5.881 | 0 |
| 5.882 | 0 |
| 5.883 | 0 |
| 5.884 | 0 |
| 5.885 | 0 |
| 5.886 | 0 |
| 5.887 | 0 |
| 5.888 | 0 |
| 5.889 | 0 |
| 5.89 | 0 |
| 5.891 | 0 |
| 5.892 | 0 |
| 5.893 | 0 |
| 5.894 | 0 |
| 5.895 | 0 |
| 5.896 | 0 |
| 5.897 | 0 |
| 5.898 | 0 |
| 5.899 | 0 |
| 5.9 | 0 |
| 5.901 | 0 |
| 5.902 | 0 |
| 5.903 | 0 |
| 5.904 | 0 |
| 5.905 | 0 |
| 5.906 | 0 |
| 5.907 | 0 |
| 5.908 | 0 |
| 5.909 | 0 |
| 5.91 | 0 |
| 5.911 | 0 |
| 5.912 | 0 |
| 5.913 | 0 |
| 5.914 | 0 |
| 5.915 | 0 |
| 5.916 | 0 |
| 5.917 | 0 |
| 5.918 | 0 |
| 5.919 | 0 |
| 5.92 | 0 |
| 5.921 | 0 |
| 5.922 | 0 |
| 5.923 | 0 |
| 5.924 | 0 |
| 5.925 | 0 |
| 5.926 | 0 |
| 5.927 | 0 |
| 5.928 | 0 |
| 5.929 | 0 |
| 5.93 | 0 |
| 5.931 | 0 |
| 5.932 | 0 |
| 5.933 | 0 |
| 5.934 | 0 |
| 5.935 | 0 |
| 5.936 | 0 |
| 5.937 | 0 |
| 5.938 | 0 |
| 5.939 | 0 |
| 5.94 | 0 |
| 5.941 | 0 |
| 5.942 | 0 |
| 5.943 | 0 |
| 5.944 | 0 |
| 5.945 | 0 |
| 5.946 | 0 |
| 5.947 | 0 |
| 5.948 | 0 |
| 5.949 | 0 |
| 5.95 | 0 |
| 5.951 | 0 |
| 5.952 | 0 |
| 5.953 | 0 |
| 5.954 | 0 |
| 5.955 | 0 |
| 5.956 | 0 |
| 5.957 | 0 |
| 5.958 | 0 |
| 5.959 | 0 |
| 5.96 | 0 |
| 5.961 | 0 |
| 5.962 | 0 |
| 5.963 | 0 |
| 5.964 | 0 |
| 5.965 | 0 |
| 5.966 | 0 |
| 5.967 | 0 |
| 5.968 | 0 |
| 5.969 | 0 |
| 5.97 | 0 |
| 5.971 | 0 |
| 5.972 | 0 |
| 5.973 | 0 |
| 5.974 | 0 |
| 5.975 | 0 |
| 5.976 | 0 |
| 5.977 | 0 |
| 5.978 | 0 |
| 5.979 | 0 |
| 5.98 | 0 |
| 5.981 | 0 |
| 5.982 | 0 |
| 5.983 | 0 |
| 5.984 | 0 |
| 5.985 | 0 |
| 5.986 | 0 |
| 5.987 | 0 |
| 5.988 | 0 |
| 5.989 | 0 |
| 5.99 | 0 |
| 5.991 | 0 |
| 5.992 | 0 |
| 5.993 | 0 |
| 5.994 | 0 |
| 5.995 | 0 |
| 5.996 | 0 |
| 5.997 | 0 |
| 5.998 | 0 |
| 5.999 | 0 |
| 6.0 | 0 |
| 6.001 | 0 |
| 6.002 | 0 |
| 6.003 | 0 |
| 6.004 | 0 |
| 6.005 | 0 |
| 6.006 | 0 |
| 6.007 | 0 |
| 6.008 | 0 |
| 6.009 | 0 |
| 6.01 | 0 |
| 6.011 | 0 |
| 6.012 | 0 |
| 6.013 | 0 |
| 6.014 | 0 |
| 6.015 | 0 |
| 6.016 | 0 |
| 6.017 | 0 |
| 6.018 | 0 |
| 6.019 | 0 |
| 6.02 | 0 |
| 6.021 | 0 |
| 6.022 | 0 |
| 6.023 | 0 |
| 6.024 | 0 |
| 6.025 | 0 |
| 6.026 | 0 |
| 6.027 | 0 |
| 6.028 | 0 |
| 6.029 | 0 |
| 6.03 | 0 |
| 6.031 | 0 |
| 6.032 | 0 |
| 6.033 | 0 |
| 6.034 | 0 |
| 6.035 | 0 |
| 6.036 | 0 |
| 6.037 | 0 |
| 6.038 | 0 |
| 6.039 | 0 |
| 6.04 | 0 |
| 6.041 | 0 |
| 6.042 | 0 |
| 6.043 | 0 |
| 6.044 | 0 |
| 6.045 | 0 |
| 6.046 | 0 |
| 6.047 | 0 |
| 6.048 | 0 |
| 6.049 | 0 |
| 6.05 | 0 |
| 6.051 | 0 |
| 6.052 | 0 |
| 6.053 | 0 |
| 6.054 | 0 |
| 6.055 | 0 |
| 6.056 | 0 |
| 6.057 | 0 |
| 6.058 | 0 |
| 6.059 | 0 |
| 6.06 | 0 |
| 6.061 | 0 |
| 6.062 | 0 |
| 6.063 | 0 |
| 6.064 | 0 |
| 6.065 | 0 |
| 6.066 | 0 |
| 6.067 | 0 |
| 6.068 | 0 |
| 6.069 | 0 |
| 6.07 | 0 |
| 6.071 | 0 |
| 6.072 | 0 |
| 6.073 | 0 |
| 6.074 | 0 |
| 6.075 | 0 |
| 6.076 | 0 |
| 6.077 | 0 |
| 6.078 | 0 |
| 6.079 | 0 |
| 6.08 | 0 |
| 6.081 | 0 |
| 6.082 | 0 |
| 6.083 | 0 |
| 6.084 | 0 |
| 6.085 | 0 |
| 6.086 | 0 |
| 6.087 | 0 |
| 6.088 | 0 |
| 6.089 | 0 |
| 6.09 | 0 |
| 6.091 | 0 |
| 6.092 | 0 |
| 6.093 | 0 |
| 6.094 | 0 |
| 6.095 | 0 |
| 6.096 | 0 |
| 6.097 | 0 |
| 6.098 | 0 |
| 6.099 | 0 |
| 6.1 | 0 |
| 6.101 | 0 |
| 6.102 | 0 |
| 6.103 | 0 |
| 6.104 | 0 |
| 6.105 | 0 |
| 6.106 | 0 |
| 6.107 | 0 |
| 6.108 | 0 |
| 6.109 | 0 |
| 6.11 | 0 |
| 6.111 | 0 |
| 6.112 | 0 |
| 6.113 | 0 |
| 6.114 | 0 |
| 6.115 | 0 |
| 6.116 | 0 |
| 6.117 | 0 |
| 6.118 | 0 |
| 6.119 | 0 |
| 6.12 | 0 |
| 6.121 | 0 |
| 6.122 | 0 |
| 6.123 | 0 |
| 6.124 | 0 |
| 6.125 | 0 |
| 6.126 | 0 |
| 6.127 | 0 |
| 6.128 | 0 |
| 6.129 | 0 |
| 6.13 | 0 |
| 6.131 | 0 |
| 6.132 | 0 |
| 6.133 | 0 |
| 6.134 | 0 |
| 6.135 | 0 |
| 6.136 | 0 |
| 6.137 | 0 |
| 6.138 | 0 |
| 6.139 | 0 |
| 6.14 | 0 |
| 6.141 | 0 |
| 6.142 | 0 |
| 6.143 | 0 |
| 6.144 | 0 |
| 6.145 | 0 |
| 6.146 | 0 |
| 6.147 | 0 |
| 6.148 | 0 |
| 6.149 | 0 |
| 6.15 | 0 |
| 6.151 | 0 |
| 6.152 | 0 |
| 6.153 | 0 |
| 6.154 | 0 |
| 6.155 | 0 |
| 6.156 | 0 |
| 6.157 | 0 |
| 6.158 | 0 |
| 6.159 | 0 |
| 6.16 | 0 |
| 6.161 | 0 |
| 6.162 | 0 |
| 6.163 | 0 |
| 6.164 | 0 |
| 6.165 | 0 |
| 6.166 | 0 |
| 6.167 | 0 |
| 6.168 | 0 |
| 6.169 | 0 |
| 6.17 | 0 |
| 6.171 | 0 |
| 6.172 | 0 |
| 6.173 | 0 |
| 6.174 | 0 |
| 6.175 | 0 |
| 6.176 | 0 |
| 6.177 | 0 |
| 6.178 | 0 |
| 6.179 | 0 |
| 6.18 | 0 |
| 6.181 | 0 |
| 6.182 | 0 |
| 6.183 | 0 |
| 6.184 | 0 |
| 6.185 | 0 |
| 6.186 | 0 |
| 6.187 | 0 |
| 6.188 | 0 |
| 6.189 | 0 |
| 6.19 | 0 |
| 6.191 | 0 |
| 6.192 | 0 |
| 6.193 | 0 |
| 6.194 | 0 |
| 6.195 | 0 |
| 6.196 | 0 |
| 6.197 | 0 |
| 6.198 | 0 |
| 6.199 | 0 |
| 6.2 | 0 |
| 6.201 | 0 |
| 6.202 | 0 |
| 6.203 | 0 |
| 6.204 | 0 |
| 6.205 | 0 |
| 6.206 | 0 |
| 6.207 | 0 |
| 6.208 | 0 |
| 6.209 | 0 |
| 6.21 | 0 |
| 6.211 | 0 |
| 6.212 | 0 |
| 6.213 | 0 |
| 6.214 | 0 |
| 6.215 | 0 |
| 6.216 | 0 |
| 6.217 | 0 |
| 6.218 | 0 |
| 6.219 | 0 |
| 6.22 | 0 |
| 6.221 | 0 |
| 6.222 | 0 |
| 6.223 | 0 |
| 6.224 | 0 |
| 6.225 | 0 |
| 6.226 | 0 |
| 6.227 | 0 |
| 6.228 | 0 |
| 6.229 | 0 |
| 6.23 | 0 |
| 6.231 | 0 |
| 6.232 | 0 |
| 6.233 | 0 |
| 6.234 | 0 |
| 6.235 | 0 |
| 6.236 | 0 |
| 6.237 | 0 |
| 6.238 | 0 |
| 6.239 | 0 |
| 6.24 | 0 |
| 6.241 | 0 |
| 6.242 | 0 |
| 6.243 | 0 |
| 6.244 | 0 |
| 6.245 | 0 |
| 6.246 | 0 |
| 6.247 | 0 |
| 6.248 | 0 |
| 6.249 | 0 |
| 6.25 | 0 |
| 6.251 | 0 |
| 6.252 | 0 |
| 6.253 | 0 |
| 6.254 | 0 |
| 6.255 | 0 |
| 6.256 | 0 |
| 6.257 | 0 |
| 6.258 | 0 |
| 6.259 | 0 |
| 6.26 | 0 |
| 6.261 | 0 |
| 6.262 | 0 |
| 6.263 | 0 |
| 6.264 | 0 |
| 6.265 | 0 |
| 6.266 | 0 |
| 6.267 | 0 |
| 6.268 | 0 |
| 6.269 | 0 |
| 6.27 | 0 |
| 6.271 | 0 |
| 6.272 | 0 |
| 6.273 | 0 |
| 6.274 | 0 |
| 6.275 | 0 |
| 6.276 | 0 |
| 6.277 | 0 |
| 6.278 | 0 |
| 6.279 | 0 |
| 6.28 | 0 |
| 6.281 | 0 |
| 6.282 | 0 |
| 6.283 | 0 |
| 6.284 | 0 |
| 6.285 | 0 |
| 6.286 | 0 |
| 6.287 | 0 |
| 6.288 | 0 |
| 6.289 | 0 |
| 6.29 | 0 |
| 6.291 | 0 |
| 6.292 | 0 |
| 6.293 | 0 |
| 6.294 | 0 |
| 6.295 | 0 |
| 6.296 | 0 |
| 6.297 | 0 |
| 6.298 | 0 |
| 6.299 | 0 |
| 6.3 | 0 |
| 6.301 | 0 |
| 6.302 | 0 |
| 6.303 | 0 |
| 6.304 | 0 |
| 6.305 | 0 |
| 6.306 | 0 |
| 6.307 | 0 |
| 6.308 | 0 |
| 6.309 | 0 |
| 6.31 | 0 |
| 6.311 | 0 |
| 6.312 | 0 |
| 6.313 | 0 |
| 6.314 | 0 |
| 6.315 | 0 |
| 6.316 | 0 |
| 6.317 | 0 |
| 6.318 | 0 |
| 6.319 | 0 |
| 6.32 | 0 |
| 6.321 | 0 |
| 6.322 | 0 |
| 6.323 | 0 |
| 6.324 | 0 |
| 6.325 | 0 |
| 6.326 | 0 |
| 6.327 | 0 |
| 6.328 | 0 |
| 6.329 | 0 |
| 6.33 | 0 |
| 6.331 | 0 |
| 6.332 | 0 |
| 6.333 | 0 |
| 6.334 | 0 |
| 6.335 | 0 |
| 6.336 | 0 |
| 6.337 | 0 |
| 6.338 | 0 |
| 6.339 | 0 |
| 6.34 | 0 |
| 6.341 | 0 |
| 6.342 | 0 |
| 6.343 | 0 |
| 6.344 | 0 |
| 6.345 | 0 |
| 6.346 | 0 |
| 6.347 | 0 |
| 6.348 | 0 |
| 6.349 | 0 |
| 6.35 | 0 |
| 6.351 | 0 |
| 6.352 | 0 |
| 6.353 | 0 |
| 6.354 | 0 |
| 6.355 | 0 |
| 6.356 | 0 |
| 6.357 | 0 |
| 6.358 | 0 |
| 6.359 | 0 |
| 6.36 | 0 |
| 6.361 | 0 |
| 6.362 | 0 |
| 6.363 | 0 |
| 6.364 | 0 |
| 6.365 | 0 |
| 6.366 | 0 |
| 6.367 | 0 |
| 6.368 | 0 |
| 6.369 | 0 |
| 6.37 | 0 |
| 6.371 | 0 |
| 6.372 | 0 |
| 6.373 | 0 |
| 6.374 | 0 |
| 6.375 | 0 |
| 6.376 | 0 |
| 6.377 | 0 |
| 6.378 | 0 |
| 6.379 | 0 |
| 6.38 | 0 |
| 6.381 | 0 |
| 6.382 | 0 |
| 6.383 | 0 |
| 6.384 | 0 |
| 6.385 | 0 |
| 6.386 | 0 |
| 6.387 | 0 |
| 6.388 | 0 |
| 6.389 | 0 |
| 6.39 | 0 |
| 6.391 | 0 |
| 6.392 | 0 |
| 6.393 | 0 |
| 6.394 | 0 |
| 6.395 | 0 |
| 6.396 | 0 |
| 6.397 | 0 |
| 6.398 | 0 |
| 6.399 | 0 |
| 6.4 | 0 |
| 6.401 | 0 |
| 6.402 | 0 |
| 6.403 | 0 |
| 6.404 | 0 |
| 6.405 | 0 |
| 6.406 | 0 |
| 6.407 | 0 |
| 6.408 | 0 |
| 6.409 | 0 |
| 6.41 | 0 |
| 6.411 | 0 |
| 6.412 | 0 |
| 6.413 | 0 |
| 6.414 | 0 |
| 6.415 | 0 |
| 6.416 | 0 |
| 6.417 | 0 |
| 6.418 | 0 |
| 6.419 | 0 |
| 6.42 | 0 |
| 6.421 | 0 |
| 6.422 | 0 |
| 6.423 | 0 |
| 6.424 | 0 |
| 6.425 | 0 |
| 6.426 | 0 |
| 6.427 | 0 |
| 6.428 | 0 |
| 6.429 | 0 |
| 6.43 | 0 |
| 6.431 | 0 |
| 6.432 | 0 |
| 6.433 | 0 |
| 6.434 | 0 |
| 6.435 | 0 |
| 6.436 | 0 |
| 6.437 | 0 |
| 6.438 | 0 |
| 6.439 | 0 |
| 6.44 | 0 |
| 6.441 | 0 |
| 6.442 | 0 |
| 6.443 | 0 |
| 6.444 | 0 |
| 6.445 | 0 |
| 6.446 | 0 |
| 6.447 | 0 |
| 6.448 | 0 |
| 6.449 | 0 |
| 6.45 | 0 |
| 6.451 | 0 |
| 6.452 | 0 |
| 6.453 | 0 |
| 6.454 | 0 |
| 6.455 | 0 |
| 6.456 | 0 |
| 6.457 | 0 |
| 6.458 | 0 |
| 6.459 | 0 |
| 6.46 | 0 |
| 6.461 | 0 |
| 6.462 | 0 |
| 6.463 | 0 |
| 6.464 | 0 |
| 6.465 | 0 |
| 6.466 | 0 |
| 6.467 | 0 |
| 6.468 | 0 |
| 6.469 | 0 |
| 6.47 | 0 |
| 6.471 | 0 |
| 6.472 | 0 |
| 6.473 | 0 |
| 6.474 | 0 |
| 6.475 | 0 |
| 6.476 | 0 |
| 6.477 | 0 |
| 6.478 | 0 |
| 6.479 | 0 |
| 6.48 | 0 |
| 6.481 | 0 |
| 6.482 | 0 |
| 6.483 | 0 |
| 6.484 | 0 |
| 6.485 | 0 |
| 6.486 | 0 |
| 6.487 | 0 |
| 6.488 | 0 |
| 6.489 | 0 |
| 6.49 | 0 |
| 6.491 | 0 |
| 6.492 | 0 |
| 6.493 | 0 |
| 6.494 | 0 |
| 6.495 | 0 |
| 6.496 | 0 |
| 6.497 | 0 |
| 6.498 | 0 |
| 6.499 | 0 |
| 6.5 | 0 |
| 6.501 | 0 |
| 6.502 | 0 |
| 6.503 | 0 |
| 6.504 | 0 |
| 6.505 | 0 |
| 6.506 | 0 |
| 6.507 | 0 |
| 6.508 | 0 |
| 6.509 | 0 |
| 6.51 | 0 |
| 6.511 | 0 |
| 6.512 | 0 |
| 6.513 | 0 |
| 6.514 | 0 |
| 6.515 | 0 |
| 6.516 | 0 |
| 6.517 | 0 |
| 6.518 | 0 |
| 6.519 | 0 |
| 6.52 | 0 |
| 6.521 | 0 |
| 6.522 | 0 |
| 6.523 | 0 |
| 6.524 | 0 |
| 6.525 | 0 |
| 6.526 | 0 |
| 6.527 | 0 |
| 6.528 | 0 |
| 6.529 | 0 |
| 6.53 | 0 |
| 6.531 | 0 |
| 6.532 | 0 |
| 6.533 | 0 |
| 6.534 | 0 |
| 6.535 | 0 |
| 6.536 | 0 |
| 6.537 | 0 |
| 6.538 | 0 |
| 6.539 | 0 |
| 6.54 | 0 |
| 6.541 | 0 |
| 6.542 | 0 |
| 6.543 | 0 |
| 6.544 | 0 |
| 6.545 | 0 |
| 6.546 | 0 |
| 6.547 | 0 |
| 6.548 | 0 |
| 6.549 | 0 |
| 6.55 | 0 |
| 6.551 | 0 |
| 6.552 | 0 |
| 6.553 | 0 |
| 6.554 | 0 |
| 6.555 | 0 |
| 6.556 | 0 |
| 6.557 | 0 |
| 6.558 | 0 |
| 6.559 | 0 |
| 6.56 | 0 |
| 6.561 | 0 |
| 6.562 | 0 |
| 6.563 | 0 |
| 6.564 | 0 |
| 6.565 | 0 |
| 6.566 | 0 |
| 6.567 | 0 |
| 6.568 | 0 |
| 6.569 | 0 |
| 6.57 | 0 |
| 6.571 | 0 |
| 6.572 | 0 |
| 6.573 | 0 |
| 6.574 | 0 |
| 6.575 | 0 |
| 6.576 | 0 |
| 6.577 | 0 |
| 6.578 | 0 |
| 6.579 | 0 |
| 6.58 | 0 |
| 6.581 | 0 |
| 6.582 | 0 |
| 6.583 | 0 |
| 6.584 | 0 |
| 6.585 | 0 |
| 6.586 | 0 |
| 6.587 | 0 |
| 6.588 | 0 |
| 6.589 | 0 |
| 6.59 | 0 |
| 6.591 | 0 |
| 6.592 | 0 |
| 6.593 | 0 |
| 6.594 | 0 |
| 6.595 | 0 |
| 6.596 | 0 |
| 6.597 | 0 |
| 6.598 | 0 |
| 6.599 | 0 |
| 6.6 | 0 |
| 6.601 | 0 |
| 6.602 | 0 |
| 6.603 | 0 |
| 6.604 | 0 |
| 6.605 | 0 |
| 6.606 | 0 |
| 6.607 | 0 |
| 6.608 | 0 |
| 6.609 | 0 |
| 6.61 | 0 |
| 6.611 | 0 |
| 6.612 | 0 |
| 6.613 | 0 |
| 6.614 | 0 |
| 6.615 | 0 |
| 6.616 | 0 |
| 6.617 | 0 |
| 6.618 | 0 |
| 6.619 | 0 |
| 6.62 | 0 |
| 6.621 | 0 |
| 6.622 | 0 |
| 6.623 | 0 |
| 6.624 | 0 |
| 6.625 | 0 |
| 6.626 | 0 |
| 6.627 | 0 |
| 6.628 | 0 |
| 6.628999999999999 | 0 |
| 6.63 | 0 |
| 6.631 | 0 |
| 6.632 | 0 |
| 6.633 | 0 |
| 6.634 | 0 |
| 6.635 | 0 |
| 6.636 | 0 |
| 6.636999999999999 | 0 |
| 6.638 | 0 |
| 6.639 | 0 |
| 6.64 | 0 |
| 6.641 | 0 |
| 6.642 | 0 |
| 6.643 | 0 |
| 6.644 | 0 |
| 6.644999999999999 | 0 |
| 6.646 | 0 |
| 6.647 | 0 |
| 6.648 | 0 |
| 6.649 | 0 |
| 6.65 | 0 |
| 6.651 | 0 |
| 6.652 | 0 |
| 6.652999999999999 | 0 |
| 6.654 | 0 |
| 6.655 | 0 |
| 6.656 | 0 |
| 6.657 | 0 |
| 6.658 | 0 |
| 6.659 | 0 |
| 6.66 | 0 |
| 6.660999999999999 | 0 |
| 6.662 | 0 |
| 6.663 | 0 |
| 6.664 | 0 |
| 6.665 | 0 |
| 6.666 | 0 |
| 6.667 | 0 |
| 6.668 | 0 |
| 6.668999999999999 | 0 |
| 6.67 | 0 |
| 6.671 | 0 |
| 6.672 | 0 |
| 6.673 | 0 |
| 6.674 | 0 |
| 6.675 | 0 |
| 6.676 | 0 |
| 6.677 | 0 |
| 6.678 | 0 |
| 6.679 | 0 |
| 6.68 | 0 |
| 6.681 | 0 |
| 6.682 | 0 |
| 6.683 | 0 |
| 6.684 | 0 |
| 6.685 | 0 |
| 6.686 | 0 |
| 6.687 | 0 |
| 6.688 | 0 |
| 6.689 | 0 |
| 6.69 | 0 |
| 6.691 | 0 |
| 6.692 | 0 |
| 6.693 | 0 |
| 6.694 | 0 |
| 6.695 | 0 |
| 6.696 | 0 |
| 6.697 | 0 |
| 6.698 | 0 |
| 6.699 | 0 |
| 6.7 | 0 |
| 6.701 | 0 |
| 6.702 | 0 |
| 6.703 | 0 |
| 6.704 | 0 |
| 6.705 | 0 |
| 6.706 | 0 |
| 6.707 | 0 |
| 6.708 | 0 |
| 6.709 | 0 |
| 6.71 | 0 |
| 6.711 | 0 |
| 6.712 | 0 |
| 6.713 | 0 |
| 6.714 | 0 |
| 6.715 | 0 |
| 6.716 | 0 |
| 6.717 | 0 |
| 6.718 | 0 |
| 6.719 | 0 |
| 6.72 | 0 |
| 6.721 | 0 |
| 6.722 | 0 |
| 6.723 | 0 |
| 6.724 | 0 |
| 6.725 | 0 |
| 6.726 | 0 |
| 6.727 | 0 |
| 6.728 | 0 |
| 6.729 | 0 |
| 6.73 | 0 |
| 6.731 | 0 |
| 6.732 | 0 |
| 6.733 | 0 |
| 6.734 | 0 |
| 6.735 | 0 |
| 6.736 | 0 |
| 6.737 | 0 |
| 6.738 | 0 |
| 6.739 | 0 |
| 6.74 | 0 |
| 6.741 | 0 |
| 6.742 | 0 |
| 6.743 | 0 |
| 6.744 | 0 |
| 6.745 | 0 |
| 6.746 | 0 |
| 6.747 | 0 |
| 6.748 | 0 |
| 6.749 | 0 |
| 6.75 | 0 |
| 6.751 | 0 |
| 6.752 | 0 |
| 6.753 | 0 |
| 6.753999999999999 | 0 |
| 6.755 | 0 |
| 6.756 | 0 |
| 6.757 | 0 |
| 6.758 | 0 |
| 6.759 | 0 |
| 6.76 | 0 |
| 6.761 | 0 |
| 6.761999999999999 | 0 |
| 6.763 | 0 |
| 6.764 | 0 |
| 6.765 | 0 |
| 6.766 | 0 |
| 6.767 | 0 |
| 6.768 | 0 |
| 6.769 | 0 |
| 6.769999999999999 | 0 |
| 6.771 | 0 |
| 6.772 | 0 |
| 6.773 | 0 |
| 6.774 | 0 |
| 6.775 | 0 |
| 6.776 | 0 |
| 6.777 | 0 |
| 6.778 | 0 |
| 6.779 | 0 |
| 6.78 | 0 |
| 6.781 | 0 |
| 6.782 | 0 |
| 6.783 | 0 |
| 6.784 | 0 |
| 6.785 | 0 |
| 6.786 | 0 |
| 6.787 | 0 |
| 6.788 | 0 |
| 6.789 | 0 |
| 6.79 | 0 |
| 6.791 | 0 |
| 6.792 | 0 |
| 6.793 | 0 |
| 6.794 | 0 |
| 6.795 | 0 |
| 6.796 | 0 |
| 6.797 | 0 |
| 6.798 | 0 |
| 6.799 | 0 |
| 6.8 | 0 |
| 6.801 | 0 |
| 6.802 | 0 |
| 6.803 | 0 |
| 6.804 | 0 |
| 6.805 | 0 |
| 6.806 | 0 |
| 6.807 | 0 |
| 6.808 | 0 |
| 6.809 | 0 |
| 6.81 | 0 |
| 6.811 | 0 |
| 6.812 | 0 |
| 6.813 | 0 |
| 6.814 | 0 |
| 6.815 | 0 |
| 6.816 | 0 |
| 6.817 | 0 |
| 6.818 | 0 |
| 6.819 | 0 |
| 6.82 | 0 |
| 6.821 | 0 |
| 6.822 | 0 |
| 6.823 | 0 |
| 6.824 | 0 |
| 6.825 | 0 |
| 6.826 | 0 |
| 6.827 | 0 |
| 6.828 | 0 |
| 6.829 | 0 |
| 6.83 | 0 |
| 6.831 | 0 |
| 6.832 | 0 |
| 6.833 | 0 |
| 6.834 | 0 |
| 6.835 | 0 |
| 6.836 | 0 |
| 6.837 | 0 |
| 6.838 | 0 |
| 6.839 | 0 |
| 6.84 | 0 |
| 6.841 | 0 |
| 6.842 | 0 |
| 6.843 | 0 |
| 6.844 | 0 |
| 6.845 | 0 |
| 6.846 | 0 |
| 6.847 | 0 |
| 6.848 | 0 |
| 6.849 | 0 |
| 6.85 | 0 |
| 6.851 | 0 |
| 6.852 | 0 |
| 6.853 | 0 |
| 6.854 | 0 |
| 6.855 | 0 |
| 6.856 | 0 |
| 6.857 | 0 |
| 6.858 | 0 |
| 6.859 | 0 |
| 6.86 | 0 |
| 6.861 | 0 |
| 6.862 | 0 |
| 6.863 | 0 |
| 6.864 | 0 |
| 6.865 | 0 |
| 6.866 | 0 |
| 6.867 | 0 |
| 6.868 | 0 |
| 6.869 | 0 |
| 6.87 | 0 |
| 6.871 | 0 |
| 6.872 | 0 |
| 6.873 | 0 |
| 6.874 | 0 |
| 6.875 | 0 |
| 6.876 | 0 |
| 6.877 | 0 |
| 6.878 | 0 |
| 6.879 | 0 |
| 6.88 | 0 |
| 6.881 | 0 |
| 6.882 | 0 |
| 6.883 | 0 |
| 6.884 | 0 |
| 6.885 | 0 |
| 6.886 | 0 |
| 6.887 | 0 |
| 6.888 | 0 |
| 6.889 | 0 |
| 6.89 | 0 |
| 6.891 | 0 |
| 6.892 | 0 |
| 6.893 | 0 |
| 6.894 | 0 |
| 6.895 | 0 |
| 6.896 | 0 |
| 6.897 | 0 |
| 6.898 | 0 |
| 6.899 | 0 |
| 6.9 | 0 |
| 6.901 | 0 |
| 6.902 | 0 |
| 6.903 | 0 |
| 6.904 | 0 |
| 6.905 | 0 |
| 6.906 | 0 |
| 6.907 | 0 |
| 6.908 | 0 |
| 6.909 | 0 |
| 6.91 | 0 |
| 6.911 | 0 |
| 6.912 | 0 |
| 6.913 | 0 |
| 6.914 | 0 |
| 6.915 | 0 |
| 6.916 | 0 |
| 6.917 | 0 |
| 6.918 | 0 |
| 6.919 | 0 |
| 6.92 | 0 |
| 6.921 | 0 |
| 6.922 | 0 |
| 6.923 | 0 |
| 6.924 | 0 |
| 6.925 | 0 |
| 6.926 | 0 |
| 6.927 | 0 |
| 6.928 | 0 |
| 6.929 | 0 |
| 6.93 | 0 |
| 6.931 | 0 |
| 6.932 | 0 |
| 6.933 | 0 |
| 6.934 | 0 |
| 6.935 | 0 |
| 6.936 | 0 |
| 6.937 | 0 |
| 6.938 | 0 |
| 6.939 | 0 |
| 6.94 | 0 |
| 6.941 | 0 |
| 6.942 | 0 |
| 6.943 | 0 |
| 6.944 | 0 |
| 6.945 | 0 |
| 6.946 | 0 |
| 6.947 | 0 |
| 6.948 | 0 |
| 6.949 | 0 |
| 6.95 | 0 |
| 6.951 | 0 |
| 6.952 | 0 |
| 6.953 | 0 |
| 6.954 | 0 |
| 6.955 | 0 |
| 6.956 | 0 |
| 6.957 | 0 |
| 6.958 | 0 |
| 6.959 | 0 |
| 6.96 | 0 |
| 6.961 | 0 |
| 6.962 | 0 |
| 6.963 | 0 |
| 6.964 | 0 |
| 6.965 | 0 |
| 6.966 | 0 |
| 6.967 | 0 |
| 6.968 | 0 |
| 6.969 | 0 |
| 6.97 | 0 |
| 6.971 | 0 |
| 6.972 | 0 |
| 6.973 | 0 |
| 6.974 | 0 |
| 6.975 | 0 |
| 6.976 | 0 |
| 6.977 | 0 |
| 6.978 | 0 |
| 6.979 | 0 |
| 6.98 | 0 |
| 6.981 | 0 |
| 6.982 | 0 |
| 6.983 | 0 |
| 6.984 | 0 |
| 6.985 | 0 |
| 6.986 | 0 |
| 6.987 | 0 |
| 6.988 | 0 |
| 6.989 | 0 |
| 6.99 | 0 |
| 6.991 | 0 |
| 6.992 | 0 |
| 6.993 | 0 |
| 6.994 | 0 |
| 6.995 | 0 |
| 6.996 | 0 |
| 6.997 | 0 |
| 6.998 | 0 |
| 6.999 | 0 |
| 7.0 | 0 |
| 7.001 | 0 |
| 7.002 | 0 |
| 7.003 | 0 |
| 7.004 | 0 |
| 7.005 | 0 |
| 7.006 | 0 |
| 7.007 | 0 |
| 7.008 | 0 |
| 7.009 | 0 |
| 7.01 | 0 |
| 7.011 | 0 |
| 7.012 | 0 |
| 7.013 | 0 |
| 7.014 | 0 |
| 7.015 | 0 |
| 7.016 | 0 |
| 7.017 | 0 |
| 7.018 | 0 |
| 7.019 | 0 |
| 7.02 | 0 |
| 7.021 | 0 |
| 7.022 | 0 |
| 7.023 | 0 |
| 7.024 | 0 |
| 7.025 | 0 |
| 7.026 | 0 |
| 7.027 | 0 |
| 7.028 | 0 |
| 7.029 | 0 |
| 7.03 | 0 |
| 7.031 | 0 |
| 7.032 | 0 |
| 7.033 | 0 |
| 7.034 | 0 |
| 7.035 | 0 |
| 7.036 | 0 |
| 7.037 | 0 |
| 7.038 | 0 |
| 7.039 | 0 |
| 7.04 | 0 |
| 7.041 | 0 |
| 7.042 | 0 |
| 7.043 | 0 |
| 7.044 | 0 |
| 7.045 | 0 |
| 7.046 | 0 |
| 7.047 | 0 |
| 7.048 | 0 |
| 7.049 | 0 |
| 7.05 | 0 |
| 7.051 | 0 |
| 7.052 | 0 |
| 7.053 | 0 |
| 7.054 | 0 |
| 7.055 | 0 |
| 7.056 | 0 |
| 7.057 | 0 |
| 7.058 | 0 |
| 7.059 | 0 |
| 7.06 | 0 |
| 7.061 | 0 |
| 7.062 | 0 |
| 7.063 | 0 |
| 7.064 | 0 |
| 7.065 | 0 |
| 7.066 | 0 |
| 7.067 | 0 |
| 7.068 | 0 |
| 7.069 | 0 |
| 7.07 | 0 |
| 7.071 | 0 |
| 7.072 | 0 |
| 7.073 | 0 |
| 7.074 | 0 |
| 7.075 | 0 |
| 7.076 | 0 |
| 7.077 | 0 |
| 7.078 | 0 |
| 7.079 | 0 |
| 7.08 | 0 |
| 7.081 | 0 |
| 7.082 | 0 |
| 7.083 | 0 |
| 7.084 | 0 |
| 7.085 | 0 |
| 7.086 | 0 |
| 7.087 | 0 |
| 7.088 | 0 |
| 7.089 | 0 |
| 7.09 | 0 |
| 7.091 | 0 |
| 7.092 | 0 |
| 7.093 | 0 |
| 7.094 | 0 |
| 7.095 | 0 |
| 7.096 | 0 |
| 7.097 | 0 |
| 7.098 | 0 |
| 7.099 | 0 |
| 7.1 | 0 |
| 7.101 | 0 |
| 7.102 | 0 |
| 7.103 | 0 |
| 7.104 | 0 |
| 7.105 | 0 |
| 7.106 | 0 |
| 7.107 | 0 |
| 7.108 | 0 |
| 7.109 | 0 |
| 7.11 | 0 |
| 7.111 | 0 |
| 7.112 | 0 |
| 7.113 | 0 |
| 7.114 | 0 |
| 7.115 | 0 |
| 7.116 | 0 |
| 7.117 | 0 |
| 7.118 | 0 |
| 7.119 | 0 |
| 7.12 | 0 |
| 7.121 | 0 |
| 7.122 | 0 |
| 7.123 | 0 |
| 7.124 | 0 |
| 7.125 | 0 |
| 7.126 | 0 |
| 7.127 | 0 |
| 7.128 | 0 |
| 7.129 | 0 |
| 7.13 | 0 |
| 7.131 | 0 |
| 7.132 | 0 |
| 7.133 | 0 |
| 7.134 | 0 |
| 7.135 | 0 |
| 7.136 | 0 |
| 7.137 | 0 |
| 7.138 | 0 |
| 7.139 | 0 |
| 7.14 | 0 |
| 7.141 | 0 |
| 7.142 | 0 |
| 7.143 | 0 |
| 7.144 | 0 |
| 7.145 | 0 |
| 7.146 | 0 |
| 7.147 | 0 |
| 7.148 | 0 |
| 7.149 | 0 |
| 7.15 | 0 |
| 7.151 | 0 |
| 7.152 | 0 |
| 7.153 | 0 |
| 7.154 | 0 |
| 7.155 | 0 |
| 7.156 | 0 |
| 7.157 | 0 |
| 7.158 | 0 |
| 7.159 | 0 |
| 7.16 | 0 |
| 7.161 | 0 |
| 7.162 | 0 |
| 7.163 | 0 |
| 7.164 | 0 |
| 7.165 | 0 |
| 7.166 | 0 |
| 7.167 | 0 |
| 7.168 | 0 |
| 7.169 | 0 |
| 7.17 | 0 |
| 7.171 | 0 |
| 7.172 | 0 |
| 7.173 | 0 |
| 7.174 | 0 |
| 7.175 | 0 |
| 7.176 | 0 |
| 7.177 | 0 |
| 7.178 | 0 |
| 7.179 | 0 |
| 7.18 | 0 |
| 7.181 | 0 |
| 7.182 | 0 |
| 7.183 | 0 |
| 7.184 | 0 |
| 7.185 | 0 |
| 7.186 | 0 |
| 7.187 | 0 |
| 7.188 | 0 |
| 7.189 | 0 |
| 7.19 | 0 |
| 7.191 | 0 |
| 7.192 | 0 |
| 7.193 | 0 |
| 7.194 | 0 |
| 7.195 | 0 |
| 7.196 | 0 |
| 7.197 | 0 |
| 7.198 | 0 |
| 7.199 | 0 |
| 7.2 | 0 |
| 7.201 | 0 |
| 7.202 | 0 |
| 7.203 | 0 |
| 7.204 | 0 |
| 7.205 | 0 |
| 7.206 | 0 |
| 7.207 | 0 |
| 7.208 | 0 |
| 7.209 | 0 |
| 7.21 | 0 |
| 7.211 | 0 |
| 7.212 | 0 |
| 7.213 | 0 |
| 7.214 | 0 |
| 7.215 | 0 |
| 7.216 | 0 |
| 7.217 | 0 |
| 7.218 | 0 |
| 7.219 | 0 |
| 7.22 | 0 |
| 7.221 | 0 |
| 7.222 | 0 |
| 7.223 | 0 |
| 7.224 | 0 |
| 7.225 | 0 |
| 7.226 | 0 |
| 7.227 | 0 |
| 7.228 | 0 |
| 7.229 | 0 |
| 7.23 | 0 |
| 7.231 | 0 |
| 7.232 | 0 |
| 7.233 | 0 |
| 7.234 | 0 |
| 7.235 | 0 |
| 7.236 | 0 |
| 7.237 | 0 |
| 7.238 | 0 |
| 7.239 | 0 |
| 7.24 | 0 |
| 7.241 | 0 |
| 7.242 | 0 |
| 7.243 | 0 |
| 7.244 | 0 |
| 7.245 | 0 |
| 7.246 | 0 |
| 7.247 | 0 |
| 7.248 | 0 |
| 7.249 | 0 |
| 7.25 | 0 |
| 7.251 | 0 |
| 7.252 | 0 |
| 7.253 | 0 |
| 7.254 | 0 |
| 7.255 | 0 |
| 7.256 | 0 |
| 7.257 | 0 |
| 7.258 | 0 |
| 7.259 | 0 |
| 7.26 | 0 |
| 7.261 | 0 |
| 7.262 | 0 |
| 7.263 | 0 |
| 7.264 | 0 |
| 7.265 | 0 |
| 7.266 | 0 |
| 7.267 | 0 |
| 7.268 | 0 |
| 7.269 | 0 |
| 7.27 | 0 |
| 7.271 | 0 |
| 7.272 | 0 |
| 7.273 | 0 |
| 7.274 | 0 |
| 7.275 | 0 |
| 7.276 | 0 |
| 7.277 | 0 |
| 7.278 | 0 |
| 7.279 | 0 |
| 7.28 | 0 |
| 7.281 | 0 |
| 7.282 | 0 |
| 7.283 | 0 |
| 7.284 | 0 |
| 7.285 | 0 |
| 7.286 | 0 |
| 7.287 | 0 |
| 7.288 | 0 |
| 7.289 | 0 |
| 7.29 | 0 |
| 7.291 | 0 |
| 7.292 | 0 |
| 7.293 | 0 |
| 7.294 | 0 |
| 7.295 | 0 |
| 7.296 | 0 |
| 7.297 | 0 |
| 7.298 | 0 |
| 7.299 | 0 |
| 7.3 | 0 |
| 7.301 | 0 |
| 7.302 | 0 |
| 7.303 | 0 |
| 7.304 | 0 |
| 7.305 | 0 |
| 7.306 | 0 |
| 7.307 | 0 |
| 7.308 | 0 |
| 7.309 | 0 |
| 7.31 | 0 |
| 7.311 | 0 |
| 7.312 | 0 |
| 7.313 | 0 |
| 7.314 | 0 |
| 7.315 | 0 |
| 7.316 | 0 |
| 7.317 | 0 |
| 7.318 | 0 |
| 7.319 | 0 |
| 7.32 | 0 |
| 7.321 | 0 |
| 7.322 | 0 |
| 7.323 | 0 |
| 7.324 | 0 |
| 7.325 | 0 |
| 7.326 | 0 |
| 7.327 | 0 |
| 7.328 | 0 |
| 7.329 | 0 |
| 7.33 | 0 |
| 7.331 | 0 |
| 7.332 | 0 |
| 7.333 | 0 |
| 7.334 | 0 |
| 7.335 | 0 |
| 7.336 | 0 |
| 7.337 | 0 |
| 7.338 | 0 |
| 7.339 | 0 |
| 7.34 | 0 |
| 7.341 | 0 |
| 7.342 | 0 |
| 7.343 | 0 |
| 7.344 | 0 |
| 7.345 | 0 |
| 7.346 | 0 |
| 7.347 | 0 |
| 7.348 | 0 |
| 7.349 | 0 |
| 7.35 | 0 |
| 7.351 | 0 |
| 7.352 | 0 |
| 7.353 | 0 |
| 7.354 | 0 |
| 7.355 | 0 |
| 7.356 | 0 |
| 7.357 | 0 |
| 7.358 | 0 |
| 7.359 | 0 |
| 7.36 | 0 |
| 7.361 | 0 |
| 7.362 | 0 |
| 7.363 | 0 |
| 7.364 | 0 |
| 7.365 | 0 |
| 7.366 | 0 |
| 7.367 | 0 |
| 7.368 | 0 |
| 7.369 | 0 |
| 7.37 | 0 |
| 7.371 | 0 |
| 7.372 | 0 |
| 7.373 | 0 |
| 7.374 | 0 |
| 7.375 | 0 |
| 7.376 | 0 |
| 7.377 | 0 |
| 7.378 | 0 |
| 7.379 | 0 |
| 7.38 | 0 |
| 7.381 | 0 |
| 7.382 | 0 |
| 7.383 | 0 |
| 7.384 | 0 |
| 7.385 | 0 |
| 7.386 | 0 |
| 7.387 | 0 |
| 7.388 | 0 |
| 7.389 | 0 |
| 7.39 | 0 |
| 7.391 | 0 |
| 7.392 | 0 |
| 7.393 | 0 |
| 7.394 | 0 |
| 7.395 | 0 |
| 7.396 | 0 |
| 7.397 | 0 |
| 7.398 | 0 |
| 7.399 | 0 |
| 7.4 | 0 |
| 7.401 | 0 |
| 7.402 | 0 |
| 7.403 | 0 |
| 7.404 | 0 |
| 7.405 | 0 |
| 7.406 | 0 |
| 7.407 | 0 |
| 7.408 | 0 |
| 7.409 | 0 |
| 7.41 | 0 |
| 7.411 | 0 |
| 7.412 | 0 |
| 7.413 | 0 |
| 7.414 | 0 |
| 7.415 | 0 |
| 7.416 | 0 |
| 7.417 | 0 |
| 7.418 | 0 |
| 7.419 | 0 |
| 7.42 | 0 |
| 7.421 | 0 |
| 7.422 | 0 |
| 7.423 | 0 |
| 7.424 | 0 |
| 7.425 | 0 |
| 7.426 | 0 |
| 7.427 | 0 |
| 7.428 | 0 |
| 7.429 | 0 |
| 7.43 | 0 |
| 7.431 | 0 |
| 7.432 | 0 |
| 7.433 | 0 |
| 7.434 | 0 |
| 7.435 | 0 |
| 7.436 | 0 |
| 7.437 | 0 |
| 7.438 | 0 |
| 7.439 | 0 |
| 7.44 | 0 |
| 7.441 | 0 |
| 7.442 | 0 |
| 7.443 | 0 |
| 7.444 | 0 |
| 7.445 | 0 |
| 7.446 | 0 |
| 7.447 | 0 |
| 7.448 | 0 |
| 7.449 | 0 |
| 7.45 | 0 |
| 7.451 | 0 |
| 7.452 | 0 |
| 7.453 | 0 |
| 7.454 | 0 |
| 7.455 | 0 |
| 7.456 | 0 |
| 7.457 | 0 |
| 7.458 | 0 |
| 7.459 | 0 |
| 7.46 | 0 |
| 7.461 | 0 |
| 7.462 | 0 |
| 7.463 | 0 |
| 7.464 | 0 |
| 7.465 | 0 |
| 7.466 | 0 |
| 7.467 | 0 |
| 7.468 | 0 |
| 7.469 | 0 |
| 7.47 | 0 |
| 7.471 | 0 |
| 7.472 | 0 |
| 7.473 | 0 |
| 7.474 | 0 |
| 7.475 | 0 |
| 7.476 | 0 |
| 7.477 | 0 |
| 7.478 | 0 |
| 7.479 | 0 |
| 7.48 | 0 |
| 7.481 | 0 |
| 7.482 | 0 |
| 7.483 | 0 |
| 7.484 | 0 |
| 7.485 | 0 |
| 7.486 | 0 |
| 7.487 | 0 |
| 7.488 | 0 |
| 7.489 | 0 |
| 7.49 | 0 |
| 7.491 | 0 |
| 7.492 | 0 |
| 7.493 | 0 |
| 7.494 | 0 |
| 7.495 | 0 |
| 7.496 | 0 |
| 7.497 | 0 |
| 7.498 | 0 |
| 7.499 | 0 |
| 7.5 | 0 |
| 7.501 | 0 |
| 7.502 | 0 |
| 7.503 | 0 |
| 7.504 | 0 |
| 7.505 | 0 |
| 7.506 | 0 |
| 7.507 | 0 |
| 7.508 | 0 |
| 7.509 | 0 |
| 7.51 | 0 |
| 7.511 | 0 |
| 7.512 | 0 |
| 7.513 | 0 |
| 7.514 | 0 |
| 7.515 | 0 |
| 7.516 | 0 |
| 7.517 | 0 |
| 7.518 | 0 |
| 7.519 | 0 |
| 7.52 | 0 |
| 7.521 | 0 |
| 7.522 | 0 |
| 7.523 | 0 |
| 7.524 | 0 |
| 7.525 | 0 |
| 7.526 | 0 |
| 7.527 | 0 |
| 7.528 | 0 |
| 7.529 | 0 |
| 7.53 | 0 |
| 7.531 | 0 |
| 7.532 | 0 |
| 7.533 | 0 |
| 7.534 | 0 |
| 7.535 | 0 |
| 7.536 | 0 |
| 7.537 | 0 |
| 7.538 | 0 |
| 7.539 | 0 |
| 7.54 | 0 |
| 7.541 | 0 |
| 7.542 | 0 |
| 7.543 | 0 |
| 7.544 | 0 |
| 7.545 | 0 |
| 7.546 | 0 |
| 7.547 | 0 |
| 7.548 | 0 |
| 7.549 | 0 |
| 7.55 | 0 |
| 7.551 | 0 |
| 7.552 | 0 |
| 7.553 | 0 |
| 7.554 | 0 |
| 7.555 | 0 |
| 7.556 | 0 |
| 7.557 | 0 |
| 7.558 | 0 |
| 7.559 | 0 |
| 7.56 | 0 |
| 7.561 | 0 |
| 7.562 | 0 |
| 7.563 | 0 |
| 7.564 | 0 |
| 7.565 | 0 |
| 7.566 | 0 |
| 7.567 | 0 |
| 7.568 | 0 |
| 7.569 | 0 |
| 7.57 | 0 |
| 7.571 | 0 |
| 7.572 | 0 |
| 7.573 | 0 |
| 7.574 | 0 |
| 7.575 | 0 |
| 7.576 | 0 |
| 7.577 | 0 |
| 7.578 | 0 |
| 7.579 | 0 |
| 7.58 | 0 |
| 7.581 | 0 |
| 7.582 | 0 |
| 7.583 | 0 |
| 7.584 | 0 |
| 7.585 | 0 |
| 7.586 | 0 |
| 7.587 | 0 |
| 7.588 | 0 |
| 7.589 | 0 |
| 7.59 | 0 |
| 7.591 | 0 |
| 7.592 | 0 |
| 7.593 | 0 |
| 7.594 | 0 |
| 7.595 | 0 |
| 7.596 | 0 |
| 7.597 | 0 |
| 7.598 | 0 |
| 7.599 | 0 |
| 7.6 | 0 |
| 7.601 | 0 |
| 7.602 | 0 |
| 7.603 | 0 |
| 7.604 | 0 |
| 7.605 | 0 |
| 7.606 | 0 |
| 7.607 | 0 |
| 7.608 | 0 |
| 7.609 | 0 |
| 7.61 | 0 |
| 7.611 | 0 |
| 7.612 | 0 |
| 7.613 | 0 |
| 7.614 | 0 |
| 7.615 | 0 |
| 7.616 | 0 |
| 7.617 | 0 |
| 7.618 | 0 |
| 7.619 | 0 |
| 7.62 | 0 |
| 7.621 | 0 |
| 7.622 | 0 |
| 7.623 | 0 |
| 7.624 | 0 |
| 7.625 | 0 |
| 7.626 | 0 |
| 7.627 | 0 |
| 7.628 | 0 |
| 7.628999999999999 | 0 |
| 7.63 | 0 |
| 7.631 | 0 |
| 7.632 | 0 |
| 7.633 | 0 |
| 7.634 | 0 |
| 7.635 | 0 |
| 7.636 | 0 |
| 7.636999999999999 | 0 |
| 7.638 | 0 |
| 7.639 | 0 |
| 7.64 | 0 |
| 7.641 | 0 |
| 7.642 | 0 |
| 7.643 | 0 |
| 7.644 | 0 |
| 7.644999999999999 | 0 |
| 7.646 | 0 |
| 7.647 | 0 |
| 7.648 | 0 |
| 7.649 | 0 |
| 7.65 | 0 |
| 7.651 | 0 |
| 7.652 | 0 |
| 7.652999999999999 | 0 |
| 7.654 | 0 |
| 7.655 | 0 |
| 7.656 | 0 |
| 7.657 | 0 |
| 7.658 | 0 |
| 7.659 | 0 |
| 7.66 | 0 |
| 7.660999999999999 | 0 |
| 7.662 | 0 |
| 7.663 | 0 |
| 7.664 | 0 |
| 7.665 | 0 |
| 7.666 | 0 |
| 7.667 | 0 |
| 7.668 | 0 |
| 7.668999999999999 | 0 |
| 7.67 | 0 |
| 7.671 | 0 |
| 7.672 | 0 |
| 7.673 | 0 |
| 7.674 | 0 |
| 7.675 | 0 |
| 7.676 | 0 |
| 7.677 | 0 |
| 7.678 | 0 |
| 7.679 | 0 |
| 7.68 | 0 |
| 7.681 | 0 |
| 7.682 | 0 |
| 7.683 | 0 |
| 7.684 | 0 |
| 7.685 | 0 |
| 7.686 | 0 |
| 7.687 | 0 |
| 7.688 | 0 |
| 7.689 | 0 |
| 7.69 | 0 |
| 7.691 | 0 |
| 7.692 | 0 |
| 7.693 | 0 |
| 7.694 | 0 |
| 7.695 | 0 |
| 7.696 | 0 |
| 7.697 | 0 |
| 7.698 | 0 |
| 7.699 | 0 |
| 7.7 | 0 |
| 7.701 | 0 |
| 7.702 | 0 |
| 7.703 | 0 |
| 7.704 | 0 |
| 7.705 | 0 |
| 7.706 | 0 |
| 7.707 | 0 |
| 7.708 | 0 |
| 7.709 | 0 |
| 7.71 | 0 |
| 7.711 | 0 |
| 7.712 | 0 |
| 7.713 | 0 |
| 7.714 | 0 |
| 7.715 | 0 |
| 7.716 | 0 |
| 7.717 | 0 |
| 7.718 | 0 |
| 7.719 | 0 |
| 7.72 | 0 |
| 7.721 | 0 |
| 7.722 | 0 |
| 7.723 | 0 |
| 7.724 | 0 |
| 7.725 | 0 |
| 7.726 | 0 |
| 7.727 | 0 |
| 7.728 | 0 |
| 7.729 | 0 |
| 7.73 | 0 |
| 7.731 | 0 |
| 7.732 | 0 |
| 7.733 | 0 |
| 7.734 | 0 |
| 7.735 | 0 |
| 7.736 | 0 |
| 7.737 | 0 |
| 7.738 | 0 |
| 7.739 | 0 |
| 7.74 | 0 |
| 7.741 | 0 |
| 7.742 | 0 |
| 7.743 | 0 |
| 7.744 | 0 |
| 7.745 | 0 |
| 7.746 | 0 |
| 7.747 | 0 |
| 7.748 | 0 |
| 7.749 | 0 |
| 7.75 | 0 |
| 7.751 | 0 |
| 7.752 | 0 |
| 7.753 | 0 |
| 7.753999999999999 | 0 |
| 7.755 | 0 |
| 7.756 | 0 |
| 7.757 | 0 |
| 7.758 | 0 |
| 7.759 | 0 |
| 7.76 | 0 |
| 7.761 | 0 |
| 7.761999999999999 | 0 |
| 7.763 | 0 |
| 7.764 | 0 |
| 7.765 | 0 |
| 7.766 | 0 |
| 7.767 | 0 |
| 7.768 | 0 |
| 7.769 | 0 |
| 7.769999999999999 | 0 |
| 7.771 | 0 |
| 7.772 | 0 |
| 7.773 | 0 |
| 7.774 | 0 |
| 7.775 | 0 |
| 7.776 | 0 |
| 7.777 | 0 |
| 7.778 | 0 |
| 7.779 | 0 |
| 7.78 | 0 |
| 7.781 | 0 |
| 7.782 | 0 |
| 7.783 | 0 |
| 7.784 | 0 |
| 7.785 | 0 |
| 7.786 | 0 |
| 7.787 | 0 |
| 7.788 | 0 |
| 7.789 | 0 |
| 7.79 | 0 |
| 7.791 | 0 |
| 7.792 | 0 |
| 7.793 | 0 |
| 7.794 | 0 |
| 7.795 | 0 |
| 7.796 | 0 |
| 7.797 | 0 |
| 7.798 | 0 |
| 7.799 | 0 |
| 7.8 | 0 |
| 7.801 | 0 |
| 7.802 | 0 |
| 7.803 | 0 |
| 7.804 | 0 |
| 7.805 | 0 |
| 7.806 | 0 |
| 7.807 | 0 |
| 7.808 | 0 |
| 7.809 | 0 |
| 7.81 | 0 |
| 7.811 | 0 |
| 7.812 | 0 |
| 7.813 | 0 |
| 7.814 | 0 |
| 7.815 | 0 |
| 7.816 | 0 |
| 7.817 | 0 |
| 7.818 | 0 |
| 7.819 | 0 |
| 7.82 | 0 |
| 7.821 | 0 |
| 7.822 | 0 |
| 7.823 | 0 |
| 7.824 | 0 |
| 7.825 | 0 |
| 7.826 | 0 |
| 7.827 | 0 |
| 7.828 | 0 |
| 7.829 | 0 |
| 7.83 | 0 |
| 7.831 | 0 |
| 7.832 | 0 |
| 7.833 | 0 |
| 7.834 | 0 |
| 7.835 | 0 |
| 7.836 | 0 |
| 7.837 | 0 |
| 7.838 | 0 |
| 7.839 | 0 |
| 7.84 | 0 |
| 7.841 | 0 |
| 7.842 | 0 |
| 7.843 | 0 |
| 7.844 | 0 |
| 7.845 | 0 |
| 7.846 | 0 |
| 7.847 | 0 |
| 7.848 | 0 |
| 7.849 | 0 |
| 7.85 | 0 |
| 7.851 | 0 |
| 7.852 | 0 |
| 7.853 | 0 |
| 7.854 | 0 |
| 7.855 | 0 |
| 7.856 | 0 |
| 7.857 | 0 |
| 7.858 | 0 |
| 7.859 | 0 |
| 7.86 | 0 |
| 7.861 | 0 |
| 7.862 | 0 |
| 7.863 | 0 |
| 7.864 | 0 |
| 7.865 | 0 |
| 7.866 | 0 |
| 7.867 | 0 |
| 7.868 | 0 |
| 7.869 | 0 |
| 7.87 | 0 |
| 7.871 | 0 |
| 7.872 | 0 |
| 7.873 | 0 |
| 7.874 | 0 |
| 7.875 | 0 |
| 7.876 | 0 |
| 7.877 | 0 |
| 7.878 | 0 |
| 7.879 | 0 |
| 7.88 | 0 |
| 7.881 | 0 |
| 7.882 | 0 |
| 7.883 | 0 |
| 7.884 | 0 |
| 7.885 | 0 |
| 7.886 | 0 |
| 7.887 | 0 |
| 7.888 | 0 |
| 7.889 | 0 |
| 7.89 | 0 |
| 7.891 | 0 |
| 7.892 | 0 |
| 7.893 | 0 |
| 7.894 | 0 |
| 7.895 | 0 |
| 7.896 | 0 |
| 7.897 | 0 |
| 7.898 | 0 |
| 7.899 | 0 |
| 7.9 | 0 |
| 7.901 | 0 |
| 7.902 | 0 |
| 7.903 | 0 |
| 7.904 | 0 |
| 7.905 | 0 |
| 7.906 | 0 |
| 7.907 | 0 |
| 7.908 | 0 |
| 7.909 | 0 |
| 7.91 | 0 |
| 7.911 | 0 |
| 7.912 | 0 |
| 7.913 | 0 |
| 7.914 | 0 |
| 7.915 | 0 |
| 7.916 | 0 |
| 7.917 | 0 |
| 7.918 | 0 |
| 7.919 | 0 |
| 7.92 | 0 |
| 7.921 | 0 |
| 7.922 | 0 |
| 7.923 | 0 |
| 7.924 | 0 |
| 7.925 | 0 |
| 7.926 | 0 |
| 7.927 | 0 |
| 7.928 | 0 |
| 7.929 | 0 |
| 7.93 | 0 |
| 7.931 | 0 |
| 7.932 | 0 |
| 7.933 | 0 |
| 7.934 | 0 |
| 7.935 | 0 |
| 7.936 | 0 |
| 7.937 | 0 |
| 7.938 | 0 |
| 7.939 | 0 |
| 7.94 | 0 |
| 7.941 | 0 |
| 7.942 | 0 |
| 7.943 | 0 |
| 7.944 | 0 |
| 7.945 | 0 |
| 7.946 | 0 |
| 7.947 | 0 |
| 7.948 | 0 |
| 7.949 | 0 |
| 7.95 | 0 |
| 7.951 | 0 |
| 7.952 | 0 |
| 7.953 | 0 |
| 7.954 | 0 |
| 7.955 | 0 |
| 7.956 | 0 |
| 7.957 | 0 |
| 7.958 | 0 |
| 7.959 | 0 |
| 7.96 | 0 |
| 7.961 | 0 |
| 7.962 | 0 |
| 7.963 | 0 |
| 7.964 | 0 |
| 7.965 | 0 |
| 7.966 | 0 |
| 7.967 | 0 |
| 7.968 | 0 |
| 7.969 | 0 |
| 7.97 | 0 |
| 7.971 | 0 |
| 7.972 | 0 |
| 7.973 | 0 |
| 7.974 | 0 |
| 7.975 | 0 |
| 7.976 | 0 |
| 7.977 | 0 |
| 7.978 | 0 |
| 7.979 | 0 |
| 7.98 | 0 |
| 7.981 | 0 |
| 7.982 | 0 |
| 7.983 | 0 |
| 7.984 | 0 |
| 7.985 | 0 |
| 7.986 | 0 |
| 7.987 | 0 |
| 7.988 | 0 |
| 7.989 | 0 |
| 7.99 | 0 |
| 7.991 | 0 |
| 7.992 | 0 |
| 7.993 | 0 |
| 7.994 | 0 |
| 7.995 | 0 |
| 7.996 | 0 |
| 7.997 | 0 |
| 7.998 | 0 |
| 7.999 | 0 |
| 8.0 | 0 |
| 8.001 | 0 |
| 8.002 | 0 |
| 8.003 | 0 |
| 8.004 | 0 |
| 8.005 | 0 |
| 8.006 | 0 |
| 8.007 | 0 |
| 8.008 | 0 |
| 8.009 | 0 |
| 8.01 | 0 |
| 8.011 | 0 |
| 8.012 | 0 |
| 8.013 | 0 |
| 8.014 | 0 |
| 8.015 | 0 |
| 8.016 | 0 |
| 8.017 | 0 |
| 8.018 | 0 |
| 8.019 | 0 |
| 8.02 | 0 |
| 8.021 | 0 |
| 8.022 | 0 |
| 8.023 | 0 |
| 8.024 | 0 |
| 8.025 | 0 |
| 8.026 | 0 |
| 8.027 | 0 |
| 8.028 | 0 |
| 8.029 | 0 |
| 8.03 | 0 |
| 8.031 | 0 |
| 8.032 | 0 |
| 8.033 | 0 |
| 8.034 | 0 |
| 8.035 | 0 |
| 8.036 | 0 |
| 8.037 | 0 |
| 8.038 | 0 |
| 8.039 | 0 |
| 8.04 | 0 |
| 8.041 | 0 |
| 8.042 | 0 |
| 8.043 | 0 |
| 8.044 | 0 |
| 8.045 | 0 |
| 8.046 | 0 |
| 8.047 | 0 |
| 8.048 | 0 |
| 8.049 | 0 |
| 8.05 | 0 |
| 8.051 | 0 |
| 8.052 | 0 |
| 8.053 | 0 |
| 8.054 | 0 |
| 8.055 | 0 |
| 8.056 | 0 |
| 8.057 | 0 |
| 8.058 | 0 |
| 8.059 | 0 |
| 8.06 | 0 |
| 8.061 | 0 |
| 8.062 | 0 |
| 8.063 | 0 |
| 8.064 | 0 |
| 8.065 | 0 |
| 8.066 | 0 |
| 8.067 | 0 |
| 8.068 | 0 |
| 8.069 | 0 |
| 8.07 | 0 |
| 8.071 | 0 |
| 8.072 | 0 |
| 8.073 | 0 |
| 8.074 | 0 |
| 8.075 | 0 |
| 8.076 | 0 |
| 8.077 | 0 |
| 8.078 | 0 |
| 8.079 | 0 |
| 8.08 | 0 |
| 8.081 | 0 |
| 8.082 | 0 |
| 8.083 | 0 |
| 8.084 | 0 |
| 8.085 | 0 |
| 8.086 | 0 |
| 8.087 | 0 |
| 8.088 | 0 |
| 8.089 | 0 |
| 8.09 | 0 |
| 8.091 | 0 |
| 8.092 | 0 |
| 8.093 | 0 |
| 8.094 | 0 |
| 8.095 | 0 |
| 8.096 | 0 |
| 8.097 | 0 |
| 8.098 | 0 |
| 8.099 | 0 |
| 8.1 | 0 |
| 8.101 | 0 |
| 8.102 | 0 |
| 8.103 | 0 |
| 8.104 | 0 |
| 8.105 | 0 |
| 8.106 | 0 |
| 8.107 | 0 |
| 8.108 | 0 |
| 8.109 | 0 |
| 8.11 | 0 |
| 8.111 | 0 |
| 8.112 | 0 |
| 8.113 | 0 |
| 8.114 | 0 |
| 8.115 | 0 |
| 8.116 | 0 |
| 8.117 | 0 |
| 8.118 | 0 |
| 8.119 | 0 |
| 8.12 | 0 |
| 8.121 | 0 |
| 8.122 | 0 |
| 8.123 | 0 |
| 8.124 | 0 |
| 8.125 | 0 |
| 8.126 | 0 |
| 8.127 | 0 |
| 8.128 | 0 |
| 8.129 | 0 |
| 8.13 | 0 |
| 8.131 | 0 |
| 8.132 | 0 |
| 8.133 | 0 |
| 8.134 | 0 |
| 8.135 | 0 |
| 8.136 | 0 |
| 8.137 | 0 |
| 8.138 | 0 |
| 8.139 | 0 |
| 8.14 | 0 |
| 8.141 | 0 |
| 8.142 | 0 |
| 8.143 | 0 |
| 8.144 | 0 |
| 8.145 | 0 |
| 8.146 | 0 |
| 8.147 | 0 |
| 8.148 | 0 |
| 8.149 | 0 |
| 8.15 | 0 |
| 8.151 | 0 |
| 8.152 | 0 |
| 8.153 | 0 |
| 8.154 | 0 |
| 8.155 | 0 |
| 8.156 | 0 |
| 8.157 | 0 |
| 8.158 | 0 |
| 8.159 | 0 |
| 8.16 | 0 |
| 8.161 | 0 |
| 8.162 | 0 |
| 8.163 | 0 |
| 8.164 | 0 |
| 8.165 | 0 |
| 8.166 | 0 |
| 8.167 | 0 |
| 8.168 | 0 |
| 8.169 | 0 |
| 8.17 | 0 |
| 8.171 | 0 |
| 8.172 | 0 |
| 8.173 | 0 |
| 8.174 | 0 |
| 8.175 | 0 |
| 8.176 | 0 |
| 8.177 | 0 |
| 8.178 | 0 |
| 8.179 | 0 |
| 8.18 | 0 |
| 8.181 | 0 |
| 8.182 | 0 |
| 8.183 | 0 |
| 8.184 | 0 |
| 8.185 | 0 |
| 8.186 | 0 |
| 8.187 | 0 |
| 8.188 | 0 |
| 8.189 | 0 |
| 8.19 | 0 |
| 8.191 | 0 |
| 8.192 | 0 |
| 8.193 | 0 |
| 8.194 | 0 |
| 8.195 | 0 |
| 8.196 | 0 |
| 8.197 | 0 |
| 8.198 | 0 |
| 8.199 | 0 |
| 8.2 | 0 |
| 8.201 | 0 |
| 8.202 | 0 |
| 8.203 | 0 |
| 8.204 | 0 |
| 8.205 | 0 |
| 8.206 | 0 |
| 8.207 | 0 |
| 8.208 | 0 |
| 8.209 | 0 |
| 8.21 | 0 |
| 8.211 | 0 |
| 8.212 | 0 |
| 8.213 | 0 |
| 8.214 | 0 |
| 8.215 | 0 |
| 8.216 | 0 |
| 8.217 | 0 |
| 8.218 | 0 |
| 8.219 | 0 |
| 8.22 | 0 |
| 8.221 | 0 |
| 8.222 | 0 |
| 8.223 | 0 |
| 8.224 | 0 |
| 8.225 | 0 |
| 8.226 | 0 |
| 8.227 | 0 |
| 8.228 | 0 |
| 8.229 | 0 |
| 8.23 | 0 |
| 8.231 | 0 |
| 8.232 | 0 |
| 8.233 | 0 |
| 8.234 | 0 |
| 8.235 | 0 |
| 8.236 | 0 |
| 8.237 | 0 |
| 8.238 | 0 |
| 8.239 | 0 |
| 8.24 | 0 |
| 8.241 | 0 |
| 8.242 | 0 |
| 8.243 | 0 |
| 8.244 | 0 |
| 8.245 | 0 |
| 8.246 | 0 |
| 8.247 | 0 |
| 8.248 | 0 |
| 8.249 | 0 |
| 8.25 | 0 |
| 8.251 | 0 |
| 8.252 | 0 |
| 8.253 | 0 |
| 8.254 | 0 |
| 8.255 | 0 |
| 8.256 | 0 |
| 8.257 | 0 |
| 8.258 | 0 |
| 8.259 | 0 |
| 8.26 | 0 |
| 8.261 | 0 |
| 8.262 | 0 |
| 8.263 | 0 |
| 8.264 | 0 |
| 8.265 | 0 |
| 8.266 | 0 |
| 8.267 | 0 |
| 8.268 | 0 |
| 8.269 | 0 |
| 8.27 | 0 |
| 8.271 | 0 |
| 8.272 | 0 |
| 8.273 | 0 |
| 8.274 | 0 |
| 8.275 | 0 |
| 8.276 | 0 |
| 8.277 | 0 |
| 8.278 | 0 |
| 8.279 | 0 |
| 8.28 | 0 |
| 8.281 | 0 |
| 8.282 | 0 |
| 8.283 | 0 |
| 8.284 | 0 |
| 8.285 | 0 |
| 8.286 | 0 |
| 8.287 | 0 |
| 8.288 | 0 |
| 8.289 | 0 |
| 8.29 | 0 |
| 8.291 | 0 |
| 8.292 | 0 |
| 8.293 | 0 |
| 8.294 | 0 |
| 8.295 | 0 |
| 8.296 | 0 |
| 8.297 | 0 |
| 8.298 | 0 |
| 8.299 | 0 |
| 8.3 | 0 |
| 8.301 | 0 |
| 8.302 | 0 |
| 8.303 | 0 |
| 8.304 | 0 |
| 8.305 | 0 |
| 8.306 | 0 |
| 8.307 | 0 |
| 8.308 | 0 |
| 8.309 | 0 |
| 8.31 | 0 |
| 8.311 | 0 |
| 8.312 | 0 |
| 8.313 | 0 |
| 8.314 | 0 |
| 8.315 | 0 |
| 8.316 | 0 |
| 8.317 | 0 |
| 8.318 | 0 |
| 8.319 | 0 |
| 8.32 | 0 |
| 8.321 | 0 |
| 8.322 | 0 |
| 8.323 | 0 |
| 8.324 | 0 |
| 8.325 | 0 |
| 8.326 | 0 |
| 8.327 | 0 |
| 8.328 | 0 |
| 8.329 | 0 |
| 8.33 | 0 |
| 8.331 | 0 |
| 8.332 | 0 |
| 8.333 | 0 |
| 8.334 | 0 |
| 8.335 | 0 |
| 8.336 | 0 |
| 8.337 | 0 |
| 8.338 | 0 |
| 8.339 | 0 |
| 8.34 | 0 |
| 8.341 | 0 |
| 8.342 | 0 |
| 8.343 | 0 |
| 8.344 | 0 |
| 8.345 | 0 |
| 8.346 | 0 |
| 8.347 | 0 |
| 8.348 | 0 |
| 8.349 | 0 |
| 8.35 | 0 |
| 8.351 | 0 |
| 8.352 | 0 |
| 8.353 | 0 |
| 8.354 | 0 |
| 8.355 | 0 |
| 8.356 | 0 |
| 8.357 | 0 |
| 8.358 | 0 |
| 8.359 | 0 |
| 8.36 | 0 |
| 8.361 | 0 |
| 8.362 | 0 |
| 8.363 | 0 |
| 8.364 | 0 |
| 8.365 | 0 |
| 8.366 | 0 |
| 8.367 | 0 |
| 8.368 | 0 |
| 8.369 | 0 |
| 8.37 | 0 |
| 8.371 | 0 |
| 8.372 | 0 |
| 8.373 | 0 |
| 8.374 | 0 |
| 8.375 | 0 |
| 8.376 | 0 |
| 8.377 | 0 |
| 8.378 | 0 |
| 8.379 | 0 |
| 8.38 | 0 |
| 8.381 | 0 |
| 8.382 | 0 |
| 8.383 | 0 |
| 8.384 | 0 |
| 8.385 | 0 |
| 8.386 | 0 |
| 8.387 | 0 |
| 8.388 | 0 |
| 8.389 | 0 |
| 8.39 | 0 |
| 8.391 | 0 |
| 8.392 | 0 |
| 8.393 | 0 |
| 8.394 | 0 |
| 8.395 | 0 |
| 8.396 | 0 |
| 8.397 | 0 |
| 8.398 | 0 |
| 8.399 | 0 |
| 8.4 | 0 |
| 8.401 | 0 |
| 8.402 | 0 |
| 8.403 | 0 |
| 8.404 | 0 |
| 8.405 | 0 |
| 8.406 | 0 |
| 8.407 | 0 |
| 8.408 | 0 |
| 8.409 | 0 |
| 8.41 | 0 |
| 8.411 | 0 |
| 8.412 | 0 |
| 8.413 | 0 |
| 8.414 | 0 |
| 8.415 | 0 |
| 8.416 | 0 |
| 8.417 | 0 |
| 8.418 | 0 |
| 8.419 | 0 |
| 8.42 | 0 |
| 8.421 | 0 |
| 8.422 | 0 |
| 8.423 | 0 |
| 8.424 | 0 |
| 8.425 | 0 |
| 8.426 | 0 |
| 8.427 | 0 |
| 8.428 | 0 |
| 8.429 | 0 |
| 8.43 | 0 |
| 8.431 | 0 |
| 8.432 | 0 |
| 8.433 | 0 |
| 8.434 | 0 |
| 8.435 | 0 |
| 8.436 | 0 |
| 8.437 | 0 |
| 8.438 | 0 |
| 8.439 | 0 |
| 8.44 | 0 |
| 8.441 | 0 |
| 8.442 | 0 |
| 8.443 | 0 |
| 8.444 | 0 |
| 8.445 | 0 |
| 8.446 | 0 |
| 8.447 | 0 |
| 8.448 | 0 |
| 8.449 | 0 |
| 8.45 | 0 |
| 8.451 | 0 |
| 8.452 | 0 |
| 8.453 | 0 |
| 8.454 | 0 |
| 8.455 | 0 |
| 8.456 | 0 |
| 8.457 | 0 |
| 8.458 | 0 |
| 8.459 | 0 |
| 8.46 | 0 |
| 8.461 | 0 |
| 8.462 | 0 |
| 8.463 | 0 |
| 8.464 | 0 |
| 8.465 | 0 |
| 8.466 | 0 |
| 8.467 | 0 |
| 8.468 | 0 |
| 8.469 | 0 |
| 8.47 | 0 |
| 8.471 | 0 |
| 8.472 | 0 |
| 8.473 | 0 |
| 8.474 | 0 |
| 8.475 | 0 |
| 8.476 | 0 |
| 8.477 | 0 |
| 8.478 | 0 |
| 8.479 | 0 |
| 8.48 | 0 |
| 8.481 | 0 |
| 8.482 | 0 |
| 8.483 | 0 |
| 8.484 | 0 |
| 8.485 | 0 |
| 8.486 | 0 |
| 8.487 | 0 |
| 8.488 | 0 |
| 8.489 | 0 |
| 8.49 | 0 |
| 8.491 | 0 |
| 8.492 | 0 |
| 8.493 | 0 |
| 8.494 | 0 |
| 8.495 | 0 |
| 8.496 | 0 |
| 8.497 | 0 |
| 8.498 | 0 |
| 8.499 | 0 |
| 8.5 | 0 |
| 8.501 | 0 |
| 8.502 | 0 |
| 8.503 | 0 |
| 8.504 | 0 |
| 8.505 | 0 |
| 8.506 | 0 |
| 8.507 | 0 |
| 8.508 | 0 |
| 8.509 | 0 |
| 8.51 | 0 |
| 8.511 | 0 |
| 8.512 | 0 |
| 8.513 | 0 |
| 8.514 | 0 |
| 8.515 | 0 |
| 8.516 | 0 |
| 8.517 | 0 |
| 8.518 | 0 |
| 8.519 | 0 |
| 8.52 | 0 |
| 8.521 | 0 |
| 8.522 | 0 |
| 8.523 | 0 |
| 8.524 | 0 |
| 8.525 | 0 |
| 8.526 | 0 |
| 8.527 | 0 |
| 8.528 | 0 |
| 8.529 | 0 |
| 8.53 | 0 |
| 8.531 | 0 |
| 8.532 | 0 |
| 8.533 | 0 |
| 8.534 | 0 |
| 8.535 | 0 |
| 8.536 | 0 |
| 8.537 | 0 |
| 8.538 | 0 |
| 8.539 | 0 |
| 8.54 | 0 |
| 8.541 | 0 |
| 8.542 | 0 |
| 8.543 | 0 |
| 8.544 | 0 |
| 8.545 | 0 |
| 8.546 | 0 |
| 8.547 | 0 |
| 8.548 | 0 |
| 8.549 | 0 |
| 8.55 | 0 |
| 8.551 | 0 |
| 8.552 | 0 |
| 8.553 | 0 |
| 8.554 | 0 |
| 8.555 | 0 |
| 8.556 | 0 |
| 8.557 | 0 |
| 8.558 | 0 |
| 8.559 | 0 |
| 8.56 | 0 |
| 8.561 | 0 |
| 8.562 | 0 |
| 8.563 | 0 |
| 8.564 | 0 |
| 8.565 | 0 |
| 8.566 | 0 |
| 8.567 | 0 |
| 8.568 | 0 |
| 8.569 | 0 |
| 8.57 | 0 |
| 8.571 | 0 |
| 8.572 | 0 |
| 8.573 | 0 |
| 8.574 | 0 |
| 8.575 | 0 |
| 8.576 | 0 |
| 8.577 | 0 |
| 8.578 | 0 |
| 8.579 | 0 |
| 8.58 | 0 |
| 8.581 | 0 |
| 8.582 | 0 |
| 8.583 | 0 |
| 8.584 | 0 |
| 8.585 | 0 |
| 8.586 | 0 |
| 8.587 | 0 |
| 8.588 | 0 |
| 8.589 | 0 |
| 8.59 | 0 |
| 8.591 | 0 |
| 8.592 | 0 |
| 8.593 | 0 |
| 8.594 | 0 |
| 8.595 | 0 |
| 8.596 | 0 |
| 8.597 | 0 |
| 8.598 | 0 |
| 8.599 | 0 |
| 8.6 | 0 |
| 8.601 | 0 |
| 8.602 | 0 |
| 8.603 | 0 |
| 8.604 | 0 |
| 8.605 | 0 |
| 8.606 | 0 |
| 8.607 | 0 |
| 8.608 | 0 |
| 8.609 | 0 |
| 8.61 | 0 |
| 8.611 | 0 |
| 8.612 | 0 |
| 8.613 | 0 |
| 8.614 | 0 |
| 8.615 | 0 |
| 8.616 | 0 |
| 8.617 | 0 |
| 8.618 | 0 |
| 8.619 | 0 |
| 8.62 | 0 |
| 8.621 | 0 |
| 8.622 | 0 |
| 8.623 | 0 |
| 8.624 | 0 |
| 8.625 | 0 |
| 8.626 | 0 |
| 8.627 | 0 |
| 8.628 | 0 |
| 8.629 | 0 |
| 8.63 | 0 |
| 8.631 | 0 |
| 8.632 | 0 |
| 8.633 | 0 |
| 8.634 | 0 |
| 8.635 | 0 |
| 8.636 | 0 |
| 8.637 | 0 |
| 8.638 | 0 |
| 8.639 | 0 |
| 8.64 | 0 |
| 8.641 | 0 |
| 8.642 | 0 |
| 8.643 | 0 |
| 8.644 | 0 |
| 8.645 | 0 |
| 8.646 | 0 |
| 8.647 | 0 |
| 8.648 | 0 |
| 8.649 | 0 |
| 8.65 | 0 |
| 8.651 | 0 |
| 8.652 | 0 |
| 8.653 | 0 |
| 8.654 | 0 |
| 8.655 | 0 |
| 8.656 | 0 |
| 8.657 | 0 |
| 8.658 | 0 |
| 8.659 | 0 |
| 8.66 | 0 |
| 8.661 | 0 |
| 8.662 | 0 |
| 8.663 | 0 |
| 8.664 | 0 |
| 8.665 | 0 |
| 8.666 | 0 |
| 8.667 | 0 |
| 8.668 | 0 |
| 8.669 | 0 |
| 8.67 | 0 |
| 8.671 | 0 |
| 8.672 | 0 |
| 8.673 | 0 |
| 8.674 | 0 |
| 8.675 | 0 |
| 8.676 | 0 |
| 8.677 | 0 |
| 8.678 | 0 |
| 8.679 | 0 |
| 8.68 | 0 |
| 8.681 | 0 |
| 8.682 | 0 |
| 8.683 | 0 |
| 8.684 | 0 |
| 8.685 | 0 |
| 8.686 | 0 |
| 8.687 | 0 |
| 8.688 | 0 |
| 8.689 | 0 |
| 8.69 | 0 |
| 8.691 | 0 |
| 8.692 | 0 |
| 8.693 | 0 |
| 8.694 | 0 |
| 8.695 | 0 |
| 8.696 | 0 |
| 8.697 | 0 |
| 8.698 | 0 |
| 8.699 | 0 |
| 8.7 | 0 |
| 8.701 | 0 |
| 8.702 | 0 |
| 8.703 | 0 |
| 8.704 | 0 |
| 8.705 | 0 |
| 8.706 | 0 |
| 8.707 | 0 |
| 8.708 | 0 |
| 8.709 | 0 |
| 8.71 | 0 |
| 8.711 | 0 |
| 8.712 | 0 |
| 8.713 | 0 |
| 8.714 | 0 |
| 8.715 | 0 |
| 8.716 | 0 |
| 8.717 | 0 |
| 8.718 | 0 |
| 8.719 | 0 |
| 8.72 | 0 |
| 8.721 | 0 |
| 8.722 | 0 |
| 8.723 | 0 |
| 8.724 | 0 |
| 8.725 | 0 |
| 8.726 | 0 |
| 8.727 | 0 |
| 8.728 | 0 |
| 8.729 | 0 |
| 8.73 | 0 |
| 8.731 | 0 |
| 8.732 | 0 |
| 8.733 | 0 |
| 8.734 | 0 |
| 8.735 | 0 |
| 8.736 | 0 |
| 8.737 | 0 |
| 8.738 | 0 |
| 8.739 | 0 |
| 8.74 | 0 |
| 8.741 | 0 |
| 8.742 | 0 |
| 8.743 | 0 |
| 8.744 | 0 |
| 8.745 | 0 |
| 8.746 | 0 |
| 8.747 | 0 |
| 8.748 | 0 |
| 8.749 | 0 |
| 8.75 | 0 |
| 8.751 | 0 |
| 8.752 | 0 |
| 8.753 | 0 |
| 8.754 | 0 |
| 8.755 | 0 |
| 8.756 | 0 |
| 8.757 | 0 |
| 8.758 | 0 |
| 8.759 | 0 |
| 8.76 | 0 |
| 8.761 | 0 |
| 8.762 | 0 |
| 8.763 | 0 |
| 8.764 | 0 |
| 8.765 | 0 |
| 8.766 | 0 |
| 8.767 | 0 |
| 8.768 | 0 |
| 8.769 | 0 |
| 8.77 | 0 |
| 8.771 | 0 |
| 8.772 | 0 |
| 8.773 | 0 |
| 8.774 | 0 |
| 8.775 | 0 |
| 8.776 | 0 |
| 8.777 | 0 |
| 8.778 | 0 |
| 8.779 | 0 |
| 8.78 | 0 |
| 8.781 | 0 |
| 8.782 | 0 |
| 8.783 | 0 |
| 8.784 | 0 |
| 8.785 | 0 |
| 8.786 | 0 |
| 8.787 | 0 |
| 8.788 | 0 |
| 8.789 | 0 |
| 8.79 | 0 |
| 8.791 | 0 |
| 8.792 | 0 |
| 8.793 | 0 |
| 8.794 | 0 |
| 8.795 | 0 |
| 8.796 | 0 |
| 8.797 | 0 |
| 8.798 | 0 |
| 8.799 | 0 |
| 8.8 | 0 |
| 8.801 | 0 |
| 8.802 | 0 |
| 8.803 | 0 |
| 8.804 | 0 |
| 8.805 | 0 |
| 8.806 | 0 |
| 8.807 | 0 |
| 8.808 | 0 |
| 8.809 | 0 |
| 8.81 | 0 |
| 8.811 | 0 |
| 8.812 | 0 |
| 8.813 | 0 |
| 8.814 | 0 |
| 8.815 | 0 |
| 8.816 | 0 |
| 8.817 | 0 |
| 8.818 | 0 |
| 8.819 | 0 |
| 8.82 | 0 |
| 8.821 | 0 |
| 8.822 | 0 |
| 8.823 | 0 |
| 8.824 | 0 |
| 8.825 | 0 |
| 8.826 | 0 |
| 8.827 | 0 |
| 8.828 | 0 |
| 8.829 | 0 |
| 8.83 | 0 |
| 8.831 | 0 |
| 8.832 | 0 |
| 8.833 | 0 |
| 8.834 | 0 |
| 8.835 | 0 |
| 8.836 | 0 |
| 8.837 | 0 |
| 8.838 | 0 |
| 8.839 | 0 |
| 8.84 | 0 |
| 8.841 | 0 |
| 8.842 | 0 |
| 8.843 | 0 |
| 8.844 | 0 |
| 8.845 | 0 |
| 8.846 | 0 |
| 8.847 | 0 |
| 8.848 | 0 |
| 8.849 | 0 |
| 8.85 | 0 |
| 8.851 | 0 |
| 8.852 | 0 |
| 8.853 | 0 |
| 8.854 | 0 |
| 8.855 | 0 |
| 8.856 | 0 |
| 8.857 | 0 |
| 8.858 | 0 |
| 8.859 | 0 |
| 8.86 | 0 |
| 8.861 | 0 |
| 8.862 | 0 |
| 8.863 | 0 |
| 8.864 | 0 |
| 8.865 | 0 |
| 8.866 | 0 |
| 8.867 | 0 |
| 8.868 | 0 |
| 8.869 | 0 |
| 8.87 | 0 |
| 8.871 | 0 |
| 8.872 | 0 |
| 8.873 | 0 |
| 8.874 | 0 |
| 8.875 | 0 |
| 8.876 | 0 |
| 8.877 | 0 |
| 8.878 | 0 |
| 8.879 | 0 |
| 8.88 | 0 |
| 8.881 | 0 |
| 8.882 | 0 |
| 8.883 | 0 |
| 8.884 | 0 |
| 8.885 | 0 |
| 8.886 | 0 |
| 8.887 | 0 |
| 8.888 | 0 |
| 8.889 | 0 |
| 8.89 | 0 |
| 8.891 | 0 |
| 8.892 | 0 |
| 8.893 | 0 |
| 8.894 | 0 |
| 8.895 | 0 |
| 8.896 | 0 |
| 8.897 | 0 |
| 8.898 | 0 |
| 8.899 | 0 |
| 8.9 | 0 |
| 8.901 | 0 |
| 8.902 | 0 |
| 8.903 | 0 |
| 8.904 | 0 |
| 8.905 | 0 |
| 8.906 | 0 |
| 8.907 | 0 |
| 8.908 | 0 |
| 8.909 | 0 |
| 8.91 | 0 |
| 8.911 | 0 |
| 8.912 | 0 |
| 8.913 | 0 |
| 8.914 | 0 |
| 8.915 | 0 |
| 8.916 | 0 |
| 8.917 | 0 |
| 8.918 | 0 |
| 8.919 | 0 |
| 8.92 | 0 |
| 8.921 | 0 |
| 8.922 | 0 |
| 8.923 | 0 |
| 8.924 | 0 |
| 8.925 | 0 |
| 8.926 | 0 |
| 8.927 | 0 |
| 8.928 | 0 |
| 8.929 | 0 |
| 8.93 | 0 |
| 8.931 | 0 |
| 8.932 | 0 |
| 8.933 | 0 |
| 8.934 | 0 |
| 8.935 | 0 |
| 8.936 | 0 |
| 8.937 | 0 |
| 8.938 | 0 |
| 8.939 | 0 |
| 8.94 | 0 |
| 8.941 | 0 |
| 8.942 | 0 |
| 8.943 | 0 |
| 8.944 | 0 |
| 8.945 | 0 |
| 8.946 | 0 |
| 8.947 | 0 |
| 8.948 | 0 |
| 8.949 | 0 |
| 8.95 | 0 |
| 8.951 | 0 |
| 8.952 | 0 |
| 8.953 | 0 |
| 8.954 | 0 |
| 8.955 | 0 |
| 8.956 | 0 |
| 8.957 | 0 |
| 8.958 | 0 |
| 8.959 | 0 |
| 8.96 | 0 |
| 8.961 | 0 |
| 8.962 | 0 |
| 8.963 | 0 |
| 8.964 | 0 |
| 8.965 | 0 |
| 8.966 | 0 |
| 8.967 | 0 |
| 8.968 | 0 |
| 8.969 | 0 |
| 8.97 | 0 |
| 8.971 | 0 |
| 8.972 | 0 |
| 8.973 | 0 |
| 8.974 | 0 |
| 8.975 | 0 |
| 8.976 | 0 |
| 8.977 | 0 |
| 8.978 | 0 |
| 8.979 | 0 |
| 8.98 | 0 |
| 8.981 | 0 |
| 8.982 | 0 |
| 8.983 | 0 |
| 8.984 | 0 |
| 8.985 | 0 |
| 8.986 | 0 |
| 8.987 | 0 |
| 8.988 | 0 |
| 8.989 | 0 |
| 8.99 | 0 |
| 8.991 | 0 |
| 8.992 | 0 |
| 8.993 | 0 |
| 8.994 | 0 |
| 8.995 | 0 |
| 8.996 | 0 |
| 8.997 | 0 |
| 8.998 | 0 |
| 8.999 | 0 |
| 9.0 | 0 |
| 9.001 | 0 |
| 9.002 | 0 |
| 9.003 | 0 |
| 9.004 | 0 |
| 9.005 | 0 |
| 9.006 | 0 |
| 9.007 | 0 |
| 9.008 | 0 |
| 9.009 | 0 |
| 9.01 | 0 |
| 9.011 | 0 |
| 9.012 | 0 |
| 9.013 | 0 |
| 9.014 | 0 |
| 9.015 | 0 |
| 9.016 | 0 |
| 9.017 | 0 |
| 9.018 | 0 |
| 9.019 | 0 |
| 9.02 | 0 |
| 9.021 | 0 |
| 9.022 | 0 |
| 9.023 | 0 |
| 9.024 | 0 |
| 9.025 | 0 |
| 9.026 | 0 |
| 9.027 | 0 |
| 9.028 | 0 |
| 9.029 | 0 |
| 9.03 | 0 |
| 9.031 | 0 |
| 9.032 | 0 |
| 9.033 | 0 |
| 9.034 | 0 |
| 9.035 | 0 |
| 9.036 | 0 |
| 9.037 | 0 |
| 9.038 | 0 |
| 9.039 | 0 |
| 9.04 | 0 |
| 9.041 | 0 |
| 9.042 | 0 |
| 9.043 | 0 |
| 9.044 | 0 |
| 9.045 | 0 |
| 9.046 | 0 |
| 9.047 | 0 |
| 9.048 | 0 |
| 9.049 | 0 |
| 9.05 | 0 |
| 9.051 | 0 |
| 9.052 | 0 |
| 9.053 | 0 |
| 9.054 | 0 |
| 9.055 | 0 |
| 9.056 | 0 |
| 9.057 | 0 |
| 9.058 | 0 |
| 9.059 | 0 |
| 9.06 | 0 |
| 9.061 | 0 |
| 9.062 | 0 |
| 9.063 | 0 |
| 9.064 | 0 |
| 9.065 | 0 |
| 9.066 | 0 |
| 9.067 | 0 |
| 9.068 | 0 |
| 9.069 | 0 |
| 9.07 | 0 |
| 9.071 | 0 |
| 9.072 | 0 |
| 9.073 | 0 |
| 9.074 | 0 |
| 9.075 | 0 |
| 9.076 | 0 |
| 9.077 | 0 |
| 9.078 | 0 |
| 9.079 | 0 |
| 9.08 | 0 |
| 9.081 | 0 |
| 9.082 | 0 |
| 9.083 | 0 |
| 9.084 | 0 |
| 9.085 | 0 |
| 9.086 | 0 |
| 9.087 | 0 |
| 9.088 | 0 |
| 9.089 | 0 |
| 9.09 | 0 |
| 9.091 | 0 |
| 9.092 | 0 |
| 9.093 | 0 |
| 9.094 | 0 |
| 9.095 | 0 |
| 9.096 | 0 |
| 9.097 | 0 |
| 9.098 | 0 |
| 9.099 | 0 |
| 9.1 | 0 |
| 9.101 | 0 |
| 9.102 | 0 |
| 9.103 | 0 |
| 9.104 | 0 |
| 9.105 | 0 |
| 9.106 | 0 |
| 9.107 | 0 |
| 9.108 | 0 |
| 9.109 | 0 |
| 9.11 | 0 |
| 9.111 | 0 |
| 9.112 | 0 |
| 9.113 | 0 |
| 9.114 | 0 |
| 9.115 | 0 |
| 9.116 | 0 |
| 9.117 | 0 |
| 9.118 | 0 |
| 9.119 | 0 |
| 9.12 | 0 |
| 9.121 | 0 |
| 9.122 | 0 |
| 9.123 | 0 |
| 9.124 | 0 |
| 9.125 | 0 |
| 9.126 | 0 |
| 9.127 | 0 |
| 9.128 | 0 |
| 9.129 | 0 |
| 9.13 | 0 |
| 9.131 | 0 |
| 9.132 | 0 |
| 9.133 | 0 |
| 9.134 | 0 |
| 9.135 | 0 |
| 9.136 | 0 |
| 9.137 | 0 |
| 9.138 | 0 |
| 9.139 | 0 |
| 9.14 | 0 |
| 9.141 | 0 |
| 9.142 | 0 |
| 9.143 | 0 |
| 9.144 | 0 |
| 9.145 | 0 |
| 9.146 | 0 |
| 9.147 | 0 |
| 9.148 | 0 |
| 9.149 | 0 |
| 9.15 | 0 |
| 9.151 | 0 |
| 9.152 | 0 |
| 9.153 | 0 |
| 9.154 | 0 |
| 9.155 | 0 |
| 9.156 | 0 |
| 9.157 | 0 |
| 9.158 | 0 |
| 9.159 | 0 |
| 9.16 | 0 |
| 9.161 | 0 |
| 9.162 | 0 |
| 9.163 | 0 |
| 9.164 | 0 |
| 9.165 | 0 |
| 9.166 | 0 |
| 9.167 | 0 |
| 9.168 | 0 |
| 9.169 | 0 |
| 9.17 | 0 |
| 9.171 | 0 |
| 9.172 | 0 |
| 9.173 | 0 |
| 9.174 | 0 |
| 9.175 | 0 |
| 9.176 | 0 |
| 9.177 | 0 |
| 9.178 | 0 |
| 9.179 | 0 |
| 9.18 | 0 |
| 9.181 | 0 |
| 9.182 | 0 |
| 9.183 | 0 |
| 9.184 | 0 |
| 9.185 | 0 |
| 9.186 | 0 |
| 9.187 | 0 |
| 9.188 | 0 |
| 9.189 | 0 |
| 9.19 | 0 |
| 9.191 | 0 |
| 9.192 | 0 |
| 9.193 | 0 |
| 9.194 | 0 |
| 9.195 | 0 |
| 9.196 | 0 |
| 9.197 | 0 |
| 9.198 | 0 |
| 9.199 | 0 |
| 9.2 | 0 |
| 9.201 | 0 |
| 9.202 | 0 |
| 9.203 | 0 |
| 9.204 | 0 |
| 9.205 | 0 |
| 9.206 | 0 |
| 9.207 | 0 |
| 9.208 | 0 |
| 9.209 | 0 |
| 9.21 | 0 |
| 9.211 | 0 |
| 9.212 | 0 |
| 9.213 | 0 |
| 9.214 | 0 |
| 9.215 | 0 |
| 9.216 | 0 |
| 9.217 | 0 |
| 9.218 | 0 |
| 9.219 | 0 |
| 9.22 | 0 |
| 9.221 | 0 |
| 9.222 | 0 |
| 9.223 | 0 |
| 9.224 | 0 |
| 9.225 | 0 |
| 9.226 | 0 |
| 9.227 | 0 |
| 9.228 | 0 |
| 9.229 | 0 |
| 9.23 | 0 |
| 9.231 | 0 |
| 9.232 | 0 |
| 9.233 | 0 |
| 9.234 | 0 |
| 9.235 | 0 |
| 9.236 | 0 |
| 9.237 | 0 |
| 9.238 | 0 |
| 9.239 | 0 |
| 9.24 | 0 |
| 9.241 | 0 |
| 9.242 | 0 |
| 9.243 | 0 |
| 9.244 | 0 |
| 9.245 | 0 |
| 9.246 | 0 |
| 9.247 | 0 |
| 9.248 | 0 |
| 9.249 | 0 |
| 9.25 | 0 |
| 9.251 | 0 |
| 9.252 | 0 |
| 9.253 | 0 |
| 9.254 | 0 |
| 9.255 | 0 |
| 9.256 | 0 |
| 9.257 | 0 |
| 9.258 | 0 |
| 9.259 | 0 |
| 9.26 | 0 |
| 9.261 | 0 |
| 9.262 | 0 |
| 9.263 | 0 |
| 9.264 | 0 |
| 9.265 | 0 |
| 9.266 | 0 |
| 9.267 | 0 |
| 9.268 | 0 |
| 9.269 | 0 |
| 9.27 | 0 |
| 9.271 | 0 |
| 9.272 | 0 |
| 9.273 | 0 |
| 9.274 | 0 |
| 9.275 | 0 |
| 9.276 | 0 |
| 9.277 | 0 |
| 9.278 | 0 |
| 9.279 | 0 |
| 9.28 | 0 |
| 9.281 | 0 |
| 9.282 | 0 |
| 9.283 | 0 |
| 9.284 | 0 |
| 9.285 | 0 |
| 9.286 | 0 |
| 9.287 | 0 |
| 9.288 | 0 |
| 9.289 | 0 |
| 9.29 | 0 |
| 9.291 | 0 |
| 9.292 | 0 |
| 9.293 | 0 |
| 9.294 | 0 |
| 9.295 | 0 |
| 9.296 | 0 |
| 9.297 | 0 |
| 9.298 | 0 |
| 9.299 | 0 |
| 9.3 | 0 |
| 9.301 | 0 |
| 9.302 | 0 |
| 9.303 | 0 |
| 9.304 | 0 |
| 9.305 | 0 |
| 9.306 | 0 |
| 9.307 | 0 |
| 9.308 | 0 |
| 9.309 | 0 |
| 9.31 | 0 |
| 9.311 | 0 |
| 9.312 | 0 |
| 9.313 | 0 |
| 9.314 | 0 |
| 9.315 | 0 |
| 9.316 | 0 |
| 9.317 | 0 |
| 9.318 | 0 |
| 9.319 | 0 |
| 9.32 | 0 |
| 9.321 | 0 |
| 9.322 | 0 |
| 9.323 | 0 |
| 9.324 | 0 |
| 9.325 | 0 |
| 9.326 | 0 |
| 9.327 | 0 |
| 9.328 | 0 |
| 9.329 | 0 |
| 9.33 | 0 |
| 9.331 | 0 |
| 9.332 | 0 |
| 9.333 | 0 |
| 9.334 | 0 |
| 9.335 | 0 |
| 9.336 | 0 |
| 9.337 | 0 |
| 9.338 | 0 |
| 9.339 | 0 |
| 9.34 | 0 |
| 9.341 | 0 |
| 9.342 | 0 |
| 9.343 | 0 |
| 9.344 | 0 |
| 9.345 | 0 |
| 9.346 | 0 |
| 9.347 | 0 |
| 9.348 | 0 |
| 9.349 | 0 |
| 9.35 | 0 |
| 9.351 | 0 |
| 9.352 | 0 |
| 9.353 | 0 |
| 9.354 | 0 |
| 9.355 | 0 |
| 9.356 | 0 |
| 9.357 | 0 |
| 9.358 | 0 |
| 9.359 | 0 |
| 9.36 | 0 |
| 9.361 | 0 |
| 9.362 | 0 |
| 9.363 | 0 |
| 9.364 | 0 |
| 9.365 | 0 |
| 9.366 | 0 |
| 9.367 | 0 |
| 9.368 | 0 |
| 9.369 | 0 |
| 9.37 | 0 |
| 9.371 | 0 |
| 9.372 | 0 |
| 9.373 | 0 |
| 9.374 | 0 |
| 9.375 | 0 |
| 9.376 | 0 |
| 9.377 | 0 |
| 9.378 | 0 |
| 9.379 | 0 |
| 9.38 | 0 |
| 9.381 | 0 |
| 9.382 | 0 |
| 9.383 | 0 |
| 9.384 | 0 |
| 9.385 | 0 |
| 9.386 | 0 |
| 9.387 | 0 |
| 9.388 | 0 |
| 9.389 | 0 |
| 9.39 | 0 |
| 9.391 | 0 |
| 9.392 | 0 |
| 9.393 | 0 |
| 9.394 | 0 |
| 9.395 | 0 |
| 9.396 | 0 |
| 9.397 | 0 |
| 9.398 | 0 |
| 9.399 | 0 |
| 9.4 | 0 |
| 9.401 | 0 |
| 9.402 | 0 |
| 9.403 | 0 |
| 9.404 | 0 |
| 9.405 | 0 |
| 9.406 | 0 |
| 9.407 | 0 |
| 9.408 | 0 |
| 9.409 | 0 |
| 9.41 | 0 |
| 9.411 | 0 |
| 9.412 | 0 |
| 9.413 | 0 |
| 9.414 | 0 |
| 9.415 | 0 |
| 9.416 | 0 |
| 9.417 | 0 |
| 9.418 | 0 |
| 9.419 | 0 |
| 9.42 | 0 |
| 9.421 | 0 |
| 9.422 | 0 |
| 9.423 | 0 |
| 9.424 | 0 |
| 9.425 | 0 |
| 9.426 | 0 |
| 9.427 | 0 |
| 9.428 | 0 |
| 9.429 | 0 |
| 9.43 | 0 |
| 9.431 | 0 |
| 9.432 | 0 |
| 9.433 | 0 |
| 9.434 | 0 |
| 9.435 | 0 |
| 9.436 | 0 |
| 9.437 | 0 |
| 9.438 | 0 |
| 9.439 | 0 |
| 9.44 | 0 |
| 9.441 | 0 |
| 9.442 | 0 |
| 9.443 | 0 |
| 9.444 | 0 |
| 9.445 | 0 |
| 9.446 | 0 |
| 9.447 | 0 |
| 9.448 | 0 |
| 9.449 | 0 |
| 9.45 | 0 |
| 9.451 | 0 |
| 9.452 | 0 |
| 9.453 | 0 |
| 9.454 | 0 |
| 9.455 | 0 |
| 9.456 | 0 |
| 9.457 | 0 |
| 9.458 | 0 |
| 9.459 | 0 |
| 9.46 | 0 |
| 9.461 | 0 |
| 9.462 | 0 |
| 9.463 | 0 |
| 9.464 | 0 |
| 9.465 | 0 |
| 9.466 | 0 |
| 9.467 | 0 |
| 9.468 | 0 |
| 9.469 | 0 |
| 9.47 | 0 |
| 9.471 | 0 |
| 9.472 | 0 |
| 9.473 | 0 |
| 9.474 | 0 |
| 9.475 | 0 |
| 9.476 | 0 |
| 9.477 | 0 |
| 9.478 | 0 |
| 9.479 | 0 |
| 9.48 | 0 |
| 9.481 | 0 |
| 9.482 | 0 |
| 9.483 | 0 |
| 9.484 | 0 |
| 9.485 | 0 |
| 9.486 | 0 |
| 9.487 | 0 |
| 9.488 | 0 |
| 9.489 | 0 |
| 9.49 | 0 |
| 9.491 | 0 |
| 9.492 | 0 |
| 9.493 | 0 |
| 9.494 | 0 |
| 9.495 | 0 |
| 9.496 | 0 |
| 9.497 | 0 |
| 9.498 | 0 |
| 9.499 | 0 |
| 9.5 | 0 |
| 9.501 | 0 |
| 9.502 | 0 |
| 9.503 | 0 |
| 9.504 | 0 |
| 9.505 | 0 |
| 9.506 | 0 |
| 9.507 | 0 |
| 9.508 | 0 |
| 9.509 | 0 |
| 9.51 | 0 |
| 9.511 | 0 |
| 9.512 | 0 |
| 9.513 | 0 |
| 9.514 | 0 |
| 9.515 | 0 |
| 9.516 | 0 |
| 9.517 | 0 |
| 9.518 | 0 |
| 9.519 | 0 |
| 9.52 | 0 |
| 9.521 | 0 |
| 9.522 | 0 |
| 9.523 | 0 |
| 9.524 | 0 |
| 9.525 | 0 |
| 9.526 | 0 |
| 9.527 | 0 |
| 9.528 | 0 |
| 9.529 | 0 |
| 9.53 | 0 |
| 9.531 | 0 |
| 9.532 | 0 |
| 9.533 | 0 |
| 9.534 | 0 |
| 9.535 | 0 |
| 9.536 | 0 |
| 9.537 | 0 |
| 9.538 | 0 |
| 9.539 | 0 |
| 9.54 | 0 |
| 9.541 | 0 |
| 9.542 | 0 |
| 9.543 | 0 |
| 9.544 | 0 |
| 9.545 | 0 |
| 9.546 | 0 |
| 9.547 | 0 |
| 9.548 | 0 |
| 9.549 | 0 |
| 9.55 | 0 |
| 9.551 | 0 |
| 9.552 | 0 |
| 9.553 | 0 |
| 9.554 | 0 |
| 9.555 | 0 |
| 9.556 | 0 |
| 9.557 | 0 |
| 9.558 | 0 |
| 9.559 | 0 |
| 9.56 | 0 |
| 9.561 | 0 |
| 9.562 | 0 |
| 9.563 | 0 |
| 9.564 | 0 |
| 9.565 | 0 |
| 9.566 | 0 |
| 9.567 | 0 |
| 9.568 | 0 |
| 9.569 | 0 |
| 9.57 | 0 |
| 9.571 | 0 |
| 9.572 | 0 |
| 9.573 | 0 |
| 9.574 | 0 |
| 9.575 | 0 |
| 9.576 | 0 |
| 9.577 | 0 |
| 9.578 | 0 |
| 9.579 | 0 |
| 9.58 | 0 |
| 9.581 | 0 |
| 9.582 | 0 |
| 9.583 | 0 |
| 9.584 | 0 |
| 9.585 | 0 |
| 9.586 | 0 |
| 9.587 | 0 |
| 9.588 | 0 |
| 9.589 | 0 |
| 9.59 | 0 |
| 9.591 | 0 |
| 9.592 | 0 |
| 9.593 | 0 |
| 9.594 | 0 |
| 9.595 | 0 |
| 9.596 | 0 |
| 9.597 | 0 |
| 9.598 | 0 |
| 9.599 | 0 |
| 9.6 | 0 |
| 9.601 | 0 |
| 9.602 | 0 |
| 9.603 | 0 |
| 9.604 | 0 |
| 9.605 | 0 |
| 9.606 | 0 |
| 9.607 | 0 |
| 9.608 | 0 |
| 9.609 | 0 |
| 9.61 | 0 |
| 9.611 | 0 |
| 9.612 | 0 |
| 9.613 | 0 |
| 9.614 | 0 |
| 9.615 | 0 |
| 9.616 | 0 |
| 9.617 | 0 |
| 9.618 | 0 |
| 9.619 | 0 |
| 9.62 | 0 |
| 9.621 | 0 |
| 9.622 | 0 |
| 9.623 | 0 |
| 9.624 | 0 |
| 9.625 | 0 |
| 9.626 | 0 |
| 9.627 | 0 |
| 9.628 | 0 |
| 9.629 | 0 |
| 9.63 | 0 |
| 9.631 | 0 |
| 9.632 | 0 |
| 9.633 | 0 |
| 9.634 | 0 |
| 9.635 | 0 |
| 9.636 | 0 |
| 9.637 | 0 |
| 9.638 | 0 |
| 9.639 | 0 |
| 9.64 | 0 |
| 9.641 | 0 |
| 9.642 | 0 |
| 9.643 | 0 |
| 9.644 | 0 |
| 9.645 | 0 |
| 9.646 | 0 |
| 9.647 | 0 |
| 9.648 | 0 |
| 9.649 | 0 |
| 9.65 | 0 |
| 9.651 | 0 |
| 9.652 | 0 |
| 9.653 | 0 |
| 9.654 | 0 |
| 9.655 | 0 |
| 9.656 | 0 |
| 9.657 | 0 |
| 9.658 | 0 |
| 9.659 | 0 |
| 9.66 | 0 |
| 9.661 | 0 |
| 9.662 | 0 |
| 9.663 | 0 |
| 9.664 | 0 |
| 9.665 | 0 |
| 9.666 | 0 |
| 9.667 | 0 |
| 9.668 | 0 |
| 9.669 | 0 |
| 9.67 | 0 |
| 9.671 | 0 |
| 9.672 | 0 |
| 9.673 | 0 |
| 9.674 | 0 |
| 9.675 | 0 |
| 9.676 | 0 |
| 9.677 | 0 |
| 9.678 | 0 |
| 9.679 | 0 |
| 9.68 | 0 |
| 9.681 | 0 |
| 9.682 | 0 |
| 9.683 | 0 |
| 9.684 | 0 |
| 9.685 | 0 |
| 9.686 | 0 |
| 9.687 | 0 |
| 9.688 | 0 |
| 9.689 | 0 |
| 9.69 | 0 |
| 9.691 | 0 |
| 9.692 | 0 |
| 9.693 | 0 |
| 9.694 | 0 |
| 9.695 | 0 |
| 9.696 | 0 |
| 9.697 | 0 |
| 9.698 | 0 |
| 9.699 | 0 |
| 9.7 | 0 |
| 9.701 | 0 |
| 9.702 | 0 |
| 9.703 | 0 |
| 9.704 | 0 |
| 9.705 | 0 |
| 9.706 | 0 |
| 9.707 | 0 |
| 9.708 | 0 |
| 9.709 | 0 |
| 9.71 | 0 |
| 9.711 | 0 |
| 9.712 | 0 |
| 9.713 | 0 |
| 9.714 | 0 |
| 9.715 | 0 |
| 9.716 | 0 |
| 9.717 | 0 |
| 9.718 | 0 |
| 9.719 | 0 |
| 9.72 | 0 |
| 9.721 | 0 |
| 9.722 | 0 |
| 9.723 | 0 |
| 9.724 | 0 |
| 9.725 | 0 |
| 9.726 | 0 |
| 9.727 | 0 |
| 9.728 | 0 |
| 9.729 | 0 |
| 9.73 | 0 |
| 9.731 | 0 |
| 9.732 | 0 |
| 9.733 | 0 |
| 9.734 | 0 |
| 9.735 | 0 |
| 9.736 | 0 |
| 9.737 | 0 |
| 9.738 | 0 |
| 9.739 | 0 |
| 9.74 | 0 |
| 9.741 | 0 |
| 9.742 | 0 |
| 9.743 | 0 |
| 9.744 | 0 |
| 9.745 | 0 |
| 9.746 | 0 |
| 9.747 | 0 |
| 9.748 | 0 |
| 9.749 | 0 |
| 9.75 | 0 |
| 9.751 | 0 |
| 9.752 | 0 |
| 9.753 | 0 |
| 9.754 | 0 |
| 9.755 | 0 |
| 9.756 | 0 |
| 9.757 | 0 |
| 9.758 | 0 |
| 9.759 | 0 |
| 9.76 | 0 |
| 9.761 | 0 |
| 9.762 | 0 |
| 9.763 | 0 |
| 9.764 | 0 |
| 9.765 | 0 |
| 9.766 | 0 |
| 9.767 | 0 |
| 9.768 | 0 |
| 9.769 | 0 |
| 9.77 | 0 |
| 9.771 | 0 |
| 9.772 | 0 |
| 9.773 | 0 |
| 9.774 | 0 |
| 9.775 | 0 |
| 9.776 | 0 |
| 9.777 | 0 |
| 9.778 | 0 |
| 9.779 | 0 |
| 9.78 | 0 |
| 9.781 | 0 |
| 9.782 | 0 |
| 9.783 | 0 |
| 9.784 | 0 |
| 9.785 | 0 |
| 9.786 | 0 |
| 9.787 | 0 |
| 9.788 | 0 |
| 9.789 | 0 |
| 9.79 | 0 |
| 9.791 | 0 |
| 9.792 | 0 |
| 9.793 | 0 |
| 9.794 | 0 |
| 9.795 | 0 |
| 9.796 | 0 |
| 9.797 | 0 |
| 9.798 | 0 |
| 9.799 | 0 |
| 9.8 | 0 |
| 9.801 | 0 |
| 9.802 | 0 |
| 9.803 | 0 |
| 9.804 | 0 |
| 9.805 | 0 |
| 9.806 | 0 |
| 9.807 | 0 |
| 9.808 | 0 |
| 9.809 | 0 |
| 9.81 | 0 |
| 9.811 | 0 |
| 9.812 | 0 |
| 9.813 | 0 |
| 9.814 | 0 |
| 9.815 | 0 |
| 9.816 | 0 |
| 9.817 | 0 |
| 9.818 | 0 |
| 9.819 | 0 |
| 9.82 | 0 |
| 9.821 | 0 |
| 9.822 | 0 |
| 9.823 | 0 |
| 9.824 | 0 |
| 9.825 | 0 |
| 9.826 | 0 |
| 9.827 | 0 |
| 9.828 | 0 |
| 9.829 | 0 |
| 9.83 | 0 |
| 9.831 | 0 |
| 9.832 | 0 |
| 9.833 | 0 |
| 9.834 | 0 |
| 9.835 | 0 |
| 9.836 | 0 |
| 9.837 | 0 |
| 9.838 | 0 |
| 9.839 | 0 |
| 9.84 | 0 |
| 9.841 | 0 |
| 9.842 | 0 |
| 9.843 | 0 |
| 9.844 | 0 |
| 9.845 | 0 |
| 9.846 | 0 |
| 9.847 | 0 |
| 9.848 | 0 |
| 9.849 | 0 |
| 9.85 | 0 |
| 9.851 | 0 |
| 9.852 | 0 |
| 9.853 | 0 |
| 9.854 | 0 |
| 9.855 | 0 |
| 9.856 | 0 |
| 9.857 | 0 |
| 9.858 | 0 |
| 9.859 | 0 |
| 9.86 | 0 |
| 9.861 | 0 |
| 9.862 | 0 |
| 9.863 | 0 |
| 9.864 | 0 |
| 9.865 | 0 |
| 9.866 | 0 |
| 9.867 | 0 |
| 9.868 | 0 |
| 9.869 | 0 |
| 9.87 | 0 |
| 9.871 | 0 |
| 9.872 | 0 |
| 9.873 | 0 |
| 9.874 | 0 |
| 9.875 | 0 |
| 9.876 | 0 |
| 9.877 | 0 |
| 9.878 | 0 |
| 9.879 | 0 |
| 9.88 | 0 |
| 9.881 | 0 |
| 9.882 | 0 |
| 9.883 | 0 |
| 9.884 | 0 |
| 9.885 | 0 |
| 9.886 | 0 |
| 9.887 | 0 |
| 9.888 | 0 |
| 9.889 | 0 |
| 9.89 | 0 |
| 9.891 | 0 |
| 9.892 | 0 |
| 9.893 | 0 |
| 9.894 | 0 |
| 9.895 | 0 |
| 9.896 | 0 |
| 9.897 | 0 |
| 9.898 | 0 |
| 9.899 | 0 |
| 9.9 | 0 |
| 9.901 | 0 |
| 9.902 | 0 |
| 9.903 | 0 |
| 9.904 | 0 |
| 9.905 | 0 |
| 9.906 | 0 |
| 9.907 | 0 |
| 9.908 | 0 |
| 9.909 | 0 |
| 9.91 | 0 |
| 9.911 | 0 |
| 9.912 | 0 |
| 9.913 | 0 |
| 9.914 | 0 |
| 9.915 | 0 |
| 9.916 | 0 |
| 9.917 | 0 |
| 9.918 | 0 |
| 9.919 | 0 |
| 9.92 | 0 |
| 9.921 | 0 |
| 9.922 | 0 |
| 9.923 | 0 |
| 9.924 | 0 |
| 9.925 | 0 |
| 9.926 | 0 |
| 9.927 | 0 |
| 9.928 | 0 |
| 9.929 | 0 |
| 9.93 | 0 |
| 9.931 | 0 |
| 9.932 | 0 |
| 9.933 | 0 |
| 9.934 | 0 |
| 9.935 | 0 |
| 9.936 | 0 |
| 9.937 | 0 |
| 9.938 | 0 |
| 9.939 | 0 |
| 9.94 | 0 |
| 9.941 | 0 |
| 9.942 | 0 |
| 9.943 | 0 |
| 9.944 | 0 |
| 9.945 | 0 |
| 9.946 | 0 |
| 9.947 | 0 |
| 9.948 | 0 |
| 9.949 | 0 |
| 9.95 | 0 |
| 9.951 | 0 |
| 9.952 | 0 |
| 9.953 | 0 |
| 9.954 | 0 |
| 9.955 | 0 |
| 9.956 | 0 |
| 9.957 | 0 |
| 9.958 | 0 |
| 9.959 | 0 |
| 9.96 | 0 |
| 9.961 | 0 |
| 9.962 | 0 |
| 9.963 | 0 |
| 9.964 | 0 |
| 9.965 | 0 |
| 9.966 | 0 |
| 9.967 | 0 |
| 9.968 | 0 |
| 9.969 | 0 |
| 9.97 | 0 |
| 9.971 | 0 |
| 9.972 | 0 |
| 9.973 | 0 |
| 9.974 | 0 |
| 9.975 | 0 |
| 9.976 | 0 |
| 9.977 | 0 |
| 9.978 | 0 |
| 9.979 | 0 |
| 9.98 | 0 |
| 9.981 | 0 |
| 9.982 | 0 |
| 9.983 | 0 |
| 9.984 | 0 |
| 9.985 | 0 |
| 9.986 | 0 |
| 9.987 | 0 |
| 9.988 | 0 |
| 9.989 | 0 |
| 9.99 | 0 |
| 9.991 | 0 |
| 9.992 | 0 |
| 9.993 | 0 |
| 9.994 | 0 |
| 9.995 | 0 |
| 9.996 | 0 |
| 9.997 | 0 |
| 9.998 | 0 |
| 9.999 | 0 |
| 10.0 | 0 |